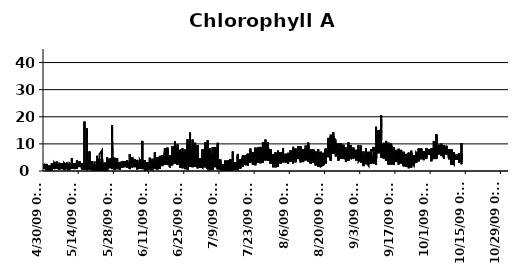
| Category | ug/L |
|---|---|
| 10/13/09 | 5.2 |
| 10/13/09 | 5.2 |
| 10/13/09 | 5.9 |
| 10/13/09 | 5.5 |
| 10/13/09 | 5.2 |
| 10/13/09 | 5.5 |
| 10/13/09 | 3.6 |
| 10/13/09 | 4.7 |
| 10/13/09 | 5.2 |
| 10/13/09 | 4.5 |
| 10/13/09 | 5 |
| 10/13/09 | 6 |
| 10/13/09 | 4.4 |
| 10/13/09 | 4.2 |
| 10/13/09 | 4.8 |
| 10/13/09 | 3.8 |
| 10/13/09 | 3.7 |
| 10/13/09 | 2.5 |
| 10/13/09 | 2.9 |
| 10/13/09 | 3 |
| 10/13/09 | 3.1 |
| 10/13/09 | 3.5 |
| 10/13/09 | 4.1 |
| 10/13/09 | 4 |
| 10/13/09 | 3.4 |
| 10/13/09 | 3.9 |
| 10/13/09 | 3.7 |
| 10/13/09 | 3.9 |
| 10/13/09 | 10.3 |
| 10/13/09 | 3.6 |
| 10/13/09 | 3.6 |
| 10/13/09 | 5.2 |
| 10/12/09 | 5 |
| 10/12/09 | 5.5 |
| 10/12/09 | 3.6 |
| 10/12/09 | 5 |
| 10/12/09 | 4.4 |
| 10/12/09 | 3.9 |
| 10/12/09 | 5.3 |
| 10/12/09 | 4.4 |
| 10/12/09 | 5.6 |
| 10/12/09 | 6.2 |
| 10/12/09 | 5.9 |
| 10/12/09 | 5.2 |
| 10/12/09 | 5.2 |
| 10/12/09 | 4.6 |
| 10/12/09 | 4.1 |
| 10/12/09 | 4.8 |
| 10/12/09 | 4.7 |
| 10/12/09 | 4.6 |
| 10/12/09 | 5.4 |
| 10/12/09 | 5.1 |
| 10/12/09 | 4.1 |
| 10/12/09 | 4.8 |
| 10/12/09 | 5.3 |
| 10/12/09 | 5.9 |
| 10/12/09 | 5.3 |
| 10/12/09 | 6.5 |
| 10/12/09 | 5.3 |
| 10/12/09 | 5.5 |
| 10/12/09 | 4.9 |
| 10/12/09 | 5.9 |
| 10/12/09 | 4.3 |
| 10/12/09 | 5.9 |
| 10/12/09 | 5.2 |
| 10/12/09 | 6.1 |
| 10/12/09 | 5 |
| 10/12/09 | 4.5 |
| 10/12/09 | 5 |
| 10/12/09 | 5.3 |
| 10/12/09 | 3.4 |
| 10/12/09 | 4.4 |
| 10/12/09 | 3.1 |
| 10/12/09 | 3.6 |
| 10/12/09 | 3.1 |
| 10/12/09 | 4.2 |
| 10/12/09 | 5.3 |
| 10/12/09 | 4.3 |
| 10/12/09 | 3.4 |
| 10/12/09 | 4.4 |
| 10/11/09 | 5.1 |
| 10/11/09 | 4.6 |
| 10/11/09 | 5.5 |
| 10/11/09 | 4.8 |
| 10/11/09 | 5.3 |
| 10/11/09 | 4.7 |
| 10/11/09 | 5.6 |
| 10/11/09 | 4.6 |
| 10/11/09 | 5.1 |
| 10/11/09 | 4.1 |
| 10/11/09 | 5.2 |
| 10/11/09 | 5.5 |
| 10/11/09 | 5.5 |
| 10/11/09 | 5.6 |
| 10/11/09 | 4.7 |
| 10/11/09 | 5.4 |
| 10/11/09 | 4.7 |
| 10/11/09 | 5.6 |
| 10/11/09 | 4.8 |
| 10/11/09 | 4.3 |
| 10/11/09 | 5.6 |
| 10/11/09 | 5.8 |
| 10/11/09 | 5.8 |
| 10/11/09 | 6.1 |
| 10/11/09 | 5.7 |
| 10/11/09 | 5.2 |
| 10/11/09 | 4.8 |
| 10/11/09 | 5 |
| 10/11/09 | 5.3 |
| 10/11/09 | 4.4 |
| 10/11/09 | 4.6 |
| 10/11/09 | 4.9 |
| 10/11/09 | 4.4 |
| 10/11/09 | 5.9 |
| 10/11/09 | 5.2 |
| 10/11/09 | 5.6 |
| 10/11/09 | 5.2 |
| 10/11/09 | 4.5 |
| 10/11/09 | 5.3 |
| 10/11/09 | 4.8 |
| 10/11/09 | 5.3 |
| 10/11/09 | 4.6 |
| 10/11/09 | 6.1 |
| 10/11/09 | 4.4 |
| 10/11/09 | 5.7 |
| 10/11/09 | 5 |
| 10/11/09 | 5.1 |
| 10/11/09 | 4.8 |
| 10/10/09 | 4.4 |
| 10/10/09 | 4.7 |
| 10/10/09 | 4.8 |
| 10/10/09 | 4.8 |
| 10/10/09 | 3.3 |
| 10/10/09 | 4.6 |
| 10/10/09 | 4.4 |
| 10/10/09 | 4.6 |
| 10/10/09 | 5.1 |
| 10/10/09 | 4.6 |
| 10/10/09 | 4.8 |
| 10/10/09 | 5.5 |
| 10/10/09 | 5 |
| 10/10/09 | 6.6 |
| 10/10/09 | 6.1 |
| 10/10/09 | 6.2 |
| 10/10/09 | 5.2 |
| 10/10/09 | 6.6 |
| 10/10/09 | 5.7 |
| 10/10/09 | 5.9 |
| 10/10/09 | 6.6 |
| 10/10/09 | 6.2 |
| 10/10/09 | 5.1 |
| 10/10/09 | 7 |
| 10/10/09 | 5.6 |
| 10/10/09 | 6.1 |
| 10/10/09 | 4.4 |
| 10/10/09 | 5.7 |
| 10/10/09 | 4.9 |
| 10/10/09 | 5.8 |
| 10/10/09 | 6.3 |
| 10/10/09 | 5.4 |
| 10/10/09 | 4.2 |
| 10/10/09 | 5.6 |
| 10/10/09 | 5.2 |
| 10/10/09 | 5.5 |
| 10/10/09 | 6.3 |
| 10/10/09 | 5 |
| 10/10/09 | 4.9 |
| 10/10/09 | 6.4 |
| 10/10/09 | 6.4 |
| 10/10/09 | 5.8 |
| 10/10/09 | 6.2 |
| 10/10/09 | 5.6 |
| 10/10/09 | 5.3 |
| 10/10/09 | 3.4 |
| 10/10/09 | 4.9 |
| 10/10/09 | 2.4 |
| 10/9/09 | 3.3 |
| 10/9/09 | 4.7 |
| 10/9/09 | 3.6 |
| 10/9/09 | 3.5 |
| 10/9/09 | 3.2 |
| 10/9/09 | 5.4 |
| 10/9/09 | 5.5 |
| 10/9/09 | 5.3 |
| 10/9/09 | 6.5 |
| 10/9/09 | 7.1 |
| 10/9/09 | 6.5 |
| 10/9/09 | 3.3 |
| 10/9/09 | 6.6 |
| 10/9/09 | 3.5 |
| 10/9/09 | 8 |
| 10/9/09 | 7 |
| 10/9/09 | 7.9 |
| 10/9/09 | 5 |
| 10/9/09 | 5.4 |
| 10/9/09 | 5.5 |
| 10/9/09 | 5.2 |
| 10/9/09 | 4.7 |
| 10/9/09 | 5.4 |
| 10/9/09 | 4.3 |
| 10/9/09 | 2.3 |
| 10/9/09 | 3.6 |
| 10/9/09 | 3.6 |
| 10/9/09 | 3.8 |
| 10/9/09 | 3.8 |
| 10/9/09 | 5.5 |
| 10/9/09 | 5.5 |
| 10/9/09 | 5.2 |
| 10/9/09 | 4.7 |
| 10/9/09 | 4.5 |
| 10/9/09 | 5 |
| 10/9/09 | 4.2 |
| 10/9/09 | 2.6 |
| 10/9/09 | 3.3 |
| 10/9/09 | 3.9 |
| 10/9/09 | 4.3 |
| 10/9/09 | 3.8 |
| 10/9/09 | 3.7 |
| 10/9/09 | 2.4 |
| 10/9/09 | 3.1 |
| 10/9/09 | 4.2 |
| 10/9/09 | 4.9 |
| 10/9/09 | 5 |
| 10/9/09 | 4.8 |
| 10/8/09 | 6.9 |
| 10/8/09 | 5.7 |
| 10/8/09 | 7 |
| 10/8/09 | 6.9 |
| 10/8/09 | 6.2 |
| 10/8/09 | 6.2 |
| 10/8/09 | 6.6 |
| 10/8/09 | 5.9 |
| 10/8/09 | 5.8 |
| 10/8/09 | 4.8 |
| 10/8/09 | 6.7 |
| 10/8/09 | 6.3 |
| 10/8/09 | 6.3 |
| 10/8/09 | 6 |
| 10/8/09 | 6.3 |
| 10/8/09 | 8 |
| 10/8/09 | 7.4 |
| 10/8/09 | 7.8 |
| 10/8/09 | 6.7 |
| 10/8/09 | 6.2 |
| 10/8/09 | 6.4 |
| 10/8/09 | 7.7 |
| 10/8/09 | 7.3 |
| 10/8/09 | 5.6 |
| 10/8/09 | 5.9 |
| 10/8/09 | 5.2 |
| 10/8/09 | 5.2 |
| 10/8/09 | 5.4 |
| 10/8/09 | 5.6 |
| 10/8/09 | 5.9 |
| 10/8/09 | 6.4 |
| 10/8/09 | 7.2 |
| 10/8/09 | 5.6 |
| 10/8/09 | 5.5 |
| 10/8/09 | 7.1 |
| 10/8/09 | 6.5 |
| 10/8/09 | 6.6 |
| 10/8/09 | 7.7 |
| 10/8/09 | 6.3 |
| 10/8/09 | 6.5 |
| 10/8/09 | 6.5 |
| 10/8/09 | 5.6 |
| 10/8/09 | 4.3 |
| 10/8/09 | 7 |
| 10/8/09 | 5.1 |
| 10/8/09 | 5.5 |
| 10/8/09 | 7.2 |
| 10/8/09 | 6.6 |
| 10/7/09 | 7.8 |
| 10/7/09 | 6.1 |
| 10/7/09 | 7.1 |
| 10/7/09 | 6.2 |
| 10/7/09 | 8.1 |
| 10/7/09 | 8 |
| 10/7/09 | 7 |
| 10/7/09 | 8.5 |
| 10/7/09 | 7.3 |
| 10/7/09 | 7.9 |
| 10/7/09 | 7 |
| 10/7/09 | 7 |
| 10/7/09 | 6.8 |
| 10/7/09 | 6.7 |
| 10/7/09 | 7 |
| 10/7/09 | 8.2 |
| 10/7/09 | 6.4 |
| 10/7/09 | 6.2 |
| 10/7/09 | 6.7 |
| 10/7/09 | 6.4 |
| 10/7/09 | 7.5 |
| 10/7/09 | 6.8 |
| 10/7/09 | 6.5 |
| 10/7/09 | 7 |
| 10/7/09 | 7.4 |
| 10/7/09 | 6.8 |
| 10/7/09 | 6.5 |
| 10/7/09 | 6.9 |
| 10/7/09 | 6.8 |
| 10/7/09 | 8.3 |
| 10/7/09 | 7.8 |
| 10/7/09 | 8.1 |
| 10/7/09 | 7.1 |
| 10/7/09 | 8.2 |
| 10/7/09 | 7.9 |
| 10/7/09 | 7.5 |
| 10/7/09 | 9.3 |
| 10/7/09 | 9.3 |
| 10/7/09 | 8.5 |
| 10/7/09 | 7.2 |
| 10/7/09 | 7.3 |
| 10/7/09 | 7.6 |
| 10/7/09 | 7.6 |
| 10/7/09 | 8.2 |
| 10/7/09 | 8.4 |
| 10/7/09 | 7.8 |
| 10/7/09 | 6.9 |
| 10/7/09 | 8.4 |
| 10/6/09 | 8.1 |
| 10/6/09 | 7.3 |
| 10/6/09 | 7.3 |
| 10/6/09 | 7.5 |
| 10/6/09 | 8 |
| 10/6/09 | 8.3 |
| 10/6/09 | 7.3 |
| 10/6/09 | 5.5 |
| 10/6/09 | 5.8 |
| 10/6/09 | 7.4 |
| 10/6/09 | 7.6 |
| 10/6/09 | 6.8 |
| 10/6/09 | 7.3 |
| 10/6/09 | 7.1 |
| 10/6/09 | 5.2 |
| 10/6/09 | 7.3 |
| 10/6/09 | 7.2 |
| 10/6/09 | 8.6 |
| 10/6/09 | 8.2 |
| 10/6/09 | 6.4 |
| 10/6/09 | 7.2 |
| 10/6/09 | 4.9 |
| 10/6/09 | 6.6 |
| 10/6/09 | 6.3 |
| 10/6/09 | 6.5 |
| 10/6/09 | 6.7 |
| 10/6/09 | 6.4 |
| 10/6/09 | 5.2 |
| 10/6/09 | 6 |
| 10/6/09 | 7.6 |
| 10/6/09 | 9.4 |
| 10/6/09 | 8.9 |
| 10/6/09 | 9.2 |
| 10/6/09 | 9 |
| 10/6/09 | 7.8 |
| 10/6/09 | 8.2 |
| 10/6/09 | 7.8 |
| 10/6/09 | 7.6 |
| 10/6/09 | 4.6 |
| 10/6/09 | 8.4 |
| 10/6/09 | 8 |
| 10/6/09 | 8.3 |
| 10/6/09 | 8.2 |
| 10/6/09 | 9.4 |
| 10/6/09 | 5.8 |
| 10/6/09 | 6.2 |
| 10/6/09 | 6.7 |
| 10/6/09 | 6.4 |
| 10/5/09 | 7.4 |
| 10/5/09 | 7.5 |
| 10/5/09 | 7.3 |
| 10/5/09 | 6.5 |
| 10/5/09 | 6.1 |
| 10/5/09 | 7.9 |
| 10/5/09 | 8.5 |
| 10/5/09 | 7 |
| 10/5/09 | 5.5 |
| 10/5/09 | 8.9 |
| 10/5/09 | 7.4 |
| 10/5/09 | 6.9 |
| 10/5/09 | 7.8 |
| 10/5/09 | 7 |
| 10/5/09 | 7.1 |
| 10/5/09 | 8.4 |
| 10/5/09 | 6.9 |
| 10/5/09 | 7.5 |
| 10/5/09 | 8.5 |
| 10/5/09 | 8.3 |
| 10/5/09 | 8 |
| 10/5/09 | 7.9 |
| 10/5/09 | 7.2 |
| 10/5/09 | 9.1 |
| 10/5/09 | 10.1 |
| 10/5/09 | 8.6 |
| 10/5/09 | 8.5 |
| 10/5/09 | 8.1 |
| 10/5/09 | 6.5 |
| 10/5/09 | 8.5 |
| 10/5/09 | 8 |
| 10/5/09 | 7.8 |
| 10/5/09 | 8.8 |
| 10/5/09 | 9.5 |
| 10/5/09 | 9 |
| 10/5/09 | 8.6 |
| 10/5/09 | 7.7 |
| 10/5/09 | 7.3 |
| 10/5/09 | 8.1 |
| 10/5/09 | 7.6 |
| 10/5/09 | 7 |
| 10/5/09 | 8.1 |
| 10/5/09 | 8.5 |
| 10/5/09 | 7.7 |
| 10/5/09 | 7.5 |
| 10/5/09 | 7 |
| 10/5/09 | 7.1 |
| 10/5/09 | 7.5 |
| 10/4/09 | 8 |
| 10/4/09 | 9.7 |
| 10/4/09 | 8 |
| 10/4/09 | 8.1 |
| 10/4/09 | 8.6 |
| 10/4/09 | 8 |
| 10/4/09 | 8.9 |
| 10/4/09 | 7.6 |
| 10/4/09 | 8.9 |
| 10/4/09 | 8.6 |
| 10/4/09 | 8.4 |
| 10/4/09 | 8.7 |
| 10/4/09 | 8.1 |
| 10/4/09 | 8.6 |
| 10/4/09 | 9.2 |
| 10/4/09 | 9.5 |
| 10/4/09 | 9.3 |
| 10/4/09 | 7.5 |
| 10/4/09 | 7.8 |
| 10/4/09 | 8 |
| 10/4/09 | 8.1 |
| 10/4/09 | 9.3 |
| 10/4/09 | 7.7 |
| 10/4/09 | 8.3 |
| 10/4/09 | 7.6 |
| 10/4/09 | 7.8 |
| 10/4/09 | 7.9 |
| 10/4/09 | 7.5 |
| 10/4/09 | 8 |
| 10/4/09 | 7.1 |
| 10/4/09 | 8.7 |
| 10/4/09 | 7.5 |
| 10/4/09 | 6.5 |
| 10/4/09 | 7.7 |
| 10/4/09 | 7.8 |
| 10/4/09 | 8 |
| 10/4/09 | 6.4 |
| 10/4/09 | 6.4 |
| 10/4/09 | 7.8 |
| 10/4/09 | 6.6 |
| 10/4/09 | 8.2 |
| 10/4/09 | 7.9 |
| 10/4/09 | 8.7 |
| 10/4/09 | 8.3 |
| 10/4/09 | 8.8 |
| 10/4/09 | 8.2 |
| 10/4/09 | 8.3 |
| 10/4/09 | 6.1 |
| 10/3/09 | 8.8 |
| 10/3/09 | 7.6 |
| 10/3/09 | 8.5 |
| 10/3/09 | 6.6 |
| 10/3/09 | 5 |
| 10/3/09 | 5.6 |
| 10/3/09 | 6.6 |
| 10/3/09 | 8 |
| 10/3/09 | 6.7 |
| 10/3/09 | 6.6 |
| 10/3/09 | 7.3 |
| 10/3/09 | 8.6 |
| 10/3/09 | 8.4 |
| 10/3/09 | 8.7 |
| 10/3/09 | 9.7 |
| 10/3/09 | 10.7 |
| 10/3/09 | 12.1 |
| 10/3/09 | 13.4 |
| 10/3/09 | 9.8 |
| 10/3/09 | 7.5 |
| 10/3/09 | 9.2 |
| 10/3/09 | 10.5 |
| 10/3/09 | 11 |
| 10/3/09 | 13.5 |
| 10/3/09 | 9.5 |
| 10/3/09 | 9.2 |
| 10/3/09 | 7.1 |
| 10/3/09 | 6.5 |
| 10/3/09 | 4.5 |
| 10/3/09 | 6.2 |
| 10/3/09 | 5.5 |
| 10/3/09 | 6.4 |
| 10/3/09 | 5.3 |
| 10/3/09 | 6.9 |
| 10/3/09 | 6.6 |
| 10/3/09 | 5.8 |
| 10/3/09 | 4.4 |
| 10/3/09 | 7.4 |
| 10/3/09 | 7 |
| 10/3/09 | 6.2 |
| 10/3/09 | 4.7 |
| 10/3/09 | 6 |
| 10/3/09 | 6.1 |
| 10/3/09 | 5.3 |
| 10/3/09 | 5.5 |
| 10/3/09 | 5.4 |
| 10/3/09 | 6.2 |
| 10/3/09 | 5.7 |
| 10/2/09 | 6.4 |
| 10/2/09 | 6.7 |
| 10/2/09 | 7.7 |
| 10/2/09 | 7.6 |
| 10/2/09 | 6.6 |
| 10/2/09 | 6.5 |
| 10/2/09 | 5.3 |
| 10/2/09 | 7.5 |
| 10/2/09 | 7.6 |
| 10/2/09 | 7.2 |
| 10/2/09 | 7.5 |
| 10/2/09 | 7.9 |
| 10/2/09 | 8.4 |
| 10/2/09 | 8.4 |
| 10/2/09 | 7.2 |
| 10/2/09 | 5.9 |
| 10/2/09 | 7.7 |
| 10/2/09 | 7.9 |
| 10/2/09 | 8.6 |
| 10/2/09 | 4.7 |
| 10/2/09 | 11 |
| 10/2/09 | 4.4 |
| 10/2/09 | 4.4 |
| 10/2/09 | 7.3 |
| 10/2/09 | 5.2 |
| 10/2/09 | 7.4 |
| 10/2/09 | 7.3 |
| 10/2/09 | 6.6 |
| 10/2/09 | 5.9 |
| 10/2/09 | 6.1 |
| 10/2/09 | 5.5 |
| 10/2/09 | 6.7 |
| 10/2/09 | 5.8 |
| 10/2/09 | 5.6 |
| 10/2/09 | 5 |
| 10/2/09 | 6 |
| 10/2/09 | 6 |
| 10/2/09 | 5.3 |
| 10/2/09 | 5.9 |
| 10/2/09 | 6.1 |
| 10/2/09 | 5.8 |
| 10/2/09 | 5.2 |
| 10/2/09 | 6.1 |
| 10/2/09 | 5.5 |
| 10/2/09 | 6.2 |
| 10/2/09 | 5.8 |
| 10/2/09 | 5.5 |
| 10/2/09 | 5.6 |
| 10/1/09 | 4.9 |
| 10/1/09 | 6.1 |
| 10/1/09 | 3.6 |
| 10/1/09 | 5.7 |
| 10/1/09 | 5.7 |
| 10/1/09 | 5.1 |
| 10/1/09 | 6.2 |
| 10/1/09 | 5.6 |
| 10/1/09 | 5.8 |
| 10/1/09 | 6.3 |
| 10/1/09 | 5.3 |
| 10/1/09 | 6.8 |
| 10/1/09 | 6 |
| 10/1/09 | 5.8 |
| 10/1/09 | 6.7 |
| 10/1/09 | 5.5 |
| 10/1/09 | 6 |
| 10/1/09 | 7.6 |
| 10/1/09 | 6.3 |
| 10/1/09 | 8.3 |
| 10/1/09 | 6 |
| 10/1/09 | 7.2 |
| 10/1/09 | 5.8 |
| 10/1/09 | 5.2 |
| 10/1/09 | 5.4 |
| 10/1/09 | 5.2 |
| 10/1/09 | 4.7 |
| 10/1/09 | 4.8 |
| 10/1/09 | 4.2 |
| 10/1/09 | 5.4 |
| 10/1/09 | 5.2 |
| 10/1/09 | 5 |
| 10/1/09 | 5.5 |
| 10/1/09 | 5 |
| 10/1/09 | 4.8 |
| 10/1/09 | 5.5 |
| 10/1/09 | 5 |
| 10/1/09 | 5.1 |
| 10/1/09 | 4.8 |
| 10/1/09 | 7.2 |
| 10/1/09 | 5.8 |
| 10/1/09 | 6.6 |
| 10/1/09 | 6.5 |
| 10/1/09 | 6.7 |
| 10/1/09 | 5.5 |
| 10/1/09 | 6.2 |
| 10/1/09 | 5.8 |
| 10/1/09 | 6.3 |
| 9/30/09 | 6.5 |
| 9/30/09 | 6.3 |
| 9/30/09 | 7.2 |
| 9/30/09 | 7.3 |
| 9/30/09 | 6.8 |
| 9/30/09 | 7.5 |
| 9/30/09 | 6.2 |
| 9/30/09 | 6.2 |
| 9/30/09 | 7.2 |
| 9/30/09 | 7.1 |
| 9/30/09 | 6.3 |
| 9/30/09 | 6.6 |
| 9/30/09 | 7.6 |
| 9/30/09 | 7.3 |
| 9/30/09 | 7.4 |
| 9/30/09 | 7.2 |
| 9/30/09 | 7.7 |
| 9/30/09 | 6.1 |
| 9/30/09 | 6.5 |
| 9/30/09 | 6.5 |
| 9/30/09 | 7.1 |
| 9/30/09 | 7.1 |
| 9/30/09 | 7.1 |
| 9/30/09 | 7.9 |
| 9/30/09 | 7.9 |
| 9/30/09 | 8 |
| 9/30/09 | 7.8 |
| 9/30/09 | 6.2 |
| 9/30/09 | 6.3 |
| 9/30/09 | 6.9 |
| 9/30/09 | 6.8 |
| 9/30/09 | 6.2 |
| 9/30/09 | 6.6 |
| 9/30/09 | 6.8 |
| 9/30/09 | 6.2 |
| 9/30/09 | 5.9 |
| 9/30/09 | 6.6 |
| 9/30/09 | 7.9 |
| 9/30/09 | 6.2 |
| 9/30/09 | 6.7 |
| 9/30/09 | 6.1 |
| 9/30/09 | 7 |
| 9/30/09 | 6.4 |
| 9/30/09 | 7.8 |
| 9/30/09 | 7.4 |
| 9/30/09 | 6.5 |
| 9/30/09 | 6 |
| 9/30/09 | 6.9 |
| 9/29/09 | 7.7 |
| 9/29/09 | 7 |
| 9/29/09 | 7.1 |
| 9/29/09 | 6.3 |
| 9/29/09 | 7.3 |
| 9/29/09 | 7.9 |
| 9/29/09 | 7.1 |
| 9/29/09 | 8 |
| 9/29/09 | 7.9 |
| 9/29/09 | 6.8 |
| 9/29/09 | 7.9 |
| 9/29/09 | 6.3 |
| 9/29/09 | 6.6 |
| 9/29/09 | 8.5 |
| 9/29/09 | 7 |
| 9/29/09 | 6.5 |
| 9/29/09 | 7.4 |
| 9/29/09 | 7.8 |
| 9/29/09 | 7.2 |
| 9/29/09 | 7.8 |
| 9/29/09 | 7.3 |
| 9/29/09 | 6 |
| 9/29/09 | 7.4 |
| 9/29/09 | 6.4 |
| 9/29/09 | 5.8 |
| 9/29/09 | 6.9 |
| 9/29/09 | 5.9 |
| 9/29/09 | 6.2 |
| 9/29/09 | 5.5 |
| 9/29/09 | 4.4 |
| 9/29/09 | 6.1 |
| 9/29/09 | 5.3 |
| 9/29/09 | 5.3 |
| 9/29/09 | 5.4 |
| 9/29/09 | 6.1 |
| 9/29/09 | 6.2 |
| 9/29/09 | 6 |
| 9/29/09 | 6.8 |
| 9/29/09 | 5.4 |
| 9/29/09 | 7.2 |
| 9/29/09 | 6 |
| 9/29/09 | 5.8 |
| 9/29/09 | 5 |
| 9/29/09 | 5.9 |
| 9/29/09 | 5.6 |
| 9/29/09 | 6.7 |
| 9/29/09 | 5.4 |
| 9/29/09 | 5.5 |
| 9/28/09 | 5.8 |
| 9/28/09 | 6 |
| 9/28/09 | 5.6 |
| 9/28/09 | 6.1 |
| 9/28/09 | 6.2 |
| 9/28/09 | 6.6 |
| 9/28/09 | 7.3 |
| 9/28/09 | 7.1 |
| 9/28/09 | 7.6 |
| 9/28/09 | 6.8 |
| 9/28/09 | 5.6 |
| 9/28/09 | 6.6 |
| 9/28/09 | 6.5 |
| 9/28/09 | 7.1 |
| 9/28/09 | 6.8 |
| 9/28/09 | 6.8 |
| 9/28/09 | 6 |
| 9/28/09 | 7.3 |
| 9/28/09 | 7.5 |
| 9/28/09 | 6.6 |
| 9/28/09 | 6.7 |
| 9/28/09 | 6.2 |
| 9/28/09 | 5.4 |
| 9/28/09 | 7.1 |
| 9/28/09 | 6.8 |
| 9/28/09 | 5.7 |
| 9/28/09 | 5.7 |
| 9/28/09 | 4.9 |
| 9/28/09 | 5.4 |
| 9/28/09 | 5.4 |
| 9/28/09 | 5.8 |
| 9/28/09 | 5.1 |
| 9/28/09 | 6 |
| 9/28/09 | 5.6 |
| 9/28/09 | 4.9 |
| 9/28/09 | 5.7 |
| 9/28/09 | 5.1 |
| 9/28/09 | 6 |
| 9/28/09 | 5.2 |
| 9/28/09 | 4.8 |
| 9/28/09 | 5.8 |
| 9/28/09 | 4.9 |
| 9/28/09 | 5.9 |
| 9/28/09 | 4.5 |
| 9/28/09 | 4 |
| 9/28/09 | 5.1 |
| 9/28/09 | 5.6 |
| 9/28/09 | 5.8 |
| 9/27/09 | 5.2 |
| 9/27/09 | 5.4 |
| 9/27/09 | 5.8 |
| 9/27/09 | 5.5 |
| 9/27/09 | 6 |
| 9/27/09 | 4.7 |
| 9/27/09 | 5.9 |
| 9/27/09 | 5.2 |
| 9/27/09 | 4.9 |
| 9/27/09 | 6.8 |
| 9/27/09 | 6 |
| 9/27/09 | 7 |
| 9/27/09 | 6.4 |
| 9/27/09 | 6.9 |
| 9/27/09 | 4.9 |
| 9/27/09 | 5.2 |
| 9/27/09 | 5.4 |
| 9/27/09 | 5.7 |
| 9/27/09 | 6.8 |
| 9/27/09 | 7 |
| 9/27/09 | 5.4 |
| 9/27/09 | 7.1 |
| 9/27/09 | 6.2 |
| 9/27/09 | 6.7 |
| 9/27/09 | 8.1 |
| 9/27/09 | 5.8 |
| 9/27/09 | 8.3 |
| 9/27/09 | 6.9 |
| 9/27/09 | 6.2 |
| 9/27/09 | 6 |
| 9/27/09 | 6.2 |
| 9/27/09 | 5.9 |
| 9/27/09 | 6.1 |
| 9/27/09 | 4.8 |
| 9/27/09 | 6.5 |
| 9/27/09 | 5.1 |
| 9/27/09 | 6 |
| 9/27/09 | 5.2 |
| 9/27/09 | 5 |
| 9/27/09 | 4.8 |
| 9/27/09 | 5.4 |
| 9/27/09 | 4.6 |
| 9/27/09 | 5.1 |
| 9/27/09 | 5.5 |
| 9/27/09 | 4.9 |
| 9/27/09 | 5.2 |
| 9/27/09 | 4.3 |
| 9/27/09 | 5.5 |
| 9/26/09 | 4.3 |
| 9/26/09 | 6.6 |
| 9/26/09 | 7.2 |
| 9/26/09 | 5.1 |
| 9/26/09 | 5.9 |
| 9/26/09 | 4.6 |
| 9/26/09 | 8.3 |
| 9/26/09 | 7.7 |
| 9/26/09 | 8.1 |
| 9/26/09 | 5.4 |
| 9/26/09 | 7 |
| 9/26/09 | 7.4 |
| 9/26/09 | 7.4 |
| 9/26/09 | 7.6 |
| 9/26/09 | 7.1 |
| 9/26/09 | 6.5 |
| 9/26/09 | 6 |
| 9/26/09 | 7.1 |
| 9/26/09 | 6.5 |
| 9/26/09 | 6.8 |
| 9/26/09 | 7 |
| 9/26/09 | 5 |
| 9/26/09 | 6.8 |
| 9/26/09 | 6.1 |
| 9/26/09 | 7 |
| 9/26/09 | 5.9 |
| 9/26/09 | 6.7 |
| 9/26/09 | 6.1 |
| 9/26/09 | 5.5 |
| 9/26/09 | 5.8 |
| 9/26/09 | 5.2 |
| 9/26/09 | 4.4 |
| 9/26/09 | 4.9 |
| 9/26/09 | 4.1 |
| 9/26/09 | 3.6 |
| 9/26/09 | 5 |
| 9/26/09 | 5.3 |
| 9/26/09 | 4.5 |
| 9/26/09 | 5.6 |
| 9/26/09 | 5.5 |
| 9/26/09 | 6.7 |
| 9/26/09 | 6 |
| 9/26/09 | 6.1 |
| 9/26/09 | 6.2 |
| 9/26/09 | 5.3 |
| 9/26/09 | 4.5 |
| 9/26/09 | 6.5 |
| 9/26/09 | 5.4 |
| 9/25/09 | 6.7 |
| 9/25/09 | 6.3 |
| 9/25/09 | 6.6 |
| 9/25/09 | 5.4 |
| 9/25/09 | 5.2 |
| 9/25/09 | 4.5 |
| 9/25/09 | 5.4 |
| 9/25/09 | 5.4 |
| 9/25/09 | 5.4 |
| 9/25/09 | 5.5 |
| 9/25/09 | 4 |
| 9/25/09 | 3.1 |
| 9/25/09 | 2.9 |
| 9/25/09 | 4.8 |
| 9/25/09 | 5.5 |
| 9/25/09 | 5.1 |
| 9/25/09 | 5.2 |
| 9/25/09 | 4.7 |
| 9/25/09 | 5.4 |
| 9/25/09 | 6 |
| 9/25/09 | 6.2 |
| 9/25/09 | 5 |
| 9/25/09 | 5.7 |
| 9/25/09 | 4.8 |
| 9/25/09 | 4.6 |
| 9/25/09 | 6.9 |
| 9/25/09 | 4.3 |
| 9/25/09 | 4.9 |
| 9/25/09 | 5.3 |
| 9/25/09 | 5.1 |
| 9/25/09 | 4.9 |
| 9/25/09 | 5.8 |
| 9/25/09 | 5.5 |
| 9/25/09 | 5.6 |
| 9/25/09 | 4.1 |
| 9/25/09 | 4.7 |
| 9/25/09 | 3.1 |
| 9/25/09 | 5.5 |
| 9/25/09 | 3.5 |
| 9/25/09 | 4.8 |
| 9/25/09 | 5.1 |
| 9/25/09 | 4.5 |
| 9/25/09 | 4.7 |
| 9/25/09 | 4.6 |
| 9/25/09 | 4.4 |
| 9/25/09 | 3.4 |
| 9/25/09 | 3.6 |
| 9/25/09 | 3 |
| 9/24/09 | 4.7 |
| 9/24/09 | 3.9 |
| 9/24/09 | 3.3 |
| 9/24/09 | 5.4 |
| 9/24/09 | 4.5 |
| 9/24/09 | 5.4 |
| 9/24/09 | 2.1 |
| 9/24/09 | 2.1 |
| 9/24/09 | 3.7 |
| 9/24/09 | 5.7 |
| 9/24/09 | 4.8 |
| 9/24/09 | 4.1 |
| 9/24/09 | 5.5 |
| 9/24/09 | 3.6 |
| 9/24/09 | 2.8 |
| 9/24/09 | 4.1 |
| 9/24/09 | 3.8 |
| 9/24/09 | 3.5 |
| 9/24/09 | 2.9 |
| 9/24/09 | 3.5 |
| 9/24/09 | 3.1 |
| 9/24/09 | 3.5 |
| 9/24/09 | 4 |
| 9/24/09 | 5.6 |
| 9/24/09 | 4.4 |
| 9/24/09 | 3.6 |
| 9/24/09 | 3.4 |
| 9/24/09 | 2.8 |
| 9/24/09 | 3.8 |
| 9/24/09 | 3.9 |
| 9/24/09 | 3.9 |
| 9/24/09 | 3.3 |
| 9/24/09 | 3.5 |
| 9/24/09 | 3.6 |
| 9/24/09 | 3.6 |
| 9/24/09 | 5.2 |
| 9/24/09 | 3.4 |
| 9/24/09 | 3.3 |
| 9/24/09 | 5.6 |
| 9/24/09 | 3.4 |
| 9/24/09 | 3.6 |
| 9/24/09 | 4.3 |
| 9/24/09 | 2.5 |
| 9/24/09 | 3.3 |
| 9/24/09 | 4.2 |
| 9/24/09 | 5.1 |
| 9/24/09 | 3.1 |
| 9/24/09 | 2.1 |
| 9/23/09 | 3.6 |
| 9/23/09 | 3.8 |
| 9/23/09 | 2.6 |
| 9/23/09 | 2.3 |
| 9/23/09 | 3.2 |
| 9/23/09 | 4.6 |
| 9/23/09 | 3.3 |
| 9/23/09 | 3.9 |
| 9/23/09 | 4.8 |
| 9/23/09 | 1.3 |
| 9/23/09 | 2 |
| 9/23/09 | 3.7 |
| 9/23/09 | 3.6 |
| 9/23/09 | 4.7 |
| 9/23/09 | 4.3 |
| 9/23/09 | 2.7 |
| 9/23/09 | 6.2 |
| 9/23/09 | 6.9 |
| 9/23/09 | 2.9 |
| 9/23/09 | 3.7 |
| 9/23/09 | 7.5 |
| 9/23/09 | 4.6 |
| 9/23/09 | 4.8 |
| 9/23/09 | 5.5 |
| 9/23/09 | 4.4 |
| 9/23/09 | 4.5 |
| 9/23/09 | 6 |
| 9/23/09 | 3.7 |
| 9/23/09 | 3.5 |
| 9/23/09 | 6.5 |
| 9/23/09 | 3.5 |
| 9/23/09 | 4 |
| 9/23/09 | 5.2 |
| 9/23/09 | 4 |
| 9/23/09 | 4.8 |
| 9/23/09 | 4.2 |
| 9/23/09 | 3.2 |
| 9/23/09 | 4 |
| 9/23/09 | 2.8 |
| 9/23/09 | 2.8 |
| 9/23/09 | 3.1 |
| 9/23/09 | 3.6 |
| 9/23/09 | 3.9 |
| 9/23/09 | 3.7 |
| 9/23/09 | 4.9 |
| 9/23/09 | 5.1 |
| 9/23/09 | 4.6 |
| 9/23/09 | 3.6 |
| 9/22/09 | 3.6 |
| 9/22/09 | 4.5 |
| 9/22/09 | 3.7 |
| 9/22/09 | 5.6 |
| 9/22/09 | 6.2 |
| 9/22/09 | 5.9 |
| 9/22/09 | 4.8 |
| 9/22/09 | 1.7 |
| 9/22/09 | 1 |
| 9/22/09 | 3.7 |
| 9/22/09 | 4.8 |
| 9/22/09 | 6 |
| 9/22/09 | 6 |
| 9/22/09 | 6.8 |
| 9/22/09 | 6.7 |
| 9/22/09 | 6.8 |
| 9/22/09 | 6.2 |
| 9/22/09 | 6.1 |
| 9/22/09 | 6.6 |
| 9/22/09 | 4.6 |
| 9/22/09 | 4.1 |
| 9/22/09 | 6.6 |
| 9/22/09 | 6.8 |
| 9/22/09 | 4.3 |
| 9/22/09 | 3.6 |
| 9/22/09 | 2.8 |
| 9/22/09 | 4.2 |
| 9/22/09 | 3 |
| 9/22/09 | 5.3 |
| 9/22/09 | 1.5 |
| 9/22/09 | 3.2 |
| 9/22/09 | 2.5 |
| 9/22/09 | 3.8 |
| 9/22/09 | 3.5 |
| 9/22/09 | 3.8 |
| 9/22/09 | 3.9 |
| 9/22/09 | 2.8 |
| 9/22/09 | 3.9 |
| 9/22/09 | 4.2 |
| 9/22/09 | 2.8 |
| 9/22/09 | 3 |
| 9/22/09 | 2.7 |
| 9/22/09 | 3.4 |
| 9/22/09 | 3.8 |
| 9/22/09 | 1.9 |
| 9/22/09 | 2.5 |
| 9/22/09 | 2.1 |
| 9/22/09 | 4.2 |
| 9/21/09 | 4.7 |
| 9/21/09 | 4.3 |
| 9/21/09 | 5.3 |
| 9/21/09 | 4.3 |
| 9/21/09 | 6.3 |
| 9/21/09 | 6.1 |
| 9/21/09 | 5.8 |
| 9/21/09 | 5 |
| 9/21/09 | 4.2 |
| 9/21/09 | 4.9 |
| 9/21/09 | 4.2 |
| 9/21/09 | 5.5 |
| 9/21/09 | 3.2 |
| 9/21/09 | 4.6 |
| 9/21/09 | 4.5 |
| 9/21/09 | 2.4 |
| 9/21/09 | 2.9 |
| 9/21/09 | 4.4 |
| 9/21/09 | 2.7 |
| 9/21/09 | 2.6 |
| 9/21/09 | 3.4 |
| 9/21/09 | 4.3 |
| 9/21/09 | 1.5 |
| 9/21/09 | 4.2 |
| 9/21/09 | 3.3 |
| 9/21/09 | 4.3 |
| 9/21/09 | 3.6 |
| 9/21/09 | 2.3 |
| 9/21/09 | 4.1 |
| 9/21/09 | 2.6 |
| 9/21/09 | 3.9 |
| 9/21/09 | 2.1 |
| 9/21/09 | 2 |
| 9/21/09 | 2.1 |
| 9/21/09 | 2.4 |
| 9/21/09 | 3.6 |
| 9/21/09 | 2.7 |
| 9/21/09 | 2.3 |
| 9/21/09 | 4.1 |
| 9/21/09 | 3.2 |
| 9/21/09 | 4.3 |
| 9/21/09 | 4.5 |
| 9/21/09 | 4.5 |
| 9/21/09 | 3.5 |
| 9/21/09 | 3.3 |
| 9/21/09 | 3.1 |
| 9/21/09 | 4.6 |
| 9/21/09 | 4.4 |
| 9/20/09 | 3.6 |
| 9/20/09 | 2.8 |
| 9/20/09 | 2.5 |
| 9/20/09 | 2.9 |
| 9/20/09 | 3.1 |
| 9/20/09 | 5.3 |
| 9/20/09 | 5.6 |
| 9/20/09 | 7.1 |
| 9/20/09 | 3.2 |
| 9/20/09 | 1.7 |
| 9/20/09 | 5.7 |
| 9/20/09 | 3.4 |
| 9/20/09 | 2.5 |
| 9/20/09 | 4.2 |
| 9/20/09 | 2 |
| 9/20/09 | 2.3 |
| 9/20/09 | 4.1 |
| 9/20/09 | 3.1 |
| 9/20/09 | 6.2 |
| 9/20/09 | 5.9 |
| 9/20/09 | 6.6 |
| 9/20/09 | 3.6 |
| 9/20/09 | 4.6 |
| 9/20/09 | 3.3 |
| 9/20/09 | 5.2 |
| 9/20/09 | 4.2 |
| 9/20/09 | 5.8 |
| 9/20/09 | 5.6 |
| 9/20/09 | 4.7 |
| 9/20/09 | 3.3 |
| 9/20/09 | 4.7 |
| 9/20/09 | 4.1 |
| 9/20/09 | 5.1 |
| 9/20/09 | 5.5 |
| 9/20/09 | 5.9 |
| 9/20/09 | 5.2 |
| 9/20/09 | 5.5 |
| 9/20/09 | 4.6 |
| 9/20/09 | 6.1 |
| 9/20/09 | 4.4 |
| 9/20/09 | 5.1 |
| 9/20/09 | 4 |
| 9/20/09 | 5 |
| 9/20/09 | 4.7 |
| 9/20/09 | 3.7 |
| 9/20/09 | 5.3 |
| 9/20/09 | 4.8 |
| 9/20/09 | 3.9 |
| 9/19/09 | 4.1 |
| 9/19/09 | 4.6 |
| 9/19/09 | 5.2 |
| 9/19/09 | 3.3 |
| 9/19/09 | 3.4 |
| 9/19/09 | 3.3 |
| 9/19/09 | 5 |
| 9/19/09 | 4.3 |
| 9/19/09 | 5.4 |
| 9/19/09 | 4.2 |
| 9/19/09 | 3.7 |
| 9/19/09 | 3.5 |
| 9/19/09 | 3.8 |
| 9/19/09 | 7.1 |
| 9/19/09 | 7.3 |
| 9/19/09 | 6.1 |
| 9/19/09 | 4 |
| 9/19/09 | 3.8 |
| 9/19/09 | 5 |
| 9/19/09 | 5.1 |
| 9/19/09 | 6.8 |
| 9/19/09 | 6.2 |
| 9/19/09 | 5.4 |
| 9/19/09 | 5.9 |
| 9/19/09 | 7 |
| 9/19/09 | 6.1 |
| 9/19/09 | 6.2 |
| 9/19/09 | 5.9 |
| 9/19/09 | 7.1 |
| 9/19/09 | 5.9 |
| 9/19/09 | 5.2 |
| 9/19/09 | 4.5 |
| 9/19/09 | 4.7 |
| 9/19/09 | 6.1 |
| 9/19/09 | 4.2 |
| 9/19/09 | 3.9 |
| 9/19/09 | 3.2 |
| 9/19/09 | 5.3 |
| 9/19/09 | 7.8 |
| 9/19/09 | 4.2 |
| 9/19/09 | 4.4 |
| 9/19/09 | 6.5 |
| 9/19/09 | 2.8 |
| 9/19/09 | 3.4 |
| 9/19/09 | 3.6 |
| 9/19/09 | 4.4 |
| 9/19/09 | 5 |
| 9/19/09 | 5 |
| 9/18/09 | 3.5 |
| 9/18/09 | 5.4 |
| 9/18/09 | 7.5 |
| 9/18/09 | 6 |
| 9/18/09 | 6.5 |
| 9/18/09 | 6.6 |
| 9/18/09 | 7 |
| 9/18/09 | 7.4 |
| 9/18/09 | 5.8 |
| 9/18/09 | 2.9 |
| 9/18/09 | 2.4 |
| 9/18/09 | 3.6 |
| 9/18/09 | 8 |
| 9/18/09 | 3.4 |
| 9/18/09 | 7.6 |
| 9/18/09 | 7.3 |
| 9/18/09 | 8.2 |
| 9/18/09 | 6.1 |
| 9/18/09 | 5.6 |
| 9/18/09 | 6 |
| 9/18/09 | 6 |
| 9/18/09 | 5.3 |
| 9/18/09 | 4.4 |
| 9/18/09 | 4.6 |
| 9/18/09 | 5.1 |
| 9/18/09 | 4.3 |
| 9/18/09 | 4.1 |
| 9/18/09 | 4.5 |
| 9/18/09 | 5.5 |
| 9/18/09 | 4.3 |
| 9/18/09 | 6.3 |
| 9/18/09 | 5 |
| 9/18/09 | 5.4 |
| 9/18/09 | 5.2 |
| 9/18/09 | 5.2 |
| 9/18/09 | 6.4 |
| 9/18/09 | 5.3 |
| 9/18/09 | 4 |
| 9/18/09 | 3.6 |
| 9/18/09 | 3.7 |
| 9/18/09 | 5.1 |
| 9/18/09 | 4.6 |
| 9/18/09 | 7.3 |
| 9/18/09 | 4.9 |
| 9/18/09 | 5.8 |
| 9/18/09 | 4.3 |
| 9/18/09 | 4.2 |
| 9/18/09 | 5.8 |
| 9/17/09 | 5.7 |
| 9/17/09 | 4.9 |
| 9/17/09 | 5.7 |
| 9/17/09 | 4.8 |
| 9/17/09 | 5.3 |
| 9/17/09 | 6 |
| 9/17/09 | 3.8 |
| 9/17/09 | 5.5 |
| 9/17/09 | 4.9 |
| 9/17/09 | 5.5 |
| 9/17/09 | 3.9 |
| 9/17/09 | 6.4 |
| 9/17/09 | 6 |
| 9/17/09 | 6.4 |
| 9/17/09 | 5.1 |
| 9/17/09 | 5.6 |
| 9/17/09 | 5.4 |
| 9/17/09 | 6.5 |
| 9/17/09 | 6.9 |
| 9/17/09 | 7 |
| 9/17/09 | 5.8 |
| 9/17/09 | 4.8 |
| 9/17/09 | 5.6 |
| 9/17/09 | 7.8 |
| 9/17/09 | 7 |
| 9/17/09 | 6.5 |
| 9/17/09 | 6.2 |
| 9/17/09 | 6.1 |
| 9/17/09 | 6.3 |
| 9/17/09 | 5.8 |
| 9/17/09 | 7 |
| 9/17/09 | 4.2 |
| 9/17/09 | 5.7 |
| 9/17/09 | 6.4 |
| 9/17/09 | 4.3 |
| 9/17/09 | 3.8 |
| 9/17/09 | 3.5 |
| 9/17/09 | 3.6 |
| 9/17/09 | 3.3 |
| 9/17/09 | 5.6 |
| 9/17/09 | 5 |
| 9/17/09 | 4.7 |
| 9/17/09 | 5.3 |
| 9/17/09 | 4.5 |
| 9/17/09 | 4.9 |
| 9/17/09 | 4.6 |
| 9/17/09 | 6.7 |
| 9/17/09 | 5.1 |
| 9/16/09 | 3.4 |
| 9/16/09 | 3.8 |
| 9/16/09 | 5.2 |
| 9/16/09 | 3.5 |
| 9/16/09 | 3.8 |
| 9/16/09 | 5.2 |
| 9/16/09 | 4.4 |
| 9/16/09 | 3.7 |
| 9/16/09 | 6.1 |
| 9/16/09 | 5 |
| 9/16/09 | 5.1 |
| 9/16/09 | 6.7 |
| 9/16/09 | 7 |
| 9/16/09 | 8.3 |
| 9/16/09 | 7.4 |
| 9/16/09 | 7.2 |
| 9/16/09 | 7.4 |
| 9/16/09 | 7.8 |
| 9/16/09 | 8.8 |
| 9/16/09 | 7.7 |
| 9/16/09 | 6.6 |
| 9/16/09 | 8.3 |
| 9/16/09 | 8.4 |
| 9/16/09 | 7.9 |
| 9/16/09 | 7.3 |
| 9/16/09 | 7.5 |
| 9/16/09 | 7.7 |
| 9/16/09 | 7.9 |
| 9/16/09 | 7.1 |
| 9/16/09 | 7.5 |
| 9/16/09 | 7.9 |
| 9/16/09 | 6.5 |
| 9/16/09 | 5.5 |
| 9/16/09 | 3.4 |
| 9/16/09 | 4 |
| 9/16/09 | 2.7 |
| 9/16/09 | 3.3 |
| 9/16/09 | 2.2 |
| 9/16/09 | 3.3 |
| 9/16/09 | 3.6 |
| 9/16/09 | 3.6 |
| 9/16/09 | 2.6 |
| 9/16/09 | 4 |
| 9/16/09 | 3.9 |
| 9/16/09 | 3.6 |
| 9/16/09 | 3.6 |
| 9/16/09 | 4.2 |
| 9/16/09 | 5.7 |
| 9/15/09 | 2.8 |
| 9/15/09 | 3.6 |
| 9/15/09 | 4.6 |
| 9/15/09 | 4.5 |
| 9/15/09 | 6.2 |
| 9/15/09 | 7.2 |
| 9/15/09 | 9.7 |
| 9/15/09 | 10 |
| 9/15/09 | 10.1 |
| 9/15/09 | 4.5 |
| 9/15/09 | 5.9 |
| 9/15/09 | 9.1 |
| 9/15/09 | 2.8 |
| 9/15/09 | 9.3 |
| 9/15/09 | 2.4 |
| 9/15/09 | 9.5 |
| 9/15/09 | 9.2 |
| 9/15/09 | 7.2 |
| 9/15/09 | 7.9 |
| 9/15/09 | 7.4 |
| 9/15/09 | 9.6 |
| 9/15/09 | 8.2 |
| 9/15/09 | 9.2 |
| 9/15/09 | 7.1 |
| 9/15/09 | 6.3 |
| 9/15/09 | 2.7 |
| 9/15/09 | 7.7 |
| 9/15/09 | 4.9 |
| 9/15/09 | 3.9 |
| 9/15/09 | 5 |
| 9/15/09 | 5.1 |
| 9/15/09 | 4.8 |
| 9/15/09 | 4.2 |
| 9/15/09 | 4.2 |
| 9/15/09 | 3.7 |
| 9/15/09 | 6.7 |
| 9/15/09 | 4.7 |
| 9/15/09 | 4.8 |
| 9/15/09 | 4.6 |
| 9/15/09 | 5.7 |
| 9/15/09 | 5.9 |
| 9/15/09 | 3.4 |
| 9/15/09 | 4.7 |
| 9/15/09 | 5.1 |
| 9/15/09 | 6.1 |
| 9/15/09 | 4.6 |
| 9/15/09 | 6 |
| 9/15/09 | 5.3 |
| 9/14/09 | 5.2 |
| 9/14/09 | 5.4 |
| 9/14/09 | 5.5 |
| 9/14/09 | 8.7 |
| 9/14/09 | 7.8 |
| 9/14/09 | 10.4 |
| 9/14/09 | 9.1 |
| 9/14/09 | 9.2 |
| 9/14/09 | 9.5 |
| 9/14/09 | 8.8 |
| 9/14/09 | 7.8 |
| 9/14/09 | 2.9 |
| 9/14/09 | 8.9 |
| 9/14/09 | 8.5 |
| 9/14/09 | 8.4 |
| 9/14/09 | 10.2 |
| 9/14/09 | 10.2 |
| 9/14/09 | 10.4 |
| 9/14/09 | 9.4 |
| 9/14/09 | 9.6 |
| 9/14/09 | 9 |
| 9/14/09 | 8.9 |
| 9/14/09 | 8.2 |
| 9/14/09 | 2.6 |
| 9/14/09 | 3.6 |
| 9/14/09 | 3.3 |
| 9/14/09 | 2.9 |
| 9/14/09 | 2.9 |
| 9/14/09 | 2.3 |
| 9/14/09 | 7 |
| 9/14/09 | 5.7 |
| 9/14/09 | 6 |
| 9/14/09 | 5.6 |
| 9/14/09 | 4.7 |
| 9/14/09 | 3.7 |
| 9/14/09 | 4.7 |
| 9/14/09 | 4.4 |
| 9/14/09 | 4.3 |
| 9/14/09 | 4.7 |
| 9/14/09 | 9.2 |
| 9/14/09 | 5.9 |
| 9/14/09 | 5.6 |
| 9/14/09 | 7.9 |
| 9/14/09 | 7.2 |
| 9/14/09 | 6.2 |
| 9/14/09 | 8.1 |
| 9/14/09 | 7.7 |
| 9/14/09 | 7.2 |
| 9/13/09 | 7.7 |
| 9/13/09 | 7.2 |
| 9/13/09 | 4.6 |
| 9/13/09 | 6.9 |
| 9/13/09 | 6.1 |
| 9/13/09 | 9.2 |
| 9/13/09 | 8.1 |
| 9/13/09 | 8.2 |
| 9/13/09 | 10.4 |
| 9/13/09 | 8.5 |
| 9/13/09 | 8.8 |
| 9/13/09 | 7.5 |
| 9/13/09 | 10.9 |
| 9/13/09 | 9.1 |
| 9/13/09 | 9.9 |
| 9/13/09 | 11.1 |
| 9/13/09 | 10.1 |
| 9/13/09 | 10.6 |
| 9/13/09 | 8.9 |
| 9/13/09 | 10 |
| 9/13/09 | 9.8 |
| 9/13/09 | 8.6 |
| 9/13/09 | 8.2 |
| 9/13/09 | 9.7 |
| 9/13/09 | 10.1 |
| 9/13/09 | 8.8 |
| 9/13/09 | 6.1 |
| 9/13/09 | 4.9 |
| 9/13/09 | 6.3 |
| 9/13/09 | 6.6 |
| 9/13/09 | 5.6 |
| 9/13/09 | 6.8 |
| 9/13/09 | 6.6 |
| 9/13/09 | 7 |
| 9/13/09 | 6.4 |
| 9/13/09 | 6 |
| 9/13/09 | 5.8 |
| 9/13/09 | 5.2 |
| 9/13/09 | 5.1 |
| 9/13/09 | 4.7 |
| 9/13/09 | 6.3 |
| 9/13/09 | 3.7 |
| 9/13/09 | 4.6 |
| 9/13/09 | 4.5 |
| 9/13/09 | 5.3 |
| 9/13/09 | 5.1 |
| 9/13/09 | 5.7 |
| 9/13/09 | 4.2 |
| 9/12/09 | 6.1 |
| 9/12/09 | 5.4 |
| 9/12/09 | 6.2 |
| 9/12/09 | 7.5 |
| 9/12/09 | 7.2 |
| 9/12/09 | 6.4 |
| 9/12/09 | 8.6 |
| 9/12/09 | 8.5 |
| 9/12/09 | 9.7 |
| 9/12/09 | 8.9 |
| 9/12/09 | 8.9 |
| 9/12/09 | 7.8 |
| 9/12/09 | 5.6 |
| 9/12/09 | 6.1 |
| 9/12/09 | 7.5 |
| 9/12/09 | 6.5 |
| 9/12/09 | 7.4 |
| 9/12/09 | 8 |
| 9/12/09 | 10.4 |
| 9/12/09 | 8.5 |
| 9/12/09 | 6.9 |
| 9/12/09 | 9.1 |
| 9/12/09 | 9.2 |
| 9/12/09 | 9.8 |
| 9/12/09 | 6.5 |
| 9/12/09 | 8 |
| 9/12/09 | 7.4 |
| 9/12/09 | 8.5 |
| 9/12/09 | 7 |
| 9/12/09 | 9.4 |
| 9/12/09 | 5.4 |
| 9/12/09 | 6.4 |
| 9/12/09 | 6.8 |
| 9/12/09 | 6.9 |
| 9/12/09 | 5.6 |
| 9/12/09 | 5.5 |
| 9/12/09 | 6.4 |
| 9/12/09 | 6 |
| 9/12/09 | 5.9 |
| 9/12/09 | 4.6 |
| 9/12/09 | 6.5 |
| 9/12/09 | 7 |
| 9/12/09 | 5.1 |
| 9/12/09 | 5.8 |
| 9/12/09 | 5.8 |
| 9/12/09 | 6.7 |
| 9/12/09 | 6.4 |
| 9/12/09 | 7.7 |
| 9/11/09 | 5 |
| 9/11/09 | 4.9 |
| 9/11/09 | 5.9 |
| 9/11/09 | 6.3 |
| 9/11/09 | 9 |
| 9/11/09 | 8.9 |
| 9/11/09 | 8.6 |
| 9/11/09 | 7.5 |
| 9/11/09 | 8 |
| 9/11/09 | 9.8 |
| 9/11/09 | 8.3 |
| 9/11/09 | 8.1 |
| 9/11/09 | 8.7 |
| 9/11/09 | 8.4 |
| 9/11/09 | 8.9 |
| 9/11/09 | 9.4 |
| 9/11/09 | 9.1 |
| 9/11/09 | 7.9 |
| 9/11/09 | 7.2 |
| 9/11/09 | 8.9 |
| 9/11/09 | 7 |
| 9/11/09 | 7.2 |
| 9/11/09 | 8.2 |
| 9/11/09 | 9 |
| 9/11/09 | 7.6 |
| 9/11/09 | 8.6 |
| 9/11/09 | 8.9 |
| 9/11/09 | 16.8 |
| 9/11/09 | 19.3 |
| 9/11/09 | 20.5 |
| 9/11/09 | 15.9 |
| 9/11/09 | 18.7 |
| 9/11/09 | 20.5 |
| 9/11/09 | 18.2 |
| 9/11/09 | 19 |
| 9/11/09 | 13.4 |
| 9/11/09 | 13 |
| 9/11/09 | 11.6 |
| 9/11/09 | 17.9 |
| 9/11/09 | 15.7 |
| 9/11/09 | 14.5 |
| 9/11/09 | 15.1 |
| 9/11/09 | 11.2 |
| 9/11/09 | 11.6 |
| 9/11/09 | 11.2 |
| 9/11/09 | 14 |
| 9/11/09 | 15.7 |
| 9/10/09 | 12.1 |
| 9/10/09 | 12.4 |
| 9/10/09 | 9.7 |
| 9/10/09 | 15.1 |
| 9/10/09 | 13.2 |
| 9/10/09 | 11.8 |
| 9/10/09 | 12.1 |
| 9/10/09 | 11.8 |
| 9/10/09 | 14.1 |
| 9/10/09 | 13.2 |
| 9/10/09 | 14.7 |
| 9/10/09 | 11.7 |
| 9/10/09 | 13.4 |
| 9/10/09 | 13.3 |
| 9/10/09 | 11.6 |
| 9/10/09 | 10.6 |
| 9/10/09 | 10.6 |
| 9/10/09 | 11.7 |
| 9/10/09 | 11.6 |
| 9/10/09 | 13 |
| 9/10/09 | 10.7 |
| 9/10/09 | 8.3 |
| 9/10/09 | 7.4 |
| 9/10/09 | 9.6 |
| 9/10/09 | 11.3 |
| 9/10/09 | 7.9 |
| 9/10/09 | 8.5 |
| 9/10/09 | 10 |
| 9/10/09 | 10.5 |
| 9/10/09 | 11.7 |
| 9/10/09 | 9 |
| 9/10/09 | 8.4 |
| 9/10/09 | 11.2 |
| 9/10/09 | 7.3 |
| 9/10/09 | 6.5 |
| 9/10/09 | 6.2 |
| 9/10/09 | 7.8 |
| 9/10/09 | 7.7 |
| 9/10/09 | 7.7 |
| 9/10/09 | 6.7 |
| 9/10/09 | 8.7 |
| 9/10/09 | 8.6 |
| 9/10/09 | 9.4 |
| 9/10/09 | 9.8 |
| 9/10/09 | 10 |
| 9/10/09 | 7.2 |
| 9/10/09 | 12.6 |
| 9/10/09 | 12.2 |
| 9/9/09 | 12.2 |
| 9/9/09 | 8.4 |
| 9/9/09 | 8.6 |
| 9/9/09 | 15.3 |
| 9/9/09 | 9.6 |
| 9/9/09 | 12.2 |
| 9/9/09 | 10 |
| 9/9/09 | 8.5 |
| 9/9/09 | 9.4 |
| 9/9/09 | 12.6 |
| 9/9/09 | 11.2 |
| 9/9/09 | 12.9 |
| 9/9/09 | 11.1 |
| 9/9/09 | 8 |
| 9/9/09 | 8.7 |
| 9/9/09 | 12.7 |
| 9/9/09 | 10 |
| 9/9/09 | 7.1 |
| 9/9/09 | 9.4 |
| 9/9/09 | 7.6 |
| 9/9/09 | 9.2 |
| 9/9/09 | 7.5 |
| 9/9/09 | 4.8 |
| 9/9/09 | 8.4 |
| 9/9/09 | 7.4 |
| 9/9/09 | 6.2 |
| 9/9/09 | 6.4 |
| 9/9/09 | 2.2 |
| 9/9/09 | 16.3 |
| 9/9/09 | 6.7 |
| 9/9/09 | 8.9 |
| 9/9/09 | 5.9 |
| 9/9/09 | 6.1 |
| 9/9/09 | 9.3 |
| 9/9/09 | 4.6 |
| 9/9/09 | 6.3 |
| 9/9/09 | 5.4 |
| 9/9/09 | 4.4 |
| 9/9/09 | 4.3 |
| 9/9/09 | 4.5 |
| 9/9/09 | 4.8 |
| 9/9/09 | 5.3 |
| 9/9/09 | 5.4 |
| 9/9/09 | 11.1 |
| 9/9/09 | 4.7 |
| 9/9/09 | 5.8 |
| 9/9/09 | 4.2 |
| 9/9/09 | 7.4 |
| 9/8/09 | 4.2 |
| 9/8/09 | 3.1 |
| 9/8/09 | 4.2 |
| 9/8/09 | 4.4 |
| 9/8/09 | 3.9 |
| 9/8/09 | 2.7 |
| 9/8/09 | 4.6 |
| 9/8/09 | 5 |
| 9/8/09 | 6.6 |
| 9/8/09 | 6.5 |
| 9/8/09 | 8.9 |
| 9/8/09 | 7.5 |
| 9/8/09 | 7.9 |
| 9/8/09 | 7.6 |
| 9/8/09 | 8.7 |
| 9/8/09 | 8.6 |
| 9/8/09 | 8.4 |
| 9/8/09 | 7.5 |
| 9/8/09 | 8.2 |
| 9/8/09 | 7.4 |
| 9/8/09 | 5.3 |
| 9/8/09 | 5.6 |
| 9/8/09 | 3.1 |
| 9/8/09 | 3.8 |
| 9/8/09 | 4.5 |
| 9/8/09 | 5.6 |
| 9/8/09 | 3.1 |
| 9/8/09 | 4.3 |
| 9/8/09 | 4.2 |
| 9/8/09 | 4.6 |
| 9/8/09 | 3.4 |
| 9/8/09 | 3.8 |
| 9/8/09 | 4.8 |
| 9/8/09 | 5.1 |
| 9/8/09 | 4.4 |
| 9/8/09 | 3.5 |
| 9/8/09 | 3.3 |
| 9/8/09 | 3.3 |
| 9/8/09 | 4.2 |
| 9/8/09 | 5.4 |
| 9/8/09 | 4.5 |
| 9/8/09 | 4.5 |
| 9/8/09 | 4.5 |
| 9/8/09 | 4.7 |
| 9/8/09 | 3.8 |
| 9/8/09 | 4.5 |
| 9/8/09 | 5.7 |
| 9/8/09 | 4.4 |
| 9/7/09 | 5 |
| 9/7/09 | 3.8 |
| 9/7/09 | 3.9 |
| 9/7/09 | 3.6 |
| 9/7/09 | 4.8 |
| 9/7/09 | 3.1 |
| 9/7/09 | 4.6 |
| 9/7/09 | 5.2 |
| 9/7/09 | 5.2 |
| 9/7/09 | 5.7 |
| 9/7/09 | 8.1 |
| 9/7/09 | 4.1 |
| 9/7/09 | 4.5 |
| 9/7/09 | 3 |
| 9/7/09 | 3 |
| 9/7/09 | 3.5 |
| 9/7/09 | 3.3 |
| 9/7/09 | 4.2 |
| 9/7/09 | 4.7 |
| 9/7/09 | 4.5 |
| 9/7/09 | 5.4 |
| 9/7/09 | 3.7 |
| 9/7/09 | 2.6 |
| 9/7/09 | 5.1 |
| 9/7/09 | 4.1 |
| 9/7/09 | 3.2 |
| 9/7/09 | 3.5 |
| 9/7/09 | 3.7 |
| 9/7/09 | 4 |
| 9/7/09 | 3.9 |
| 9/7/09 | 4.6 |
| 9/7/09 | 3.8 |
| 9/7/09 | 3.1 |
| 9/7/09 | 3.8 |
| 9/7/09 | 3.8 |
| 9/7/09 | 4.2 |
| 9/7/09 | 5.1 |
| 9/7/09 | 5 |
| 9/7/09 | 4.5 |
| 9/7/09 | 5.7 |
| 9/7/09 | 4.8 |
| 9/7/09 | 4.2 |
| 9/7/09 | 4.7 |
| 9/7/09 | 5.5 |
| 9/7/09 | 6.5 |
| 9/7/09 | 4.5 |
| 9/7/09 | 5.7 |
| 9/7/09 | 6 |
| 9/6/09 | 4.7 |
| 9/6/09 | 5.3 |
| 9/6/09 | 3.5 |
| 9/6/09 | 6 |
| 9/6/09 | 4.2 |
| 9/6/09 | 5 |
| 9/6/09 | 2.6 |
| 9/6/09 | 4.9 |
| 9/6/09 | 5.5 |
| 9/6/09 | 4.9 |
| 9/6/09 | 4.5 |
| 9/6/09 | 5.7 |
| 9/6/09 | 3 |
| 9/6/09 | 6.7 |
| 9/6/09 | 6.8 |
| 9/6/09 | 6.4 |
| 9/6/09 | 5.5 |
| 9/6/09 | 5.2 |
| 9/6/09 | 7.1 |
| 9/6/09 | 6.1 |
| 9/6/09 | 5.6 |
| 9/6/09 | 5.5 |
| 9/6/09 | 6.3 |
| 9/6/09 | 5.7 |
| 9/6/09 | 5.3 |
| 9/6/09 | 4.5 |
| 9/6/09 | 6.7 |
| 9/6/09 | 5.5 |
| 9/6/09 | 4.1 |
| 9/6/09 | 3.8 |
| 9/6/09 | 4.3 |
| 9/6/09 | 4 |
| 9/6/09 | 3.7 |
| 9/6/09 | 4.6 |
| 9/6/09 | 3.5 |
| 9/6/09 | 2.9 |
| 9/6/09 | 4.6 |
| 9/6/09 | 4 |
| 9/6/09 | 5 |
| 9/6/09 | 4.4 |
| 9/6/09 | 3.5 |
| 9/6/09 | 3.1 |
| 9/6/09 | 3.7 |
| 9/6/09 | 2.8 |
| 9/6/09 | 2.7 |
| 9/6/09 | 3 |
| 9/6/09 | 4.5 |
| 9/6/09 | 2.1 |
| 9/5/09 | 3.6 |
| 9/5/09 | 2.8 |
| 9/5/09 | 2.5 |
| 9/5/09 | 3.8 |
| 9/5/09 | 4.4 |
| 9/5/09 | 3.5 |
| 9/5/09 | 4.8 |
| 9/5/09 | 8.4 |
| 9/5/09 | 7.9 |
| 9/5/09 | 4.5 |
| 9/5/09 | 3.3 |
| 9/5/09 | 6.4 |
| 9/5/09 | 4.3 |
| 9/5/09 | 5.9 |
| 9/5/09 | 5.3 |
| 9/5/09 | 3.5 |
| 9/5/09 | 2.5 |
| 9/5/09 | 2.4 |
| 9/5/09 | 3.7 |
| 9/5/09 | 4.2 |
| 9/5/09 | 3.1 |
| 9/5/09 | 3.2 |
| 9/5/09 | 2.8 |
| 9/5/09 | 4.5 |
| 9/5/09 | 3.1 |
| 9/5/09 | 2.7 |
| 9/5/09 | 3.2 |
| 9/5/09 | 5.3 |
| 9/5/09 | 3.1 |
| 9/5/09 | 2.9 |
| 9/5/09 | 3.5 |
| 9/5/09 | 4 |
| 9/5/09 | 4.5 |
| 9/5/09 | 3.8 |
| 9/5/09 | 4.5 |
| 9/5/09 | 4.3 |
| 9/5/09 | 3.1 |
| 9/5/09 | 3 |
| 9/5/09 | 4 |
| 9/5/09 | 2.8 |
| 9/5/09 | 4.1 |
| 9/5/09 | 5.8 |
| 9/5/09 | 3.5 |
| 9/5/09 | 3.4 |
| 9/5/09 | 3.9 |
| 9/5/09 | 3.1 |
| 9/5/09 | 3.5 |
| 9/5/09 | 3.8 |
| 9/4/09 | 5 |
| 9/4/09 | 2.4 |
| 9/4/09 | 4.2 |
| 9/4/09 | 3.8 |
| 9/4/09 | 3.2 |
| 9/4/09 | 3.4 |
| 9/4/09 | 4.8 |
| 9/4/09 | 4 |
| 9/4/09 | 5.8 |
| 9/4/09 | 2.8 |
| 9/4/09 | 2.6 |
| 9/4/09 | 3.3 |
| 9/4/09 | 1.8 |
| 9/4/09 | 2.8 |
| 9/4/09 | 4.7 |
| 9/4/09 | 4.2 |
| 9/4/09 | 3.9 |
| 9/4/09 | 3.8 |
| 9/4/09 | 3 |
| 9/4/09 | 4.5 |
| 9/4/09 | 3.8 |
| 9/4/09 | 3.1 |
| 9/4/09 | 2.7 |
| 9/4/09 | 2.9 |
| 9/4/09 | 2 |
| 9/4/09 | 2.5 |
| 9/4/09 | 4.3 |
| 9/4/09 | 2.9 |
| 9/4/09 | 3.6 |
| 9/4/09 | 4.3 |
| 9/4/09 | 3.8 |
| 9/4/09 | 3.8 |
| 9/4/09 | 3.3 |
| 9/4/09 | 4.1 |
| 9/4/09 | 4.3 |
| 9/4/09 | 5.3 |
| 9/4/09 | 4.2 |
| 9/4/09 | 5.3 |
| 9/4/09 | 4.6 |
| 9/4/09 | 4.2 |
| 9/4/09 | 7.2 |
| 9/4/09 | 4.8 |
| 9/4/09 | 2.4 |
| 9/4/09 | 3.9 |
| 9/4/09 | 5.3 |
| 9/4/09 | 3.4 |
| 9/4/09 | 3.7 |
| 9/4/09 | 4.6 |
| 9/3/09 | 4.6 |
| 9/3/09 | 3 |
| 9/3/09 | 5.2 |
| 9/3/09 | 4.6 |
| 9/3/09 | 6.4 |
| 9/3/09 | 7.1 |
| 9/3/09 | 9.4 |
| 9/3/09 | 7.5 |
| 9/3/09 | 3.3 |
| 9/3/09 | 6.9 |
| 9/3/09 | 4.4 |
| 9/3/09 | 5.9 |
| 9/3/09 | 4.9 |
| 9/3/09 | 3.7 |
| 9/3/09 | 4.5 |
| 9/3/09 | 4.8 |
| 9/3/09 | 5.7 |
| 9/3/09 | 5.8 |
| 9/3/09 | 6.1 |
| 9/3/09 | 5.8 |
| 9/3/09 | 5 |
| 9/3/09 | 6.5 |
| 9/3/09 | 6.7 |
| 9/3/09 | 8.7 |
| 9/3/09 | 6.6 |
| 9/3/09 | 4.4 |
| 9/3/09 | 5.5 |
| 9/3/09 | 4.8 |
| 9/3/09 | 3.5 |
| 9/3/09 | 5.2 |
| 9/3/09 | 5 |
| 9/3/09 | 5.8 |
| 9/3/09 | 6.1 |
| 9/3/09 | 6.1 |
| 9/3/09 | 5.3 |
| 9/3/09 | 6.8 |
| 9/3/09 | 5.5 |
| 9/3/09 | 4.4 |
| 9/3/09 | 4.8 |
| 9/3/09 | 5.2 |
| 9/3/09 | 4.9 |
| 9/3/09 | 3.7 |
| 9/3/09 | 4.1 |
| 9/3/09 | 5.3 |
| 9/3/09 | 5.1 |
| 9/3/09 | 4.2 |
| 9/3/09 | 3.5 |
| 9/3/09 | 4.6 |
| 9/2/09 | 3.5 |
| 9/2/09 | 8 |
| 9/2/09 | 4.9 |
| 9/2/09 | 4.8 |
| 9/2/09 | 5.2 |
| 9/2/09 | 5.8 |
| 9/2/09 | 5.9 |
| 9/2/09 | 6.4 |
| 9/2/09 | 6.1 |
| 9/2/09 | 3.8 |
| 9/2/09 | 3.9 |
| 9/2/09 | 4.7 |
| 9/2/09 | 4.9 |
| 9/2/09 | 6.1 |
| 9/2/09 | 5.7 |
| 9/2/09 | 6.8 |
| 9/2/09 | 7.7 |
| 9/2/09 | 7.5 |
| 9/2/09 | 7 |
| 9/2/09 | 6.4 |
| 9/2/09 | 7.1 |
| 9/2/09 | 7.1 |
| 9/2/09 | 9.6 |
| 9/2/09 | 6.6 |
| 9/2/09 | 5.9 |
| 9/2/09 | 5.2 |
| 9/2/09 | 4.7 |
| 9/2/09 | 5.7 |
| 9/2/09 | 4.9 |
| 9/2/09 | 4.8 |
| 9/2/09 | 6.7 |
| 9/2/09 | 6.3 |
| 9/2/09 | 5.6 |
| 9/2/09 | 5.9 |
| 9/2/09 | 5.2 |
| 9/2/09 | 4.6 |
| 9/2/09 | 4.8 |
| 9/2/09 | 4.1 |
| 9/2/09 | 5.4 |
| 9/2/09 | 5.2 |
| 9/2/09 | 5.3 |
| 9/2/09 | 4.4 |
| 9/2/09 | 6.3 |
| 9/2/09 | 5.8 |
| 9/2/09 | 4.8 |
| 9/2/09 | 4.7 |
| 9/2/09 | 4.6 |
| 9/2/09 | 4.6 |
| 9/1/09 | 4.9 |
| 9/1/09 | 4.8 |
| 9/1/09 | 3.9 |
| 9/1/09 | 7.2 |
| 9/1/09 | 5.7 |
| 9/1/09 | 6.8 |
| 9/1/09 | 6 |
| 9/1/09 | 5.9 |
| 9/1/09 | 7.8 |
| 9/1/09 | 5 |
| 9/1/09 | 6.5 |
| 9/1/09 | 5 |
| 9/1/09 | 5.8 |
| 9/1/09 | 6.6 |
| 9/1/09 | 7.1 |
| 9/1/09 | 6.4 |
| 9/1/09 | 5.7 |
| 9/1/09 | 6 |
| 9/1/09 | 6.1 |
| 9/1/09 | 6.9 |
| 9/1/09 | 7 |
| 9/1/09 | 6.8 |
| 9/1/09 | 7.1 |
| 9/1/09 | 7.2 |
| 9/1/09 | 7.7 |
| 9/1/09 | 7.7 |
| 9/1/09 | 7 |
| 9/1/09 | 6 |
| 9/1/09 | 5.2 |
| 9/1/09 | 6.5 |
| 9/1/09 | 7 |
| 9/1/09 | 7 |
| 9/1/09 | 6.6 |
| 9/1/09 | 7.4 |
| 9/1/09 | 6.5 |
| 9/1/09 | 6.5 |
| 9/1/09 | 5.3 |
| 9/1/09 | 6.1 |
| 9/1/09 | 5 |
| 9/1/09 | 6.3 |
| 9/1/09 | 5.5 |
| 9/1/09 | 4.8 |
| 9/1/09 | 5.1 |
| 9/1/09 | 6.3 |
| 9/1/09 | 5 |
| 9/1/09 | 5.1 |
| 9/1/09 | 4.4 |
| 9/1/09 | 7.2 |
| 8/31/09 | 5.1 |
| 8/31/09 | 4.7 |
| 8/31/09 | 4.5 |
| 8/31/09 | 6.4 |
| 8/31/09 | 6.1 |
| 8/31/09 | 6.2 |
| 8/31/09 | 4.7 |
| 8/31/09 | 6.4 |
| 8/31/09 | 6 |
| 8/31/09 | 8.1 |
| 8/31/09 | 5.9 |
| 8/31/09 | 6.8 |
| 8/31/09 | 5.5 |
| 8/31/09 | 6.7 |
| 8/31/09 | 6.9 |
| 8/31/09 | 7.4 |
| 8/31/09 | 7.6 |
| 8/31/09 | 6 |
| 8/31/09 | 7.2 |
| 8/31/09 | 6.6 |
| 8/31/09 | 7.7 |
| 8/31/09 | 8.7 |
| 8/31/09 | 6 |
| 8/31/09 | 7.1 |
| 8/31/09 | 7.4 |
| 8/31/09 | 7.6 |
| 8/31/09 | 6.7 |
| 8/31/09 | 7.3 |
| 8/31/09 | 6.3 |
| 8/31/09 | 6.6 |
| 8/31/09 | 4.9 |
| 8/31/09 | 6.6 |
| 8/31/09 | 7.9 |
| 8/31/09 | 6.6 |
| 8/31/09 | 5.2 |
| 8/31/09 | 5.9 |
| 8/31/09 | 6.3 |
| 8/31/09 | 7.5 |
| 8/31/09 | 6 |
| 8/31/09 | 6.5 |
| 8/31/09 | 6.3 |
| 8/31/09 | 4.7 |
| 8/31/09 | 6.6 |
| 8/31/09 | 5.9 |
| 8/31/09 | 6.6 |
| 8/31/09 | 6.2 |
| 8/31/09 | 6.1 |
| 8/31/09 | 5.4 |
| 8/30/09 | 5.6 |
| 8/30/09 | 5.5 |
| 8/30/09 | 7.2 |
| 8/30/09 | 6 |
| 8/30/09 | 5.8 |
| 8/30/09 | 6.7 |
| 8/30/09 | 6.3 |
| 8/30/09 | 7.6 |
| 8/30/09 | 8.1 |
| 8/30/09 | 7.3 |
| 8/30/09 | 7.7 |
| 8/30/09 | 7.8 |
| 8/30/09 | 8.4 |
| 8/30/09 | 8.2 |
| 8/30/09 | 8.7 |
| 8/30/09 | 8.4 |
| 8/30/09 | 8.5 |
| 8/30/09 | 7.5 |
| 8/30/09 | 9.5 |
| 8/30/09 | 8.5 |
| 8/30/09 | 7.4 |
| 8/30/09 | 8.5 |
| 8/30/09 | 8.2 |
| 8/30/09 | 7.4 |
| 8/30/09 | 7.3 |
| 8/30/09 | 7.2 |
| 8/30/09 | 7 |
| 8/30/09 | 7.2 |
| 8/30/09 | 6.7 |
| 8/30/09 | 6.8 |
| 8/30/09 | 7.5 |
| 8/30/09 | 6.8 |
| 8/30/09 | 6.6 |
| 8/30/09 | 6.5 |
| 8/30/09 | 6.5 |
| 8/30/09 | 4.8 |
| 8/30/09 | 6.1 |
| 8/30/09 | 6.7 |
| 8/30/09 | 5.4 |
| 8/30/09 | 6.4 |
| 8/30/09 | 5.4 |
| 8/30/09 | 4.9 |
| 8/30/09 | 4.6 |
| 8/30/09 | 5.3 |
| 8/30/09 | 5 |
| 8/30/09 | 5.5 |
| 8/30/09 | 5.9 |
| 8/30/09 | 4.7 |
| 8/29/09 | 5.2 |
| 8/29/09 | 5.3 |
| 8/29/09 | 5.3 |
| 8/29/09 | 5.2 |
| 8/29/09 | 5.9 |
| 8/29/09 | 3.7 |
| 8/29/09 | 4.7 |
| 8/29/09 | 4.7 |
| 8/29/09 | 6 |
| 8/29/09 | 6.1 |
| 8/29/09 | 4.5 |
| 8/29/09 | 8.2 |
| 8/29/09 | 8.1 |
| 8/29/09 | 7.4 |
| 8/29/09 | 9.6 |
| 8/29/09 | 7.9 |
| 8/29/09 | 9.3 |
| 8/29/09 | 10.6 |
| 8/29/09 | 7.9 |
| 8/29/09 | 8.7 |
| 8/29/09 | 9.2 |
| 8/29/09 | 8.2 |
| 8/29/09 | 6.6 |
| 8/29/09 | 6.8 |
| 8/29/09 | 6.7 |
| 8/29/09 | 7.4 |
| 8/29/09 | 7 |
| 8/29/09 | 7 |
| 8/29/09 | 5 |
| 8/29/09 | 6 |
| 8/29/09 | 5.6 |
| 8/29/09 | 6.6 |
| 8/29/09 | 5 |
| 8/29/09 | 4.2 |
| 8/29/09 | 6.8 |
| 8/29/09 | 6.7 |
| 8/29/09 | 5 |
| 8/29/09 | 4.4 |
| 8/29/09 | 5.9 |
| 8/29/09 | 4.8 |
| 8/29/09 | 6.3 |
| 8/29/09 | 4.9 |
| 8/29/09 | 6.5 |
| 8/29/09 | 4.8 |
| 8/29/09 | 5.8 |
| 8/29/09 | 5.6 |
| 8/29/09 | 6.3 |
| 8/29/09 | 5.1 |
| 8/28/09 | 4.9 |
| 8/28/09 | 6.9 |
| 8/28/09 | 4.2 |
| 8/28/09 | 5.3 |
| 8/28/09 | 6.2 |
| 8/28/09 | 6.3 |
| 8/28/09 | 4.4 |
| 8/28/09 | 5.2 |
| 8/28/09 | 5.5 |
| 8/28/09 | 7.3 |
| 8/28/09 | 4.1 |
| 8/28/09 | 5.3 |
| 8/28/09 | 6.2 |
| 8/28/09 | 7.7 |
| 8/28/09 | 5.8 |
| 8/28/09 | 6.1 |
| 8/28/09 | 5.9 |
| 8/28/09 | 7.9 |
| 8/28/09 | 5.2 |
| 8/28/09 | 6.1 |
| 8/28/09 | 7.6 |
| 8/28/09 | 7.8 |
| 8/28/09 | 8.7 |
| 8/28/09 | 4.9 |
| 8/28/09 | 6.3 |
| 8/28/09 | 5.4 |
| 8/28/09 | 5.2 |
| 8/28/09 | 5 |
| 8/28/09 | 5.9 |
| 8/28/09 | 6.6 |
| 8/28/09 | 8 |
| 8/28/09 | 6.4 |
| 8/28/09 | 6.8 |
| 8/28/09 | 8.1 |
| 8/28/09 | 7.5 |
| 8/28/09 | 7.1 |
| 8/28/09 | 6.8 |
| 8/28/09 | 5.3 |
| 8/28/09 | 5.9 |
| 8/28/09 | 6.4 |
| 8/28/09 | 6 |
| 8/28/09 | 6.7 |
| 8/28/09 | 6.5 |
| 8/28/09 | 6.4 |
| 8/28/09 | 5.2 |
| 8/28/09 | 3.3 |
| 8/28/09 | 3.7 |
| 8/28/09 | 5.6 |
| 8/27/09 | 6.1 |
| 8/27/09 | 4.4 |
| 8/27/09 | 5.6 |
| 8/27/09 | 7.4 |
| 8/27/09 | 6.5 |
| 8/27/09 | 9.5 |
| 8/27/09 | 7.9 |
| 8/27/09 | 6.8 |
| 8/27/09 | 6.8 |
| 8/27/09 | 6.4 |
| 8/27/09 | 7.1 |
| 8/27/09 | 5.8 |
| 8/27/09 | 8.7 |
| 8/27/09 | 7.4 |
| 8/27/09 | 6.4 |
| 8/27/09 | 7.6 |
| 8/27/09 | 9.5 |
| 8/27/09 | 9.4 |
| 8/27/09 | 8.9 |
| 8/27/09 | 8.4 |
| 8/27/09 | 9.7 |
| 8/27/09 | 7.8 |
| 8/27/09 | 6.3 |
| 8/27/09 | 6.5 |
| 8/27/09 | 6.9 |
| 8/27/09 | 5.8 |
| 8/27/09 | 5.8 |
| 8/27/09 | 6.2 |
| 8/27/09 | 5.2 |
| 8/27/09 | 4.7 |
| 8/27/09 | 5.9 |
| 8/27/09 | 4.9 |
| 8/27/09 | 5.8 |
| 8/27/09 | 5 |
| 8/27/09 | 6.9 |
| 8/27/09 | 6 |
| 8/27/09 | 5.8 |
| 8/27/09 | 7.6 |
| 8/27/09 | 7.4 |
| 8/27/09 | 8.3 |
| 8/27/09 | 5.4 |
| 8/27/09 | 5.3 |
| 8/27/09 | 6.2 |
| 8/27/09 | 6.2 |
| 8/27/09 | 4.6 |
| 8/27/09 | 5.9 |
| 8/27/09 | 7.2 |
| 8/27/09 | 8.4 |
| 8/26/09 | 5.1 |
| 8/26/09 | 6 |
| 8/26/09 | 7.1 |
| 8/26/09 | 6.8 |
| 8/26/09 | 5.5 |
| 8/26/09 | 9.2 |
| 8/26/09 | 6.7 |
| 8/26/09 | 7.3 |
| 8/26/09 | 7 |
| 8/26/09 | 8.9 |
| 8/26/09 | 9.3 |
| 8/26/09 | 8.7 |
| 8/26/09 | 8.2 |
| 8/26/09 | 7.7 |
| 8/26/09 | 8.8 |
| 8/26/09 | 9.1 |
| 8/26/09 | 7.7 |
| 8/26/09 | 9.6 |
| 8/26/09 | 8.8 |
| 8/26/09 | 9.9 |
| 8/26/09 | 10.3 |
| 8/26/09 | 10.3 |
| 8/26/09 | 10.2 |
| 8/26/09 | 9.2 |
| 8/26/09 | 9.3 |
| 8/26/09 | 6 |
| 8/26/09 | 6 |
| 8/26/09 | 4.5 |
| 8/26/09 | 5.6 |
| 8/26/09 | 5.2 |
| 8/26/09 | 5.7 |
| 8/26/09 | 6.8 |
| 8/26/09 | 6.7 |
| 8/26/09 | 7.4 |
| 8/26/09 | 6.5 |
| 8/26/09 | 6.6 |
| 8/26/09 | 6.3 |
| 8/26/09 | 6.9 |
| 8/26/09 | 7.4 |
| 8/26/09 | 7.1 |
| 8/26/09 | 7.9 |
| 8/26/09 | 9 |
| 8/26/09 | 6.9 |
| 8/26/09 | 7.2 |
| 8/26/09 | 4.8 |
| 8/26/09 | 5.7 |
| 8/26/09 | 5 |
| 8/26/09 | 5.2 |
| 8/25/09 | 4.9 |
| 8/25/09 | 6.7 |
| 8/25/09 | 6.8 |
| 8/25/09 | 7.4 |
| 8/25/09 | 5.8 |
| 8/25/09 | 6.9 |
| 8/25/09 | 7.5 |
| 8/25/09 | 6.9 |
| 8/25/09 | 5.8 |
| 8/25/09 | 7.9 |
| 8/25/09 | 7.6 |
| 8/25/09 | 6.9 |
| 8/25/09 | 10.2 |
| 8/25/09 | 8.9 |
| 8/25/09 | 6.5 |
| 8/25/09 | 7.1 |
| 8/25/09 | 7.2 |
| 8/25/09 | 7.9 |
| 8/25/09 | 6.9 |
| 8/25/09 | 7.8 |
| 8/25/09 | 7.7 |
| 8/25/09 | 6.8 |
| 8/25/09 | 4.6 |
| 8/25/09 | 6.3 |
| 8/25/09 | 5.4 |
| 8/25/09 | 4.2 |
| 8/25/09 | 5.6 |
| 8/25/09 | 3.8 |
| 8/25/09 | 5.7 |
| 8/25/09 | 7.1 |
| 8/25/09 | 6.9 |
| 8/25/09 | 8.4 |
| 8/25/09 | 7.6 |
| 8/25/09 | 6.8 |
| 8/25/09 | 7.2 |
| 8/25/09 | 6.2 |
| 8/25/09 | 7 |
| 8/25/09 | 7.2 |
| 8/25/09 | 6.9 |
| 8/25/09 | 6.2 |
| 8/25/09 | 8.1 |
| 8/25/09 | 7.1 |
| 8/25/09 | 6.6 |
| 8/25/09 | 8.3 |
| 8/25/09 | 8.9 |
| 8/25/09 | 4.3 |
| 8/25/09 | 6.1 |
| 8/25/09 | 6.1 |
| 8/24/09 | 7.6 |
| 8/24/09 | 7.3 |
| 8/24/09 | 8 |
| 8/24/09 | 6.9 |
| 8/24/09 | 6.2 |
| 8/24/09 | 8.2 |
| 8/24/09 | 6.9 |
| 8/24/09 | 10 |
| 8/24/09 | 6.5 |
| 8/24/09 | 6.2 |
| 8/24/09 | 8.1 |
| 8/24/09 | 8.7 |
| 8/24/09 | 6.9 |
| 8/24/09 | 6.4 |
| 8/24/09 | 9.2 |
| 8/24/09 | 7.3 |
| 8/24/09 | 6.4 |
| 8/24/09 | 7.8 |
| 8/24/09 | 5.4 |
| 8/24/09 | 7.9 |
| 8/24/09 | 6.7 |
| 8/24/09 | 6.2 |
| 8/24/09 | 9.4 |
| 8/24/09 | 8.7 |
| 8/24/09 | 7.1 |
| 8/24/09 | 8.5 |
| 8/24/09 | 6.8 |
| 8/24/09 | 7.2 |
| 8/24/09 | 8.1 |
| 8/24/09 | 8.1 |
| 8/24/09 | 9.5 |
| 8/24/09 | 8.6 |
| 8/24/09 | 7.9 |
| 8/24/09 | 9.3 |
| 8/24/09 | 9.3 |
| 8/24/09 | 8.7 |
| 8/24/09 | 9.7 |
| 8/24/09 | 10.3 |
| 8/24/09 | 9.1 |
| 8/24/09 | 9.4 |
| 8/24/09 | 9.5 |
| 8/24/09 | 10.9 |
| 8/24/09 | 10.8 |
| 8/24/09 | 10.6 |
| 8/24/09 | 11.3 |
| 8/24/09 | 11.3 |
| 8/24/09 | 11.2 |
| 8/24/09 | 11.1 |
| 8/23/09 | 12.4 |
| 8/23/09 | 14.3 |
| 8/23/09 | 12.5 |
| 8/23/09 | 12.2 |
| 8/23/09 | 10.4 |
| 8/23/09 | 10.1 |
| 8/23/09 | 11.8 |
| 8/23/09 | 11.5 |
| 8/23/09 | 12.8 |
| 8/23/09 | 12 |
| 8/23/09 | 11.9 |
| 8/23/09 | 11 |
| 8/23/09 | 11.8 |
| 8/23/09 | 9.9 |
| 8/23/09 | 10.5 |
| 8/23/09 | 11.4 |
| 8/23/09 | 10.5 |
| 8/23/09 | 11.7 |
| 8/23/09 | 11.7 |
| 8/23/09 | 10.7 |
| 8/23/09 | 12.2 |
| 8/23/09 | 11.1 |
| 8/23/09 | 10.4 |
| 8/23/09 | 10.3 |
| 8/23/09 | 9.9 |
| 8/23/09 | 9.8 |
| 8/23/09 | 10.7 |
| 8/23/09 | 9.8 |
| 8/23/09 | 11.1 |
| 8/23/09 | 9.9 |
| 8/23/09 | 12.2 |
| 8/23/09 | 12.1 |
| 8/23/09 | 12.2 |
| 8/23/09 | 12.1 |
| 8/23/09 | 12.2 |
| 8/23/09 | 12.5 |
| 8/23/09 | 11.2 |
| 8/23/09 | 12.8 |
| 8/23/09 | 13 |
| 8/23/09 | 12.6 |
| 8/23/09 | 13.1 |
| 8/23/09 | 11.6 |
| 8/23/09 | 11.7 |
| 8/23/09 | 11.7 |
| 8/23/09 | 11.5 |
| 8/23/09 | 11.5 |
| 8/23/09 | 12.1 |
| 8/23/09 | 6.3 |
| 8/22/09 | 12.6 |
| 8/22/09 | 10.9 |
| 8/22/09 | 9.7 |
| 8/22/09 | 9.2 |
| 8/22/09 | 9.7 |
| 8/22/09 | 10.4 |
| 8/22/09 | 11.9 |
| 8/22/09 | 10.6 |
| 8/22/09 | 11.5 |
| 8/22/09 | 11.6 |
| 8/22/09 | 13.4 |
| 8/22/09 | 11.1 |
| 8/22/09 | 7.8 |
| 8/22/09 | 9.4 |
| 8/22/09 | 12 |
| 8/22/09 | 7.7 |
| 8/22/09 | 9.2 |
| 8/22/09 | 10.2 |
| 8/22/09 | 8 |
| 8/22/09 | 9 |
| 8/22/09 | 9.1 |
| 8/22/09 | 7.9 |
| 8/22/09 | 8.9 |
| 8/22/09 | 9.3 |
| 8/22/09 | 7.9 |
| 8/22/09 | 6.1 |
| 8/22/09 | 6.6 |
| 8/22/09 | 8.6 |
| 8/22/09 | 6.8 |
| 8/22/09 | 7.7 |
| 8/22/09 | 8.7 |
| 8/22/09 | 10.3 |
| 8/22/09 | 9.1 |
| 8/22/09 | 9.3 |
| 8/22/09 | 9.2 |
| 8/22/09 | 12.8 |
| 8/22/09 | 3.7 |
| 8/22/09 | 10.4 |
| 8/22/09 | 6.7 |
| 8/22/09 | 4.9 |
| 8/22/09 | 6.1 |
| 8/22/09 | 6.4 |
| 8/22/09 | 4.1 |
| 8/22/09 | 5.5 |
| 8/22/09 | 4.6 |
| 8/22/09 | 7 |
| 8/22/09 | 9.3 |
| 8/22/09 | 10.2 |
| 8/21/09 | 8.4 |
| 8/21/09 | 8.8 |
| 8/21/09 | 11.2 |
| 8/21/09 | 8.8 |
| 8/21/09 | 9.8 |
| 8/21/09 | 8.8 |
| 8/21/09 | 9.2 |
| 8/21/09 | 10.7 |
| 8/21/09 | 8.2 |
| 8/21/09 | 8.7 |
| 8/21/09 | 7.4 |
| 8/21/09 | 9.4 |
| 8/21/09 | 11.8 |
| 8/21/09 | 9.6 |
| 8/21/09 | 11 |
| 8/21/09 | 12.2 |
| 8/21/09 | 10.2 |
| 8/21/09 | 10.8 |
| 8/21/09 | 10.7 |
| 8/21/09 | 11.3 |
| 8/21/09 | 8.5 |
| 8/21/09 | 10.8 |
| 8/21/09 | 7.7 |
| 8/21/09 | 7.6 |
| 8/21/09 | 6.6 |
| 8/21/09 | 9 |
| 8/21/09 | 6.6 |
| 8/21/09 | 5.2 |
| 8/21/09 | 7.3 |
| 8/21/09 | 8.5 |
| 8/21/09 | 6.9 |
| 8/21/09 | 6.3 |
| 8/21/09 | 6.3 |
| 8/21/09 | 6.2 |
| 8/21/09 | 5.5 |
| 8/21/09 | 6.6 |
| 8/21/09 | 5.1 |
| 8/21/09 | 6.8 |
| 8/21/09 | 6.5 |
| 8/21/09 | 6.4 |
| 8/21/09 | 6.6 |
| 8/21/09 | 7.2 |
| 8/21/09 | 6.6 |
| 8/21/09 | 7.1 |
| 8/21/09 | 6.1 |
| 8/21/09 | 6.8 |
| 8/21/09 | 6.3 |
| 8/21/09 | 6.2 |
| 8/20/09 | 6.8 |
| 8/20/09 | 5.4 |
| 8/20/09 | 8.2 |
| 8/20/09 | 6.9 |
| 8/20/09 | 7.1 |
| 8/20/09 | 5.3 |
| 8/20/09 | 6.1 |
| 8/20/09 | 7.4 |
| 8/20/09 | 6.3 |
| 8/20/09 | 4.9 |
| 8/20/09 | 4.7 |
| 8/20/09 | 4.3 |
| 8/20/09 | 8 |
| 8/20/09 | 6.3 |
| 8/20/09 | 7.1 |
| 8/20/09 | 5.5 |
| 8/20/09 | 8.2 |
| 8/20/09 | 8.2 |
| 8/20/09 | 7.6 |
| 8/20/09 | 7.6 |
| 8/20/09 | 5.1 |
| 8/20/09 | 5.4 |
| 8/20/09 | 7.9 |
| 8/20/09 | 2.8 |
| 8/20/09 | 4.8 |
| 8/20/09 | 3.4 |
| 8/20/09 | 3.1 |
| 8/20/09 | 4.7 |
| 8/20/09 | 5.7 |
| 8/20/09 | 4 |
| 8/20/09 | 3.6 |
| 8/20/09 | 3.8 |
| 8/20/09 | 5 |
| 8/20/09 | 4.9 |
| 8/20/09 | 3.9 |
| 8/20/09 | 4.7 |
| 8/20/09 | 4.8 |
| 8/20/09 | 4.9 |
| 8/20/09 | 5 |
| 8/20/09 | 4.3 |
| 8/20/09 | 4.6 |
| 8/20/09 | 7.5 |
| 8/20/09 | 5.3 |
| 8/20/09 | 5.5 |
| 8/20/09 | 4.6 |
| 8/20/09 | 6.3 |
| 8/20/09 | 3.9 |
| 8/20/09 | 3.5 |
| 8/19/09 | 4.2 |
| 8/19/09 | 4 |
| 8/19/09 | 3.5 |
| 8/19/09 | 4.4 |
| 8/19/09 | 3.6 |
| 8/19/09 | 3.1 |
| 8/19/09 | 3 |
| 8/19/09 | 6.7 |
| 8/19/09 | 4.6 |
| 8/19/09 | 3.3 |
| 8/19/09 | 6 |
| 8/19/09 | 3.3 |
| 8/19/09 | 4.4 |
| 8/19/09 | 4.1 |
| 8/19/09 | 4.7 |
| 8/19/09 | 4.7 |
| 8/19/09 | 3.9 |
| 8/19/09 | 3.9 |
| 8/19/09 | 4.9 |
| 8/19/09 | 5.9 |
| 8/19/09 | 3.4 |
| 8/19/09 | 2.9 |
| 8/19/09 | 3.7 |
| 8/19/09 | 2.3 |
| 8/19/09 | 2.9 |
| 8/19/09 | 3.2 |
| 8/19/09 | 4.3 |
| 8/19/09 | 3.7 |
| 8/19/09 | 3.2 |
| 8/19/09 | 3 |
| 8/19/09 | 3 |
| 8/19/09 | 2.6 |
| 8/19/09 | 4.2 |
| 8/19/09 | 3.5 |
| 8/19/09 | 2.6 |
| 8/19/09 | 3.6 |
| 8/19/09 | 3 |
| 8/19/09 | 3.9 |
| 8/19/09 | 3.8 |
| 8/19/09 | 2.1 |
| 8/19/09 | 3.1 |
| 8/19/09 | 2.8 |
| 8/19/09 | 4 |
| 8/19/09 | 2.6 |
| 8/19/09 | 3.2 |
| 8/19/09 | 2.7 |
| 8/19/09 | 3.3 |
| 8/19/09 | 2.3 |
| 8/18/09 | 1.7 |
| 8/18/09 | 3.8 |
| 8/18/09 | 2.5 |
| 8/18/09 | 3 |
| 8/18/09 | 4.3 |
| 8/18/09 | 4.5 |
| 8/18/09 | 5.9 |
| 8/18/09 | 5.2 |
| 8/18/09 | 4.8 |
| 8/18/09 | 5.6 |
| 8/18/09 | 5.3 |
| 8/18/09 | 6 |
| 8/18/09 | 6.4 |
| 8/18/09 | 6.5 |
| 8/18/09 | 6.8 |
| 8/18/09 | 3.8 |
| 8/18/09 | 6.6 |
| 8/18/09 | 5.1 |
| 8/18/09 | 7.1 |
| 8/18/09 | 5.9 |
| 8/18/09 | 7 |
| 8/18/09 | 5.6 |
| 8/18/09 | 4.9 |
| 8/18/09 | 3.8 |
| 8/18/09 | 3.9 |
| 8/18/09 | 5.6 |
| 8/18/09 | 2.8 |
| 8/18/09 | 2.2 |
| 8/18/09 | 1.8 |
| 8/18/09 | 3.1 |
| 8/18/09 | 3.9 |
| 8/18/09 | 2.7 |
| 8/18/09 | 3.7 |
| 8/18/09 | 4 |
| 8/18/09 | 2.9 |
| 8/18/09 | 2.6 |
| 8/18/09 | 1.5 |
| 8/18/09 | 3 |
| 8/18/09 | 2.6 |
| 8/18/09 | 3.9 |
| 8/18/09 | 2.4 |
| 8/18/09 | 3.8 |
| 8/18/09 | 3.6 |
| 8/18/09 | 4 |
| 8/18/09 | 3 |
| 8/18/09 | 4 |
| 8/18/09 | 2.8 |
| 8/18/09 | 3 |
| 8/17/09 | 3.9 |
| 8/17/09 | 3.9 |
| 8/17/09 | 3.8 |
| 8/17/09 | 2.7 |
| 8/17/09 | 5.6 |
| 8/17/09 | 5 |
| 8/17/09 | 4.2 |
| 8/17/09 | 4.9 |
| 8/17/09 | 4.6 |
| 8/17/09 | 6.1 |
| 8/17/09 | 8 |
| 8/17/09 | 3.5 |
| 8/17/09 | 3 |
| 8/17/09 | 3.4 |
| 8/17/09 | 4 |
| 8/17/09 | 3.9 |
| 8/17/09 | 2 |
| 8/17/09 | 2.9 |
| 8/17/09 | 2.4 |
| 8/17/09 | 3 |
| 8/17/09 | 2.8 |
| 8/17/09 | 2.3 |
| 8/17/09 | 1.8 |
| 8/17/09 | 1.7 |
| 8/17/09 | 1.8 |
| 8/17/09 | 3.2 |
| 8/17/09 | 1.6 |
| 8/17/09 | 2.4 |
| 8/17/09 | 2.2 |
| 8/17/09 | 2.6 |
| 8/17/09 | 3.4 |
| 8/17/09 | 3.1 |
| 8/17/09 | 2.5 |
| 8/17/09 | 2.7 |
| 8/17/09 | 3.8 |
| 8/17/09 | 3.3 |
| 8/17/09 | 3.5 |
| 8/17/09 | 1.6 |
| 8/17/09 | 2.7 |
| 8/17/09 | 2.9 |
| 8/17/09 | 3.3 |
| 8/17/09 | 2.7 |
| 8/17/09 | 2.7 |
| 8/17/09 | 4.2 |
| 8/17/09 | 4.5 |
| 8/17/09 | 4.3 |
| 8/17/09 | 5.9 |
| 8/17/09 | 4 |
| 8/16/09 | 3.9 |
| 8/16/09 | 4.4 |
| 8/16/09 | 3.5 |
| 8/16/09 | 4.8 |
| 8/16/09 | 3.9 |
| 8/16/09 | 6.4 |
| 8/16/09 | 4.4 |
| 8/16/09 | 3.8 |
| 8/16/09 | 4.8 |
| 8/16/09 | 3.2 |
| 8/16/09 | 3.4 |
| 8/16/09 | 3.4 |
| 8/16/09 | 5.4 |
| 8/16/09 | 3.7 |
| 8/16/09 | 6.4 |
| 8/16/09 | 2.5 |
| 8/16/09 | 2.4 |
| 8/16/09 | 3.1 |
| 8/16/09 | 4.3 |
| 8/16/09 | 2.7 |
| 8/16/09 | 3.9 |
| 8/16/09 | 3.9 |
| 8/16/09 | 2.5 |
| 8/16/09 | 2 |
| 8/16/09 | 2.1 |
| 8/16/09 | 5.1 |
| 8/16/09 | 2.5 |
| 8/16/09 | 2.2 |
| 8/16/09 | 3.3 |
| 8/16/09 | 2.7 |
| 8/16/09 | 4 |
| 8/16/09 | 3.4 |
| 8/16/09 | 3.6 |
| 8/16/09 | 4.9 |
| 8/16/09 | 4 |
| 8/16/09 | 3.5 |
| 8/16/09 | 3.4 |
| 8/16/09 | 5.8 |
| 8/16/09 | 6.1 |
| 8/16/09 | 6.6 |
| 8/16/09 | 5.1 |
| 8/16/09 | 6.4 |
| 8/16/09 | 5.3 |
| 8/16/09 | 7.2 |
| 8/16/09 | 7.3 |
| 8/16/09 | 6.7 |
| 8/16/09 | 6.7 |
| 8/16/09 | 6.5 |
| 8/15/09 | 5.1 |
| 8/15/09 | 6.5 |
| 8/15/09 | 6.9 |
| 8/15/09 | 7.2 |
| 8/15/09 | 7.3 |
| 8/15/09 | 7 |
| 8/15/09 | 7.8 |
| 8/15/09 | 7.1 |
| 8/15/09 | 6.5 |
| 8/15/09 | 8 |
| 8/15/09 | 4.7 |
| 8/15/09 | 3.1 |
| 8/15/09 | 5.2 |
| 8/15/09 | 5 |
| 8/15/09 | 4 |
| 8/15/09 | 5.8 |
| 8/15/09 | 5.5 |
| 8/15/09 | 5.1 |
| 8/15/09 | 6.4 |
| 8/15/09 | 5.6 |
| 8/15/09 | 5.1 |
| 8/15/09 | 6.1 |
| 8/15/09 | 5.1 |
| 8/15/09 | 6.3 |
| 8/15/09 | 5.2 |
| 8/15/09 | 5.9 |
| 8/15/09 | 5 |
| 8/15/09 | 3 |
| 8/15/09 | 4 |
| 8/15/09 | 3 |
| 8/15/09 | 3.6 |
| 8/15/09 | 5.3 |
| 8/15/09 | 5.4 |
| 8/15/09 | 5.1 |
| 8/15/09 | 5.2 |
| 8/15/09 | 5.5 |
| 8/15/09 | 4.9 |
| 8/15/09 | 5.6 |
| 8/15/09 | 5 |
| 8/15/09 | 6.2 |
| 8/15/09 | 5 |
| 8/15/09 | 6.2 |
| 8/15/09 | 6.2 |
| 8/15/09 | 6.1 |
| 8/15/09 | 6.8 |
| 8/15/09 | 7.8 |
| 8/15/09 | 7.7 |
| 8/15/09 | 6.5 |
| 8/14/09 | 6.5 |
| 8/14/09 | 4.3 |
| 8/14/09 | 5.9 |
| 8/14/09 | 7.6 |
| 8/14/09 | 7.8 |
| 8/14/09 | 8 |
| 8/14/09 | 6.6 |
| 8/14/09 | 4.3 |
| 8/14/09 | 3.5 |
| 8/14/09 | 4.4 |
| 8/14/09 | 2.9 |
| 8/14/09 | 4.8 |
| 8/14/09 | 5 |
| 8/14/09 | 5.4 |
| 8/14/09 | 4.8 |
| 8/14/09 | 3.5 |
| 8/14/09 | 4.2 |
| 8/14/09 | 6 |
| 8/14/09 | 5.4 |
| 8/14/09 | 4.3 |
| 8/14/09 | 4.4 |
| 8/14/09 | 6 |
| 8/14/09 | 2.9 |
| 8/14/09 | 5.2 |
| 8/14/09 | 6.7 |
| 8/14/09 | 2.7 |
| 8/14/09 | 4.4 |
| 8/14/09 | 3.9 |
| 8/14/09 | 3 |
| 8/14/09 | 4 |
| 8/14/09 | 4.5 |
| 8/14/09 | 6 |
| 8/14/09 | 5.2 |
| 8/14/09 | 5.8 |
| 8/14/09 | 6.5 |
| 8/14/09 | 5.6 |
| 8/14/09 | 5.5 |
| 8/14/09 | 5.8 |
| 8/14/09 | 5.4 |
| 8/14/09 | 5.6 |
| 8/14/09 | 5.2 |
| 8/14/09 | 5.9 |
| 8/14/09 | 7.2 |
| 8/14/09 | 7.1 |
| 8/14/09 | 7 |
| 8/14/09 | 6.8 |
| 8/14/09 | 5.7 |
| 8/14/09 | 6.1 |
| 8/13/09 | 7.6 |
| 8/13/09 | 8.7 |
| 8/13/09 | 6.4 |
| 8/13/09 | 7.9 |
| 8/13/09 | 6.2 |
| 8/13/09 | 6.1 |
| 8/13/09 | 6.6 |
| 8/13/09 | 9.3 |
| 8/13/09 | 4.4 |
| 8/13/09 | 7.2 |
| 8/13/09 | 8.9 |
| 8/13/09 | 10.1 |
| 8/13/09 | 10.5 |
| 8/13/09 | 8.1 |
| 8/13/09 | 9.5 |
| 8/13/09 | 7.8 |
| 8/13/09 | 6 |
| 8/13/09 | 6.6 |
| 8/13/09 | 7.2 |
| 8/13/09 | 6.6 |
| 8/13/09 | 6.7 |
| 8/13/09 | 6 |
| 8/13/09 | 6.7 |
| 8/13/09 | 7.7 |
| 8/13/09 | 7.2 |
| 8/13/09 | 9.2 |
| 8/13/09 | 10.3 |
| 8/13/09 | 3.5 |
| 8/13/09 | 5.2 |
| 8/13/09 | 6.7 |
| 8/13/09 | 5.7 |
| 8/13/09 | 6.8 |
| 8/13/09 | 6.1 |
| 8/13/09 | 5.8 |
| 8/13/09 | 4.6 |
| 8/13/09 | 5.4 |
| 8/13/09 | 4.9 |
| 8/13/09 | 6 |
| 8/13/09 | 5 |
| 8/13/09 | 6 |
| 8/13/09 | 4.4 |
| 8/13/09 | 4.5 |
| 8/13/09 | 5.9 |
| 8/13/09 | 4.8 |
| 8/13/09 | 5.4 |
| 8/13/09 | 4.2 |
| 8/13/09 | 6 |
| 8/13/09 | 5.3 |
| 8/12/09 | 5.1 |
| 8/12/09 | 6 |
| 8/12/09 | 4.4 |
| 8/12/09 | 4.6 |
| 8/12/09 | 6.5 |
| 8/12/09 | 6.1 |
| 8/12/09 | 7.5 |
| 8/12/09 | 6.7 |
| 8/12/09 | 6.4 |
| 8/12/09 | 8 |
| 8/12/09 | 8.4 |
| 8/12/09 | 6.5 |
| 8/12/09 | 5.3 |
| 8/12/09 | 4.2 |
| 8/12/09 | 7.4 |
| 8/12/09 | 7.6 |
| 8/12/09 | 8.2 |
| 8/12/09 | 9.4 |
| 8/12/09 | 7.2 |
| 8/12/09 | 6.2 |
| 8/12/09 | 6.9 |
| 8/12/09 | 4.2 |
| 8/12/09 | 4.1 |
| 8/12/09 | 5.3 |
| 8/12/09 | 5 |
| 8/12/09 | 5.1 |
| 8/12/09 | 6.1 |
| 8/12/09 | 4.6 |
| 8/12/09 | 5.8 |
| 8/12/09 | 5.6 |
| 8/12/09 | 4.9 |
| 8/12/09 | 6.7 |
| 8/12/09 | 4.4 |
| 8/12/09 | 4.8 |
| 8/12/09 | 4.8 |
| 8/12/09 | 5 |
| 8/12/09 | 5 |
| 8/12/09 | 6.3 |
| 8/12/09 | 3.9 |
| 8/12/09 | 4.5 |
| 8/12/09 | 7 |
| 8/12/09 | 6.5 |
| 8/12/09 | 7.4 |
| 8/12/09 | 5.6 |
| 8/12/09 | 5.6 |
| 8/12/09 | 4.4 |
| 8/12/09 | 5.8 |
| 8/12/09 | 4.5 |
| 8/11/09 | 4.8 |
| 8/11/09 | 4.8 |
| 8/11/09 | 6.3 |
| 8/11/09 | 5.7 |
| 8/11/09 | 7.2 |
| 8/11/09 | 5.6 |
| 8/11/09 | 7.6 |
| 8/11/09 | 6.9 |
| 8/11/09 | 7.5 |
| 8/11/09 | 7.5 |
| 8/11/09 | 7.8 |
| 8/11/09 | 6.6 |
| 8/11/09 | 6.2 |
| 8/11/09 | 5.1 |
| 8/11/09 | 4.6 |
| 8/11/09 | 6.2 |
| 8/11/09 | 8.1 |
| 8/11/09 | 7.1 |
| 8/11/09 | 7.4 |
| 8/11/09 | 6.3 |
| 8/11/09 | 7.4 |
| 8/11/09 | 6.3 |
| 8/11/09 | 7.1 |
| 8/11/09 | 7.1 |
| 8/11/09 | 7 |
| 8/11/09 | 5.7 |
| 8/11/09 | 5.1 |
| 8/11/09 | 4.6 |
| 8/11/09 | 4.3 |
| 8/11/09 | 3.7 |
| 8/11/09 | 4.5 |
| 8/11/09 | 4.8 |
| 8/11/09 | 6.1 |
| 8/11/09 | 3.3 |
| 8/11/09 | 4.9 |
| 8/11/09 | 4.7 |
| 8/11/09 | 4.2 |
| 8/11/09 | 5.3 |
| 8/11/09 | 4.1 |
| 8/11/09 | 3.8 |
| 8/11/09 | 3.8 |
| 8/11/09 | 4.9 |
| 8/11/09 | 5 |
| 8/11/09 | 4.2 |
| 8/11/09 | 5.8 |
| 8/11/09 | 6 |
| 8/11/09 | 4.9 |
| 8/11/09 | 5.5 |
| 8/10/09 | 5.9 |
| 8/10/09 | 5.4 |
| 8/10/09 | 6.3 |
| 8/10/09 | 5.3 |
| 8/10/09 | 5.5 |
| 8/10/09 | 7 |
| 8/10/09 | 6.2 |
| 8/10/09 | 5.7 |
| 8/10/09 | 9.1 |
| 8/10/09 | 7.5 |
| 8/10/09 | 7.7 |
| 8/10/09 | 8.1 |
| 8/10/09 | 7.9 |
| 8/10/09 | 6.9 |
| 8/10/09 | 6.9 |
| 8/10/09 | 6.7 |
| 8/10/09 | 7.4 |
| 8/10/09 | 7.9 |
| 8/10/09 | 7.6 |
| 8/10/09 | 7.7 |
| 8/10/09 | 7.2 |
| 8/10/09 | 8 |
| 8/10/09 | 6.2 |
| 8/10/09 | 6.5 |
| 8/10/09 | 6.9 |
| 8/10/09 | 6.6 |
| 8/10/09 | 7 |
| 8/10/09 | 6.8 |
| 8/10/09 | 6.9 |
| 8/10/09 | 6.4 |
| 8/10/09 | 5.5 |
| 8/10/09 | 3.8 |
| 8/10/09 | 4.2 |
| 8/10/09 | 4 |
| 8/10/09 | 4.2 |
| 8/10/09 | 5.2 |
| 8/10/09 | 5.5 |
| 8/10/09 | 3.2 |
| 8/10/09 | 4.5 |
| 8/10/09 | 4.6 |
| 8/10/09 | 4.4 |
| 8/10/09 | 5.3 |
| 8/10/09 | 4.4 |
| 8/10/09 | 4.8 |
| 8/10/09 | 5.3 |
| 8/10/09 | 5.6 |
| 8/10/09 | 6.6 |
| 8/10/09 | 4.8 |
| 8/9/09 | 6.3 |
| 8/9/09 | 6.4 |
| 8/9/09 | 5.9 |
| 8/9/09 | 5.8 |
| 8/9/09 | 6.3 |
| 8/9/09 | 6.1 |
| 8/9/09 | 6.8 |
| 8/9/09 | 5 |
| 8/9/09 | 6.8 |
| 8/9/09 | 7.4 |
| 8/9/09 | 7.1 |
| 8/9/09 | 6.4 |
| 8/9/09 | 8 |
| 8/9/09 | 6.7 |
| 8/9/09 | 7.8 |
| 8/9/09 | 7.6 |
| 8/9/09 | 8.9 |
| 8/9/09 | 8.1 |
| 8/9/09 | 7.6 |
| 8/9/09 | 7.9 |
| 8/9/09 | 7.4 |
| 8/9/09 | 6.6 |
| 8/9/09 | 7.2 |
| 8/9/09 | 7.7 |
| 8/9/09 | 6.4 |
| 8/9/09 | 9.2 |
| 8/9/09 | 6.7 |
| 8/9/09 | 7.4 |
| 8/9/09 | 6.2 |
| 8/9/09 | 4.9 |
| 8/9/09 | 5.6 |
| 8/9/09 | 5.4 |
| 8/9/09 | 4.9 |
| 8/9/09 | 6.6 |
| 8/9/09 | 6.2 |
| 8/9/09 | 6.4 |
| 8/9/09 | 5.1 |
| 8/9/09 | 5.6 |
| 8/9/09 | 5.6 |
| 8/9/09 | 5.6 |
| 8/9/09 | 5.4 |
| 8/9/09 | 5.6 |
| 8/9/09 | 4.8 |
| 8/9/09 | 5.9 |
| 8/9/09 | 4.4 |
| 8/9/09 | 5.3 |
| 8/9/09 | 6.5 |
| 8/9/09 | 5.9 |
| 8/8/09 | 5.9 |
| 8/8/09 | 5.8 |
| 8/8/09 | 6.1 |
| 8/8/09 | 8.1 |
| 8/8/09 | 5.9 |
| 8/8/09 | 7.8 |
| 8/8/09 | 7 |
| 8/8/09 | 7 |
| 8/8/09 | 6.9 |
| 8/8/09 | 6.5 |
| 8/8/09 | 7.5 |
| 8/8/09 | 7.7 |
| 8/8/09 | 8.3 |
| 8/8/09 | 7.6 |
| 8/8/09 | 6.2 |
| 8/8/09 | 5.7 |
| 8/8/09 | 6.3 |
| 8/8/09 | 6.8 |
| 8/8/09 | 5.1 |
| 8/8/09 | 5.9 |
| 8/8/09 | 7 |
| 8/8/09 | 6 |
| 8/8/09 | 4.7 |
| 8/8/09 | 5.2 |
| 8/8/09 | 4.5 |
| 8/8/09 | 3.2 |
| 8/8/09 | 4.8 |
| 8/8/09 | 4.5 |
| 8/8/09 | 5 |
| 8/8/09 | 5.6 |
| 8/8/09 | 4.6 |
| 8/8/09 | 4.8 |
| 8/8/09 | 5.1 |
| 8/8/09 | 5.4 |
| 8/8/09 | 5.8 |
| 8/8/09 | 4.8 |
| 8/8/09 | 5.6 |
| 8/8/09 | 4.4 |
| 8/8/09 | 4.8 |
| 8/8/09 | 5.1 |
| 8/8/09 | 4.3 |
| 8/8/09 | 5.1 |
| 8/8/09 | 5.6 |
| 8/8/09 | 5.5 |
| 8/8/09 | 5 |
| 8/8/09 | 6 |
| 8/8/09 | 5.2 |
| 8/8/09 | 5.5 |
| 8/7/09 | 6.5 |
| 8/7/09 | 6.3 |
| 8/7/09 | 6.8 |
| 8/7/09 | 6.4 |
| 8/7/09 | 5.7 |
| 8/7/09 | 7.7 |
| 8/7/09 | 6.3 |
| 8/7/09 | 6.8 |
| 8/7/09 | 4.8 |
| 8/7/09 | 4.9 |
| 8/7/09 | 8.1 |
| 8/7/09 | 6.9 |
| 8/7/09 | 6.6 |
| 8/7/09 | 7.6 |
| 8/7/09 | 6.6 |
| 8/7/09 | 8.2 |
| 8/7/09 | 7.6 |
| 8/7/09 | 8.4 |
| 8/7/09 | 6.3 |
| 8/7/09 | 8.5 |
| 8/7/09 | 6.5 |
| 8/7/09 | 8.9 |
| 8/7/09 | 7.6 |
| 8/7/09 | 8.2 |
| 8/7/09 | 4 |
| 8/7/09 | 5.2 |
| 8/7/09 | 5.8 |
| 8/7/09 | 5.2 |
| 8/7/09 | 5.1 |
| 8/7/09 | 5.5 |
| 8/7/09 | 4.2 |
| 8/7/09 | 5.3 |
| 8/7/09 | 5.3 |
| 8/7/09 | 2.8 |
| 8/7/09 | 5.2 |
| 8/7/09 | 5.3 |
| 8/7/09 | 4.7 |
| 8/7/09 | 4.1 |
| 8/7/09 | 5.6 |
| 8/7/09 | 4.9 |
| 8/7/09 | 4.4 |
| 8/7/09 | 4.4 |
| 8/7/09 | 4.1 |
| 8/7/09 | 5.3 |
| 8/7/09 | 4.5 |
| 8/7/09 | 4.9 |
| 8/6/09 | 4.8 |
| 8/6/09 | 4.5 |
| 8/6/09 | 5.5 |
| 8/6/09 | 5.8 |
| 8/6/09 | 5.6 |
| 8/6/09 | 5.7 |
| 8/6/09 | 6.6 |
| 8/6/09 | 6.3 |
| 8/6/09 | 5.7 |
| 8/6/09 | 5.3 |
| 8/6/09 | 5.8 |
| 8/6/09 | 5.4 |
| 8/6/09 | 5.8 |
| 8/6/09 | 6.1 |
| 8/6/09 | 4.3 |
| 8/6/09 | 7.6 |
| 8/6/09 | 3.7 |
| 8/6/09 | 4.3 |
| 8/6/09 | 4.9 |
| 8/6/09 | 4.5 |
| 8/6/09 | 5.3 |
| 8/6/09 | 3.6 |
| 8/6/09 | 5.7 |
| 8/6/09 | 4.8 |
| 8/6/09 | 5.6 |
| 8/6/09 | 6 |
| 8/6/09 | 4.6 |
| 8/6/09 | 6.8 |
| 8/6/09 | 4.7 |
| 8/6/09 | 6 |
| 8/6/09 | 5.7 |
| 8/6/09 | 6.5 |
| 8/6/09 | 5.9 |
| 8/6/09 | 6 |
| 8/6/09 | 5 |
| 8/6/09 | 3.9 |
| 8/6/09 | 4.9 |
| 8/6/09 | 5.3 |
| 8/6/09 | 3.4 |
| 8/6/09 | 5.5 |
| 8/6/09 | 4.9 |
| 8/6/09 | 3.9 |
| 8/6/09 | 3.6 |
| 8/6/09 | 5 |
| 8/6/09 | 4.8 |
| 8/6/09 | 4.5 |
| 8/6/09 | 6 |
| 8/6/09 | 4.8 |
| 8/5/09 | 5.3 |
| 8/5/09 | 5.3 |
| 8/5/09 | 3.5 |
| 8/5/09 | 4.5 |
| 8/5/09 | 4.4 |
| 8/5/09 | 4.1 |
| 8/5/09 | 5.7 |
| 8/5/09 | 5.6 |
| 8/5/09 | 5.1 |
| 8/5/09 | 4.8 |
| 8/5/09 | 5 |
| 8/5/09 | 6 |
| 8/5/09 | 5.9 |
| 8/5/09 | 6.7 |
| 8/5/09 | 5.9 |
| 8/5/09 | 6 |
| 8/5/09 | 4.4 |
| 8/5/09 | 5.5 |
| 8/5/09 | 5.1 |
| 8/5/09 | 5.8 |
| 8/5/09 | 4.5 |
| 8/5/09 | 6.2 |
| 8/5/09 | 4.5 |
| 8/5/09 | 4.3 |
| 8/5/09 | 5.1 |
| 8/5/09 | 4.7 |
| 8/5/09 | 3.9 |
| 8/5/09 | 4.2 |
| 8/5/09 | 5 |
| 8/5/09 | 3.5 |
| 8/5/09 | 4 |
| 8/5/09 | 4.5 |
| 8/5/09 | 4.5 |
| 8/5/09 | 5.4 |
| 8/5/09 | 4.7 |
| 8/5/09 | 5.2 |
| 8/5/09 | 2.6 |
| 8/5/09 | 2.9 |
| 8/5/09 | 3.4 |
| 8/5/09 | 3.9 |
| 8/5/09 | 4 |
| 8/5/09 | 3.7 |
| 8/5/09 | 4.5 |
| 8/5/09 | 4.7 |
| 8/5/09 | 4.9 |
| 8/5/09 | 4.9 |
| 8/5/09 | 5.6 |
| 8/5/09 | 4 |
| 8/4/09 | 4.2 |
| 8/4/09 | 4.9 |
| 8/4/09 | 4.4 |
| 8/4/09 | 4.6 |
| 8/4/09 | 4.4 |
| 8/4/09 | 3.9 |
| 8/4/09 | 4.2 |
| 8/4/09 | 4.4 |
| 8/4/09 | 4.2 |
| 8/4/09 | 5.5 |
| 8/4/09 | 4.2 |
| 8/4/09 | 4.8 |
| 8/4/09 | 4.4 |
| 8/4/09 | 3.7 |
| 8/4/09 | 5.1 |
| 8/4/09 | 5.1 |
| 8/4/09 | 6.2 |
| 8/4/09 | 5.3 |
| 8/4/09 | 4.9 |
| 8/4/09 | 4.6 |
| 8/4/09 | 4.1 |
| 8/4/09 | 4.9 |
| 8/4/09 | 5.9 |
| 8/4/09 | 6.4 |
| 8/4/09 | 4.3 |
| 8/4/09 | 3.6 |
| 8/4/09 | 4 |
| 8/4/09 | 4.3 |
| 8/4/09 | 3.3 |
| 8/4/09 | 3.3 |
| 8/4/09 | 3 |
| 8/4/09 | 3 |
| 8/4/09 | 3.5 |
| 8/4/09 | 3.7 |
| 8/4/09 | 4.5 |
| 8/4/09 | 4.8 |
| 8/4/09 | 4.3 |
| 8/4/09 | 3.1 |
| 8/4/09 | 3.4 |
| 8/4/09 | 4.1 |
| 8/4/09 | 4.1 |
| 8/4/09 | 3.9 |
| 8/4/09 | 4.5 |
| 8/4/09 | 4.2 |
| 8/4/09 | 5.1 |
| 8/4/09 | 5.9 |
| 8/4/09 | 5.1 |
| 8/4/09 | 5.4 |
| 8/3/09 | 4.4 |
| 8/3/09 | 3.9 |
| 8/3/09 | 4.4 |
| 8/3/09 | 5.5 |
| 8/3/09 | 5.5 |
| 8/3/09 | 5.9 |
| 8/3/09 | 4.1 |
| 8/3/09 | 4.6 |
| 8/3/09 | 3.2 |
| 8/3/09 | 4.1 |
| 8/3/09 | 3.8 |
| 8/3/09 | 4.2 |
| 8/3/09 | 5.1 |
| 8/3/09 | 3.3 |
| 8/3/09 | 6.5 |
| 8/3/09 | 7.5 |
| 8/3/09 | 6.4 |
| 8/3/09 | 6.7 |
| 8/3/09 | 4 |
| 8/3/09 | 5.9 |
| 8/3/09 | 7.6 |
| 8/3/09 | 8.5 |
| 8/3/09 | 7.6 |
| 8/3/09 | 7.7 |
| 8/3/09 | 6 |
| 8/3/09 | 5.4 |
| 8/3/09 | 5.3 |
| 8/3/09 | 4.2 |
| 8/3/09 | 4.1 |
| 8/3/09 | 5.2 |
| 8/3/09 | 4.7 |
| 8/3/09 | 5.6 |
| 8/3/09 | 4.7 |
| 8/3/09 | 5.1 |
| 8/3/09 | 5.3 |
| 8/3/09 | 4.5 |
| 8/3/09 | 3.8 |
| 8/3/09 | 4.4 |
| 8/3/09 | 4.8 |
| 8/3/09 | 4.3 |
| 8/3/09 | 5.6 |
| 8/3/09 | 3.5 |
| 8/3/09 | 4.4 |
| 8/3/09 | 4.5 |
| 8/3/09 | 4.6 |
| 8/3/09 | 4 |
| 8/3/09 | 4.9 |
| 8/3/09 | 5.4 |
| 8/2/09 | 5.1 |
| 8/2/09 | 4.8 |
| 8/2/09 | 5 |
| 8/2/09 | 4 |
| 8/2/09 | 4.7 |
| 8/2/09 | 6.9 |
| 8/2/09 | 6.2 |
| 8/2/09 | 3.8 |
| 8/2/09 | 6.6 |
| 8/2/09 | 6.1 |
| 8/2/09 | 6.1 |
| 8/2/09 | 6.9 |
| 8/2/09 | 6.7 |
| 8/2/09 | 6.9 |
| 8/2/09 | 6.9 |
| 8/2/09 | 6.2 |
| 8/2/09 | 5.1 |
| 8/2/09 | 5.8 |
| 8/2/09 | 5.9 |
| 8/2/09 | 5.6 |
| 8/2/09 | 3.5 |
| 8/2/09 | 3.8 |
| 8/2/09 | 2.6 |
| 8/2/09 | 3.1 |
| 8/2/09 | 4.2 |
| 8/2/09 | 3.1 |
| 8/2/09 | 4.8 |
| 8/2/09 | 5.4 |
| 8/2/09 | 4.4 |
| 8/2/09 | 4.3 |
| 8/2/09 | 5.1 |
| 8/2/09 | 5 |
| 8/2/09 | 4.1 |
| 8/2/09 | 5 |
| 8/2/09 | 4.5 |
| 8/2/09 | 4 |
| 8/2/09 | 5.1 |
| 8/2/09 | 3.8 |
| 8/2/09 | 4.5 |
| 8/2/09 | 6.5 |
| 8/2/09 | 5.1 |
| 8/2/09 | 6.2 |
| 8/2/09 | 4.9 |
| 8/2/09 | 3.7 |
| 8/2/09 | 5.1 |
| 8/2/09 | 6.4 |
| 8/2/09 | 4.2 |
| 8/2/09 | 5.6 |
| 8/1/09 | 4.4 |
| 8/1/09 | 5.3 |
| 8/1/09 | 4.8 |
| 8/1/09 | 6.6 |
| 8/1/09 | 7.4 |
| 8/1/09 | 5.9 |
| 8/1/09 | 6.2 |
| 8/1/09 | 6.1 |
| 8/1/09 | 4.2 |
| 8/1/09 | 5 |
| 8/1/09 | 4.4 |
| 8/1/09 | 3.8 |
| 8/1/09 | 2.7 |
| 8/1/09 | 5.5 |
| 8/1/09 | 6.4 |
| 8/1/09 | 5.2 |
| 8/1/09 | 5.5 |
| 8/1/09 | 1.9 |
| 8/1/09 | 7.5 |
| 8/1/09 | 3.2 |
| 8/1/09 | 1.5 |
| 8/1/09 | 5 |
| 8/1/09 | 5.8 |
| 8/1/09 | 5.2 |
| 8/1/09 | 3.6 |
| 8/1/09 | 3.1 |
| 8/1/09 | 2.9 |
| 8/1/09 | 3.4 |
| 8/1/09 | 3.1 |
| 8/1/09 | 4 |
| 8/1/09 | 4.8 |
| 8/1/09 | 2.9 |
| 8/1/09 | 3.8 |
| 8/1/09 | 4.3 |
| 8/1/09 | 3.7 |
| 8/1/09 | 4.4 |
| 8/1/09 | 3.4 |
| 8/1/09 | 3.7 |
| 8/1/09 | 5.3 |
| 8/1/09 | 3.6 |
| 8/1/09 | 4.3 |
| 8/1/09 | 3.4 |
| 8/1/09 | 3.8 |
| 8/1/09 | 3.9 |
| 8/1/09 | 5.1 |
| 8/1/09 | 3.9 |
| 8/1/09 | 3.7 |
| 8/1/09 | 3.6 |
| 7/31/09 | 3.6 |
| 7/31/09 | 4.6 |
| 7/31/09 | 4.7 |
| 7/31/09 | 3.9 |
| 7/31/09 | 4.2 |
| 7/31/09 | 5.7 |
| 7/31/09 | 3 |
| 7/31/09 | 6.5 |
| 7/31/09 | 2.6 |
| 7/31/09 | 6.4 |
| 7/31/09 | 5.5 |
| 7/31/09 | 5.8 |
| 7/31/09 | 4.7 |
| 7/31/09 | 6.1 |
| 7/31/09 | 6.9 |
| 7/31/09 | 5.3 |
| 7/31/09 | 3.6 |
| 7/31/09 | 3 |
| 7/31/09 | 4 |
| 7/31/09 | 5.8 |
| 7/31/09 | 3.7 |
| 7/31/09 | 1.4 |
| 7/31/09 | 3.3 |
| 7/31/09 | 3.2 |
| 7/31/09 | 3 |
| 7/31/09 | 4.4 |
| 7/31/09 | 3.2 |
| 7/31/09 | 3.8 |
| 7/31/09 | 2.9 |
| 7/31/09 | 2.7 |
| 7/31/09 | 2.5 |
| 7/31/09 | 3.7 |
| 7/31/09 | 4 |
| 7/31/09 | 4.1 |
| 7/31/09 | 4 |
| 7/31/09 | 3 |
| 7/31/09 | 3.5 |
| 7/31/09 | 1.4 |
| 7/31/09 | 2.2 |
| 7/31/09 | 2.8 |
| 7/31/09 | 3.8 |
| 7/31/09 | 3.3 |
| 7/31/09 | 4.7 |
| 7/31/09 | 4 |
| 7/31/09 | 2 |
| 7/31/09 | 3.7 |
| 7/31/09 | 4.4 |
| 7/31/09 | 2.1 |
| 7/30/09 | 2.8 |
| 7/30/09 | 4 |
| 7/30/09 | 2.2 |
| 7/30/09 | 2.7 |
| 7/30/09 | 5.5 |
| 7/30/09 | 4.5 |
| 7/30/09 | 5.6 |
| 7/30/09 | 5.7 |
| 7/30/09 | 6.1 |
| 7/30/09 | 6 |
| 7/30/09 | 6.1 |
| 7/30/09 | 4.9 |
| 7/30/09 | 1.8 |
| 7/30/09 | 3.7 |
| 7/30/09 | 1.4 |
| 7/30/09 | 2.7 |
| 7/30/09 | 5.9 |
| 7/30/09 | 3.4 |
| 7/30/09 | 4.5 |
| 7/30/09 | 4.6 |
| 7/30/09 | 4.3 |
| 7/30/09 | 4 |
| 7/30/09 | 4.6 |
| 7/30/09 | 4 |
| 7/30/09 | 2.5 |
| 7/30/09 | 1.9 |
| 7/30/09 | 1.7 |
| 7/30/09 | 2.9 |
| 7/30/09 | 3.1 |
| 7/30/09 | 3.7 |
| 7/30/09 | 3 |
| 7/30/09 | 4.4 |
| 7/30/09 | 4.3 |
| 7/30/09 | 3.9 |
| 7/30/09 | 3.1 |
| 7/30/09 | 4.4 |
| 7/30/09 | 3.6 |
| 7/30/09 | 3.5 |
| 7/30/09 | 3.6 |
| 7/30/09 | 3.6 |
| 7/30/09 | 3.2 |
| 7/30/09 | 3.7 |
| 7/30/09 | 5.4 |
| 7/30/09 | 4.9 |
| 7/30/09 | 5 |
| 7/30/09 | 6.1 |
| 7/30/09 | 5.2 |
| 7/30/09 | 4.3 |
| 7/29/09 | 5.9 |
| 7/29/09 | 5.7 |
| 7/29/09 | 4.4 |
| 7/29/09 | 4.2 |
| 7/29/09 | 6.3 |
| 7/29/09 | 6.2 |
| 7/29/09 | 6.3 |
| 7/29/09 | 7.5 |
| 7/29/09 | 5.5 |
| 7/29/09 | 7.7 |
| 7/29/09 | 7 |
| 7/29/09 | 6.2 |
| 7/29/09 | 8.1 |
| 7/29/09 | 7.1 |
| 7/29/09 | 7.9 |
| 7/29/09 | 7.2 |
| 7/29/09 | 4.9 |
| 7/29/09 | 4.5 |
| 7/29/09 | 5.2 |
| 7/29/09 | 4.8 |
| 7/29/09 | 6.3 |
| 7/29/09 | 6.6 |
| 7/29/09 | 4.6 |
| 7/29/09 | 4.9 |
| 7/29/09 | 4.1 |
| 7/29/09 | 5.2 |
| 7/29/09 | 4.1 |
| 7/29/09 | 3.1 |
| 7/29/09 | 5.2 |
| 7/29/09 | 4.9 |
| 7/29/09 | 5.6 |
| 7/29/09 | 4.5 |
| 7/29/09 | 5.5 |
| 7/29/09 | 4.9 |
| 7/29/09 | 4.8 |
| 7/29/09 | 4.8 |
| 7/29/09 | 4.7 |
| 7/29/09 | 4.4 |
| 7/29/09 | 4.2 |
| 7/29/09 | 5.6 |
| 7/29/09 | 2.6 |
| 7/29/09 | 4.2 |
| 7/29/09 | 3.5 |
| 7/29/09 | 5.7 |
| 7/29/09 | 7.3 |
| 7/29/09 | 5 |
| 7/29/09 | 6.5 |
| 7/29/09 | 6 |
| 7/28/09 | 8.6 |
| 7/28/09 | 5.7 |
| 7/28/09 | 7.2 |
| 7/28/09 | 7.2 |
| 7/28/09 | 6.5 |
| 7/28/09 | 7.7 |
| 7/28/09 | 6.4 |
| 7/28/09 | 6.5 |
| 7/28/09 | 5.1 |
| 7/28/09 | 6.3 |
| 7/28/09 | 6.5 |
| 7/28/09 | 6.7 |
| 7/28/09 | 6.2 |
| 7/28/09 | 5.7 |
| 7/28/09 | 5.2 |
| 7/28/09 | 5 |
| 7/28/09 | 5.7 |
| 7/28/09 | 5.6 |
| 7/28/09 | 7 |
| 7/28/09 | 5.6 |
| 7/28/09 | 8.5 |
| 7/28/09 | 10.6 |
| 7/28/09 | 7.4 |
| 7/28/09 | 7 |
| 7/28/09 | 8.6 |
| 7/28/09 | 7.9 |
| 7/28/09 | 3.8 |
| 7/28/09 | 6.5 |
| 7/28/09 | 4.4 |
| 7/28/09 | 5.6 |
| 7/28/09 | 5.8 |
| 7/28/09 | 6.8 |
| 7/28/09 | 6.1 |
| 7/28/09 | 6.7 |
| 7/28/09 | 5.9 |
| 7/28/09 | 5.1 |
| 7/28/09 | 7.5 |
| 7/28/09 | 5.7 |
| 7/28/09 | 5.6 |
| 7/28/09 | 7.3 |
| 7/28/09 | 4.5 |
| 7/28/09 | 5.1 |
| 7/28/09 | 5 |
| 7/28/09 | 4.2 |
| 7/28/09 | 5.7 |
| 7/28/09 | 5.6 |
| 7/28/09 | 6 |
| 7/28/09 | 5.6 |
| 7/27/09 | 6.4 |
| 7/27/09 | 6.4 |
| 7/27/09 | 7 |
| 7/27/09 | 7.9 |
| 7/27/09 | 7.9 |
| 7/27/09 | 6.3 |
| 7/27/09 | 4.2 |
| 7/27/09 | 5 |
| 7/27/09 | 4.5 |
| 7/27/09 | 6.8 |
| 7/27/09 | 7.5 |
| 7/27/09 | 11.6 |
| 7/27/09 | 6.2 |
| 7/27/09 | 7.8 |
| 7/27/09 | 10.5 |
| 7/27/09 | 7.6 |
| 7/27/09 | 6.3 |
| 7/27/09 | 7.9 |
| 7/27/09 | 6.5 |
| 7/27/09 | 5.6 |
| 7/27/09 | 7.6 |
| 7/27/09 | 7 |
| 7/27/09 | 8.9 |
| 7/27/09 | 7.1 |
| 7/27/09 | 8.3 |
| 7/27/09 | 6.9 |
| 7/27/09 | 7.3 |
| 7/27/09 | 8.1 |
| 7/27/09 | 7.6 |
| 7/27/09 | 6.7 |
| 7/27/09 | 5.5 |
| 7/27/09 | 4 |
| 7/27/09 | 3.8 |
| 7/27/09 | 4.1 |
| 7/27/09 | 4.8 |
| 7/27/09 | 4.3 |
| 7/27/09 | 5 |
| 7/27/09 | 3.9 |
| 7/27/09 | 3.9 |
| 7/27/09 | 3.8 |
| 7/27/09 | 5.2 |
| 7/27/09 | 5.3 |
| 7/27/09 | 4.3 |
| 7/27/09 | 4.2 |
| 7/27/09 | 5.3 |
| 7/27/09 | 5.3 |
| 7/27/09 | 5.4 |
| 7/27/09 | 5.1 |
| 7/26/09 | 5.6 |
| 7/26/09 | 7.3 |
| 7/26/09 | 6.9 |
| 7/26/09 | 6.2 |
| 7/26/09 | 5.3 |
| 7/26/09 | 5.2 |
| 7/26/09 | 5.4 |
| 7/26/09 | 5.5 |
| 7/26/09 | 5 |
| 7/26/09 | 3.6 |
| 7/26/09 | 6.2 |
| 7/26/09 | 6.2 |
| 7/26/09 | 6.6 |
| 7/26/09 | 6.6 |
| 7/26/09 | 7.7 |
| 7/26/09 | 7.4 |
| 7/26/09 | 10 |
| 7/26/09 | 10.7 |
| 7/26/09 | 8.3 |
| 7/26/09 | 8.2 |
| 7/26/09 | 8.2 |
| 7/26/09 | 7.5 |
| 7/26/09 | 8 |
| 7/26/09 | 6 |
| 7/26/09 | 4.4 |
| 7/26/09 | 5.1 |
| 7/26/09 | 5.9 |
| 7/26/09 | 7.4 |
| 7/26/09 | 3.4 |
| 7/26/09 | 6.6 |
| 7/26/09 | 6.7 |
| 7/26/09 | 3.7 |
| 7/26/09 | 4.2 |
| 7/26/09 | 4.8 |
| 7/26/09 | 3.8 |
| 7/26/09 | 5.4 |
| 7/26/09 | 3.1 |
| 7/26/09 | 3.4 |
| 7/26/09 | 3.9 |
| 7/26/09 | 4.6 |
| 7/26/09 | 4.3 |
| 7/26/09 | 5.6 |
| 7/26/09 | 5 |
| 7/26/09 | 4.2 |
| 7/26/09 | 3.7 |
| 7/26/09 | 5.7 |
| 7/26/09 | 4.7 |
| 7/26/09 | 4.3 |
| 7/25/09 | 5.2 |
| 7/25/09 | 3.9 |
| 7/25/09 | 5.2 |
| 7/25/09 | 5.7 |
| 7/25/09 | 5.9 |
| 7/25/09 | 5.6 |
| 7/25/09 | 6.7 |
| 7/25/09 | 6.2 |
| 7/25/09 | 6.2 |
| 7/25/09 | 6.5 |
| 7/25/09 | 6.4 |
| 7/25/09 | 6.5 |
| 7/25/09 | 5 |
| 7/25/09 | 7.6 |
| 7/25/09 | 6.7 |
| 7/25/09 | 7.1 |
| 7/25/09 | 8.9 |
| 7/25/09 | 5.5 |
| 7/25/09 | 7.4 |
| 7/25/09 | 8.8 |
| 7/25/09 | 7 |
| 7/25/09 | 6.9 |
| 7/25/09 | 5.8 |
| 7/25/09 | 6.5 |
| 7/25/09 | 7.1 |
| 7/25/09 | 6 |
| 7/25/09 | 4.6 |
| 7/25/09 | 3.5 |
| 7/25/09 | 2.9 |
| 7/25/09 | 6.5 |
| 7/25/09 | 3.8 |
| 7/25/09 | 4.2 |
| 7/25/09 | 4.5 |
| 7/25/09 | 3.8 |
| 7/25/09 | 4.4 |
| 7/25/09 | 3.4 |
| 7/25/09 | 4.5 |
| 7/25/09 | 4.6 |
| 7/25/09 | 4.2 |
| 7/25/09 | 2.9 |
| 7/25/09 | 4.9 |
| 7/25/09 | 4.1 |
| 7/25/09 | 4.5 |
| 7/25/09 | 4.7 |
| 7/25/09 | 4.9 |
| 7/25/09 | 4.5 |
| 7/25/09 | 4.4 |
| 7/25/09 | 3.8 |
| 7/24/09 | 4.7 |
| 7/24/09 | 4.3 |
| 7/24/09 | 4.1 |
| 7/24/09 | 5.7 |
| 7/24/09 | 6.5 |
| 7/24/09 | 5.2 |
| 7/24/09 | 5.4 |
| 7/24/09 | 3.7 |
| 7/24/09 | 5.6 |
| 7/24/09 | 7.2 |
| 7/24/09 | 4.4 |
| 7/24/09 | 6.7 |
| 7/24/09 | 6.7 |
| 7/24/09 | 6.7 |
| 7/24/09 | 7 |
| 7/24/09 | 7.4 |
| 7/24/09 | 8.7 |
| 7/24/09 | 5.9 |
| 7/24/09 | 7.8 |
| 7/24/09 | 6.2 |
| 7/24/09 | 5.3 |
| 7/24/09 | 5.5 |
| 7/24/09 | 4.5 |
| 7/24/09 | 5.8 |
| 7/24/09 | 4.9 |
| 7/24/09 | 5.3 |
| 7/24/09 | 3.2 |
| 7/24/09 | 4.3 |
| 7/24/09 | 3.1 |
| 7/24/09 | 3.2 |
| 7/24/09 | 3.5 |
| 7/24/09 | 3.9 |
| 7/24/09 | 3.9 |
| 7/24/09 | 3.4 |
| 7/24/09 | 4.2 |
| 7/24/09 | 3.7 |
| 7/24/09 | 5.2 |
| 7/24/09 | 4.1 |
| 7/24/09 | 3.2 |
| 7/24/09 | 3.7 |
| 7/24/09 | 4 |
| 7/24/09 | 4.3 |
| 7/24/09 | 5.2 |
| 7/24/09 | 3.4 |
| 7/24/09 | 3.7 |
| 7/24/09 | 3.7 |
| 7/24/09 | 5.3 |
| 7/24/09 | 4.7 |
| 7/23/09 | 5 |
| 7/23/09 | 3.7 |
| 7/23/09 | 3 |
| 7/23/09 | 4.4 |
| 7/23/09 | 4.7 |
| 7/23/09 | 5.1 |
| 7/23/09 | 5.3 |
| 7/23/09 | 6.1 |
| 7/23/09 | 5.3 |
| 7/23/09 | 6.7 |
| 7/23/09 | 7.2 |
| 7/23/09 | 5.7 |
| 7/23/09 | 6.4 |
| 7/23/09 | 7.8 |
| 7/23/09 | 6.1 |
| 7/23/09 | 7.3 |
| 7/23/09 | 6.6 |
| 7/23/09 | 8.6 |
| 7/23/09 | 7 |
| 7/23/09 | 8.1 |
| 7/23/09 | 7.2 |
| 7/23/09 | 6.4 |
| 7/23/09 | 4.9 |
| 7/23/09 | 4.7 |
| 7/23/09 | 5.5 |
| 7/23/09 | 4.3 |
| 7/23/09 | 4.1 |
| 7/23/09 | 3.2 |
| 7/23/09 | 3.7 |
| 7/23/09 | 2.6 |
| 7/23/09 | 2.1 |
| 7/23/09 | 3 |
| 7/23/09 | 4.6 |
| 7/23/09 | 4.4 |
| 7/23/09 | 5.6 |
| 7/23/09 | 4.7 |
| 7/23/09 | 4.6 |
| 7/23/09 | 4.3 |
| 7/23/09 | 5 |
| 7/23/09 | 4.4 |
| 7/23/09 | 3.3 |
| 7/23/09 | 3.2 |
| 7/23/09 | 5.7 |
| 7/23/09 | 3.5 |
| 7/23/09 | 4.8 |
| 7/23/09 | 4.7 |
| 7/23/09 | 7.3 |
| 7/23/09 | 4.2 |
| 7/22/09 | 5.8 |
| 7/22/09 | 5 |
| 7/22/09 | 5 |
| 7/22/09 | 5.1 |
| 7/22/09 | 7 |
| 7/22/09 | 6.3 |
| 7/22/09 | 4.5 |
| 7/22/09 | 6.2 |
| 7/22/09 | 6.6 |
| 7/22/09 | 6 |
| 7/22/09 | 3.6 |
| 7/22/09 | 3.5 |
| 7/22/09 | 5.1 |
| 7/22/09 | 5.7 |
| 7/22/09 | 3.8 |
| 7/22/09 | 3 |
| 7/22/09 | 2.2 |
| 7/22/09 | 5.1 |
| 7/22/09 | 4.7 |
| 7/22/09 | 5.1 |
| 7/22/09 | 6 |
| 7/22/09 | 4.8 |
| 7/22/09 | 4.6 |
| 7/22/09 | 3.7 |
| 7/22/09 | 4.2 |
| 7/22/09 | 4.2 |
| 7/22/09 | 4 |
| 7/22/09 | 4 |
| 7/22/09 | 3.8 |
| 7/22/09 | 4.4 |
| 7/22/09 | 5.6 |
| 7/22/09 | 4.7 |
| 7/22/09 | 3.2 |
| 7/22/09 | 5.4 |
| 7/22/09 | 3.8 |
| 7/22/09 | 4 |
| 7/22/09 | 5.2 |
| 7/22/09 | 5.7 |
| 7/22/09 | 5 |
| 7/22/09 | 4.7 |
| 7/22/09 | 4.2 |
| 7/22/09 | 5 |
| 7/22/09 | 5.3 |
| 7/22/09 | 4.3 |
| 7/22/09 | 4.3 |
| 7/22/09 | 4.9 |
| 7/22/09 | 4.5 |
| 7/22/09 | 5.9 |
| 7/21/09 | 5.3 |
| 7/21/09 | 5.2 |
| 7/21/09 | 4.6 |
| 7/21/09 | 5 |
| 7/21/09 | 6.1 |
| 7/21/09 | 5.8 |
| 7/21/09 | 5.9 |
| 7/21/09 | 4.1 |
| 7/21/09 | 4.8 |
| 7/21/09 | 6 |
| 7/21/09 | 5.8 |
| 7/21/09 | 4.8 |
| 7/21/09 | 5.8 |
| 7/21/09 | 5.1 |
| 7/21/09 | 4 |
| 7/21/09 | 7.2 |
| 7/21/09 | 6.9 |
| 7/21/09 | 6.7 |
| 7/21/09 | 4.6 |
| 7/21/09 | 6.7 |
| 7/21/09 | 8.3 |
| 7/21/09 | 6.4 |
| 7/21/09 | 5.1 |
| 7/21/09 | 5.7 |
| 7/21/09 | 5 |
| 7/21/09 | 5.4 |
| 7/21/09 | 6.4 |
| 7/21/09 | 6.2 |
| 7/21/09 | 5.3 |
| 7/21/09 | 3.7 |
| 7/21/09 | 4.5 |
| 7/21/09 | 4.6 |
| 7/21/09 | 3.1 |
| 7/21/09 | 3.3 |
| 7/21/09 | 3.8 |
| 7/21/09 | 4.2 |
| 7/21/09 | 4.3 |
| 7/21/09 | 4.1 |
| 7/21/09 | 3 |
| 7/21/09 | 3.5 |
| 7/21/09 | 4.5 |
| 7/21/09 | 3.6 |
| 7/21/09 | 3.9 |
| 7/21/09 | 4.3 |
| 7/21/09 | 3.3 |
| 7/21/09 | 3.6 |
| 7/21/09 | 4.2 |
| 7/21/09 | 4.8 |
| 7/20/09 | 4.8 |
| 7/20/09 | 5.7 |
| 7/20/09 | 4.9 |
| 7/20/09 | 4.1 |
| 7/20/09 | 4.9 |
| 7/20/09 | 5.1 |
| 7/20/09 | 4.8 |
| 7/20/09 | 6.2 |
| 7/20/09 | 5.6 |
| 7/20/09 | 6.1 |
| 7/20/09 | 2 |
| 7/20/09 | 2.4 |
| 7/20/09 | 2.1 |
| 7/20/09 | 4.5 |
| 7/20/09 | 3.3 |
| 7/20/09 | 5 |
| 7/20/09 | 5.2 |
| 7/20/09 | 5.6 |
| 7/20/09 | 4.4 |
| 7/20/09 | 6.4 |
| 7/20/09 | 6 |
| 7/20/09 | 6 |
| 7/20/09 | 5.1 |
| 7/20/09 | 4.5 |
| 7/20/09 | 4.8 |
| 7/20/09 | 5.7 |
| 7/20/09 | 5.3 |
| 7/20/09 | 5.7 |
| 7/20/09 | 3.7 |
| 7/20/09 | 2.6 |
| 7/20/09 | 3.8 |
| 7/20/09 | 4.3 |
| 7/20/09 | 4.5 |
| 7/20/09 | 3.1 |
| 7/20/09 | 3.2 |
| 7/20/09 | 4.2 |
| 7/20/09 | 3.5 |
| 7/20/09 | 4.2 |
| 7/20/09 | 3.5 |
| 7/20/09 | 3.6 |
| 7/20/09 | 3.4 |
| 7/20/09 | 4 |
| 7/20/09 | 4 |
| 7/20/09 | 5 |
| 7/20/09 | 3.9 |
| 7/20/09 | 5.3 |
| 7/20/09 | 3.7 |
| 7/20/09 | 2.7 |
| 7/19/09 | 3 |
| 7/19/09 | 2.2 |
| 7/19/09 | 2.7 |
| 7/19/09 | 4.2 |
| 7/19/09 | 3.6 |
| 7/19/09 | 3.8 |
| 7/19/09 | 3.7 |
| 7/19/09 | 3 |
| 7/19/09 | 3.1 |
| 7/19/09 | 3.5 |
| 7/19/09 | 3.9 |
| 7/19/09 | 2.4 |
| 7/19/09 | 3.6 |
| 7/19/09 | 4.4 |
| 7/19/09 | 2.2 |
| 7/19/09 | 4.1 |
| 7/19/09 | 3.1 |
| 7/19/09 | 4 |
| 7/19/09 | 4.8 |
| 7/19/09 | 5.5 |
| 7/19/09 | 5.9 |
| 7/19/09 | 4.7 |
| 7/19/09 | 4.1 |
| 7/19/09 | 5.4 |
| 7/19/09 | 3.4 |
| 7/19/09 | 3.6 |
| 7/19/09 | 4.1 |
| 7/19/09 | 2.2 |
| 7/19/09 | 2.9 |
| 7/19/09 | 2.3 |
| 7/19/09 | 2.3 |
| 7/19/09 | 2.4 |
| 7/19/09 | 2.3 |
| 7/19/09 | 2.2 |
| 7/19/09 | 2.6 |
| 7/19/09 | 2.1 |
| 7/19/09 | 4 |
| 7/19/09 | 4.3 |
| 7/19/09 | 2.5 |
| 7/19/09 | 3.3 |
| 7/19/09 | 2.3 |
| 7/19/09 | 3.2 |
| 7/19/09 | 2.4 |
| 7/19/09 | 2.6 |
| 7/19/09 | 3 |
| 7/19/09 | 2.6 |
| 7/19/09 | 2.7 |
| 7/19/09 | 2.7 |
| 7/18/09 | 3.5 |
| 7/18/09 | 1.8 |
| 7/18/09 | 1.5 |
| 7/18/09 | 1.5 |
| 7/18/09 | 1.6 |
| 7/18/09 | 3.5 |
| 7/18/09 | 2.3 |
| 7/18/09 | 2.1 |
| 7/18/09 | 1.9 |
| 7/18/09 | 2 |
| 7/18/09 | 2.8 |
| 7/18/09 | 3.1 |
| 7/18/09 | 4.3 |
| 7/18/09 | 2.8 |
| 7/18/09 | 3.2 |
| 7/18/09 | 2 |
| 7/18/09 | 3.2 |
| 7/18/09 | 3.4 |
| 7/18/09 | 2.8 |
| 7/18/09 | 4.1 |
| 7/18/09 | 5.8 |
| 7/18/09 | 2.4 |
| 7/18/09 | 4.6 |
| 7/18/09 | 4.3 |
| 7/18/09 | 2.8 |
| 7/18/09 | 4.9 |
| 7/18/09 | 3.7 |
| 7/18/09 | 2.9 |
| 7/18/09 | 4.9 |
| 7/18/09 | 3.9 |
| 7/18/09 | 4.1 |
| 7/18/09 | 3 |
| 7/18/09 | 2.4 |
| 7/18/09 | 2.5 |
| 7/18/09 | 3 |
| 7/18/09 | 4.1 |
| 7/18/09 | 2.9 |
| 7/18/09 | 2.1 |
| 7/18/09 | 2.1 |
| 7/18/09 | 2.9 |
| 7/18/09 | 1.8 |
| 7/18/09 | 3.8 |
| 7/18/09 | 1.5 |
| 7/18/09 | 1.8 |
| 7/18/09 | 2.6 |
| 7/18/09 | 3.7 |
| 7/18/09 | 2.9 |
| 7/18/09 | 2.7 |
| 7/17/09 | 2.6 |
| 7/17/09 | 2.5 |
| 7/17/09 | 1.9 |
| 7/17/09 | 2.5 |
| 7/17/09 | 1.7 |
| 7/17/09 | 2.3 |
| 7/17/09 | 2.5 |
| 7/17/09 | 2.2 |
| 7/17/09 | 2.1 |
| 7/17/09 | 3.1 |
| 7/17/09 | 2.9 |
| 7/17/09 | 2 |
| 7/17/09 | 2.7 |
| 7/17/09 | 2.1 |
| 7/17/09 | 2.2 |
| 7/17/09 | 3.3 |
| 7/17/09 | 2.3 |
| 7/17/09 | 2.6 |
| 7/17/09 | 2.8 |
| 7/17/09 | 3 |
| 7/17/09 | 1.9 |
| 7/17/09 | 4.3 |
| 7/17/09 | 1.9 |
| 7/17/09 | 1.3 |
| 7/17/09 | 1.1 |
| 7/17/09 | 1.5 |
| 7/17/09 | 1.6 |
| 7/17/09 | 1.7 |
| 7/17/09 | 1.4 |
| 7/17/09 | 1.8 |
| 7/17/09 | 3.1 |
| 7/17/09 | 1.3 |
| 7/17/09 | 1.4 |
| 7/17/09 | 2 |
| 7/17/09 | 2.4 |
| 7/17/09 | 1.9 |
| 7/17/09 | 2 |
| 7/17/09 | 1.8 |
| 7/17/09 | 1.7 |
| 7/17/09 | 1.4 |
| 7/17/09 | 2.1 |
| 7/17/09 | 1.3 |
| 7/17/09 | 0.8 |
| 7/17/09 | 1.6 |
| 7/17/09 | 1.5 |
| 7/17/09 | 1.4 |
| 7/17/09 | 2.3 |
| 7/17/09 | 2 |
| 7/16/09 | 1.5 |
| 7/16/09 | 1.5 |
| 7/16/09 | 2 |
| 7/16/09 | 1.6 |
| 7/16/09 | 2.2 |
| 7/16/09 | 0.9 |
| 7/16/09 | 1.1 |
| 7/16/09 | 1.2 |
| 7/16/09 | 1.2 |
| 7/16/09 | 1.6 |
| 7/16/09 | 1.4 |
| 7/16/09 | 2.8 |
| 7/16/09 | 2 |
| 7/16/09 | 2.6 |
| 7/16/09 | 3.3 |
| 7/16/09 | 2.2 |
| 7/16/09 | 5.2 |
| 7/16/09 | 4.6 |
| 7/16/09 | 4.4 |
| 7/16/09 | 5.7 |
| 7/16/09 | 5.2 |
| 7/16/09 | 4.8 |
| 7/16/09 | 3.6 |
| 7/16/09 | 3.2 |
| 7/16/09 | 4.6 |
| 7/16/09 | 6.3 |
| 7/16/09 | 4 |
| 7/16/09 | 3.3 |
| 7/16/09 | 3.6 |
| 7/16/09 | 3.1 |
| 7/16/09 | 2.7 |
| 7/16/09 | 2.5 |
| 7/16/09 | 1.9 |
| 7/16/09 | 2.1 |
| 7/16/09 | 1.7 |
| 7/16/09 | 0.6 |
| 7/16/09 | 1.2 |
| 7/16/09 | 1.6 |
| 7/16/09 | 0.8 |
| 7/16/09 | 1.5 |
| 7/16/09 | 1.1 |
| 7/16/09 | 0.8 |
| 7/16/09 | 1.5 |
| 7/16/09 | 1.1 |
| 7/16/09 | 0.3 |
| 7/16/09 | 0.4 |
| 7/16/09 | 1.4 |
| 7/16/09 | 0.8 |
| 7/15/09 | 1.3 |
| 7/15/09 | 1 |
| 7/15/09 | 0.6 |
| 7/15/09 | 1 |
| 7/15/09 | 0.4 |
| 7/15/09 | 1.9 |
| 7/15/09 | 3.3 |
| 7/15/09 | 1.6 |
| 7/15/09 | 1.2 |
| 7/15/09 | 2.5 |
| 7/15/09 | 1.4 |
| 7/15/09 | 1.7 |
| 7/15/09 | 2 |
| 7/15/09 | 1.6 |
| 7/15/09 | 1.2 |
| 7/15/09 | 2 |
| 7/15/09 | 0.7 |
| 7/15/09 | 3.2 |
| 7/15/09 | 2 |
| 7/15/09 | 2.1 |
| 7/15/09 | 1.6 |
| 7/15/09 | 1.7 |
| 7/15/09 | 2.2 |
| 7/15/09 | 2.1 |
| 7/15/09 | 1.3 |
| 7/15/09 | 0.7 |
| 7/15/09 | 1.4 |
| 7/15/09 | 1.6 |
| 7/15/09 | 1.2 |
| 7/15/09 | 1.2 |
| 7/15/09 | 0.5 |
| 7/15/09 | 1 |
| 7/15/09 | 2.3 |
| 7/15/09 | 0.8 |
| 7/15/09 | 1.1 |
| 7/15/09 | 1.3 |
| 7/15/09 | 2.4 |
| 7/15/09 | 0.8 |
| 7/15/09 | 1.7 |
| 7/15/09 | 1.7 |
| 7/15/09 | 1.5 |
| 7/15/09 | 1.7 |
| 7/15/09 | 2.2 |
| 7/15/09 | 1.1 |
| 7/15/09 | 2.4 |
| 7/15/09 | 2 |
| 7/15/09 | 1.3 |
| 7/15/09 | 0.7 |
| 7/14/09 | 1.4 |
| 7/14/09 | 1.4 |
| 7/14/09 | 0.2 |
| 7/14/09 | 1.1 |
| 7/14/09 | 1.8 |
| 7/14/09 | 0.5 |
| 7/14/09 | 1.5 |
| 7/14/09 | 0.6 |
| 7/14/09 | 1.6 |
| 7/14/09 | 2 |
| 7/14/09 | 2.1 |
| 7/14/09 | 3.2 |
| 7/14/09 | 4.1 |
| 7/14/09 | 2.5 |
| 7/14/09 | 1.8 |
| 7/14/09 | 3.9 |
| 7/14/09 | 2 |
| 7/14/09 | 2.2 |
| 7/14/09 | 2.7 |
| 7/14/09 | 2.9 |
| 7/14/09 | 2.4 |
| 7/14/09 | 7.2 |
| 7/14/09 | 3.7 |
| 7/14/09 | 4.4 |
| 7/14/09 | 4.3 |
| 7/14/09 | 3.7 |
| 7/14/09 | 2.2 |
| 7/14/09 | 3.5 |
| 7/14/09 | 1.7 |
| 7/14/09 | 0.9 |
| 7/14/09 | 1.5 |
| 7/14/09 | 2.2 |
| 7/14/09 | 1.2 |
| 7/14/09 | 1.5 |
| 7/14/09 | 1.4 |
| 7/14/09 | 1.4 |
| 7/14/09 | 1 |
| 7/14/09 | 1 |
| 7/14/09 | 1.7 |
| 7/14/09 | 1.3 |
| 7/14/09 | 1.8 |
| 7/14/09 | 0.4 |
| 7/14/09 | 1.2 |
| 7/14/09 | 0.5 |
| 7/14/09 | 1.6 |
| 7/14/09 | 1.1 |
| 7/14/09 | 1.1 |
| 7/14/09 | -0.2 |
| 7/13/09 | 0.4 |
| 7/13/09 | 0.6 |
| 7/13/09 | 1 |
| 7/13/09 | 0.8 |
| 7/13/09 | 0.4 |
| 7/13/09 | 1 |
| 7/13/09 | 1.2 |
| 7/13/09 | 0.6 |
| 7/13/09 | 1.4 |
| 7/13/09 | 1.7 |
| 7/13/09 | 2.1 |
| 7/13/09 | 0.8 |
| 7/13/09 | 1.9 |
| 7/13/09 | 2.2 |
| 7/13/09 | 3.1 |
| 7/13/09 | 4.4 |
| 7/13/09 | 3.6 |
| 7/13/09 | 2 |
| 7/13/09 | 4.2 |
| 7/13/09 | 2.8 |
| 7/13/09 | 2.5 |
| 7/13/09 | 3.8 |
| 7/13/09 | 1.4 |
| 7/13/09 | 1 |
| 7/13/09 | 1.8 |
| 7/13/09 | 1.8 |
| 7/13/09 | 1.4 |
| 7/13/09 | 1.5 |
| 7/13/09 | 1.2 |
| 7/13/09 | 1 |
| 7/13/09 | 0.4 |
| 7/13/09 | 0.9 |
| 7/13/09 | 0.9 |
| 7/13/09 | 0.1 |
| 7/13/09 | 1 |
| 7/13/09 | 1.2 |
| 7/13/09 | 1.6 |
| 7/13/09 | 0.1 |
| 7/13/09 | 0.3 |
| 7/13/09 | 0.5 |
| 7/13/09 | 1.1 |
| 7/13/09 | 1.6 |
| 7/13/09 | 0.8 |
| 7/13/09 | 0.6 |
| 7/13/09 | 0.7 |
| 7/13/09 | 0.4 |
| 7/13/09 | 1 |
| 7/13/09 | 1.9 |
| 7/12/09 | 0.9 |
| 7/12/09 | 0.4 |
| 7/12/09 | 0.7 |
| 7/12/09 | 0.4 |
| 7/12/09 | 0.7 |
| 7/12/09 | 0.4 |
| 7/12/09 | 0.7 |
| 7/12/09 | 0.2 |
| 7/12/09 | 1.1 |
| 7/12/09 | 1.7 |
| 7/12/09 | 1.1 |
| 7/12/09 | 1.4 |
| 7/12/09 | 0.7 |
| 7/12/09 | 1.5 |
| 7/12/09 | 2 |
| 7/12/09 | 2.2 |
| 7/12/09 | 2.8 |
| 7/12/09 | 2.6 |
| 7/12/09 | 2 |
| 7/12/09 | 4 |
| 7/12/09 | 1.6 |
| 7/12/09 | -0.2 |
| 7/12/09 | 3.7 |
| 7/12/09 | 2.5 |
| 7/12/09 | 0.6 |
| 7/12/09 | 1.3 |
| 7/12/09 | 0.7 |
| 7/12/09 | 1.7 |
| 7/12/09 | 2.2 |
| 7/12/09 | 0.7 |
| 7/12/09 | 0.8 |
| 7/12/09 | 0.8 |
| 7/12/09 | 0.4 |
| 7/12/09 | 1.1 |
| 7/12/09 | 1.2 |
| 7/12/09 | 1 |
| 7/12/09 | 0 |
| 7/12/09 | 1.2 |
| 7/12/09 | 0.7 |
| 7/12/09 | 0.7 |
| 7/12/09 | 1.2 |
| 7/12/09 | 0.4 |
| 7/12/09 | 0.7 |
| 7/12/09 | 0.5 |
| 7/12/09 | 1.2 |
| 7/12/09 | 0.5 |
| 7/12/09 | 1 |
| 7/12/09 | 0.1 |
| 7/11/09 | 0.3 |
| 7/11/09 | 3.5 |
| 7/11/09 | 1.9 |
| 7/11/09 | 1.4 |
| 7/11/09 | 3.2 |
| 7/11/09 | 1.8 |
| 7/11/09 | 2 |
| 7/11/09 | 2.2 |
| 7/11/09 | 3.9 |
| 7/11/09 | 3.2 |
| 7/11/09 | 2.8 |
| 7/11/09 | 3 |
| 7/11/09 | 2 |
| 7/11/09 | 3.2 |
| 7/11/09 | 3.2 |
| 7/11/09 | 2 |
| 7/11/09 | 2.3 |
| 7/11/09 | 2.6 |
| 7/11/09 | 1.2 |
| 7/11/09 | 2.1 |
| 7/11/09 | 0.9 |
| 7/11/09 | 1.3 |
| 7/11/09 | 1.7 |
| 7/11/09 | 1.1 |
| 7/11/09 | 1.3 |
| 7/11/09 | 0.7 |
| 7/11/09 | 1.6 |
| 7/11/09 | 0.8 |
| 7/11/09 | -0.2 |
| 7/11/09 | -0.2 |
| 7/11/09 | 0.8 |
| 7/11/09 | 0.6 |
| 7/11/09 | 0.1 |
| 7/11/09 | 0 |
| 7/11/09 | 0.7 |
| 7/11/09 | 1.4 |
| 7/11/09 | 1.3 |
| 7/11/09 | 1 |
| 7/11/09 | 1.9 |
| 7/11/09 | 0.4 |
| 7/11/09 | 0.6 |
| 7/11/09 | 0 |
| 7/11/09 | 0.8 |
| 7/11/09 | -0.2 |
| 7/11/09 | 0 |
| 7/11/09 | 0.7 |
| 7/11/09 | 0.2 |
| 7/11/09 | -0.4 |
| 7/10/09 | 0.6 |
| 7/10/09 | -0.4 |
| 7/10/09 | 0.8 |
| 7/10/09 | 0.9 |
| 7/10/09 | 0.7 |
| 7/10/09 | 0.8 |
| 7/10/09 | 0.7 |
| 7/10/09 | 0.2 |
| 7/10/09 | 1.1 |
| 7/10/09 | 1.6 |
| 7/10/09 | 1 |
| 7/10/09 | 1 |
| 7/10/09 | 0.7 |
| 7/10/09 | 1.2 |
| 7/10/09 | 1.2 |
| 7/10/09 | 2.1 |
| 7/10/09 | 1.3 |
| 7/10/09 | 1.5 |
| 7/10/09 | 0.7 |
| 7/10/09 | 1.6 |
| 7/10/09 | 1.2 |
| 7/10/09 | 1.4 |
| 7/10/09 | 1 |
| 7/10/09 | 2.4 |
| 7/10/09 | 2.2 |
| 7/10/09 | 1.8 |
| 7/10/09 | 0.9 |
| 7/10/09 | 2 |
| 7/10/09 | 1.1 |
| 7/10/09 | 1.4 |
| 7/10/09 | 0.7 |
| 7/10/09 | 0.9 |
| 7/10/09 | 0.7 |
| 7/10/09 | 1.6 |
| 7/10/09 | 0.5 |
| 7/10/09 | 1.7 |
| 7/10/09 | 1 |
| 7/10/09 | 0.8 |
| 7/10/09 | 0.6 |
| 7/10/09 | 0.5 |
| 7/10/09 | 1.2 |
| 7/10/09 | 1.7 |
| 7/10/09 | 1.1 |
| 7/10/09 | 1.3 |
| 7/10/09 | 0.7 |
| 7/10/09 | 0.8 |
| 7/10/09 | 0.3 |
| 7/10/09 | 0.3 |
| 7/9/09 | 1.5 |
| 7/9/09 | 1.3 |
| 7/9/09 | 1 |
| 7/9/09 | 0.9 |
| 7/9/09 | 0.7 |
| 7/9/09 | 1 |
| 7/9/09 | 1.5 |
| 7/9/09 | 0.5 |
| 7/9/09 | 0.7 |
| 7/9/09 | 1.5 |
| 7/9/09 | 0.9 |
| 7/9/09 | 1.4 |
| 7/9/09 | 1.2 |
| 7/9/09 | 1.1 |
| 7/9/09 | 1.4 |
| 7/9/09 | 1.4 |
| 7/9/09 | 0.7 |
| 7/9/09 | 1.2 |
| 7/9/09 | 2.6 |
| 7/9/09 | 3 |
| 7/9/09 | 2.5 |
| 7/9/09 | 3.6 |
| 7/9/09 | 3.3 |
| 7/9/09 | 3.7 |
| 7/9/09 | 3.4 |
| 7/9/09 | 4.1 |
| 7/9/09 | 1.5 |
| 7/9/09 | 4.3 |
| 7/9/09 | 1.7 |
| 7/9/09 | 2.2 |
| 7/9/09 | 2.1 |
| 7/9/09 | 1.7 |
| 7/9/09 | 2.8 |
| 7/9/09 | 3.1 |
| 7/9/09 | 2.3 |
| 7/9/09 | 2.6 |
| 7/9/09 | 3.1 |
| 7/9/09 | 2.2 |
| 7/9/09 | 2.3 |
| 7/9/09 | 1.5 |
| 7/9/09 | 1.1 |
| 7/9/09 | 2.4 |
| 7/9/09 | 1.4 |
| 7/9/09 | 3.1 |
| 7/9/09 | 1.9 |
| 7/9/09 | 1.7 |
| 7/9/09 | 2.1 |
| 7/9/09 | 0.9 |
| 7/8/09 | 2.5 |
| 7/8/09 | 0.9 |
| 7/8/09 | 2.1 |
| 7/8/09 | 1.3 |
| 7/8/09 | 1.6 |
| 7/8/09 | 2.1 |
| 7/8/09 | 1.6 |
| 7/8/09 | 1.5 |
| 7/8/09 | 2 |
| 7/8/09 | 0.6 |
| 7/8/09 | 2.1 |
| 7/8/09 | 2.9 |
| 7/8/09 | 1.7 |
| 7/8/09 | 6 |
| 7/8/09 | 3.6 |
| 7/8/09 | 8.5 |
| 7/8/09 | 6.8 |
| 7/8/09 | 4.4 |
| 7/8/09 | 6.8 |
| 7/8/09 | 5.1 |
| 7/8/09 | 9.6 |
| 7/8/09 | 10.4 |
| 7/8/09 | 5.5 |
| 7/8/09 | 5.6 |
| 7/8/09 | 1.7 |
| 7/8/09 | 1.9 |
| 7/8/09 | 5.5 |
| 7/8/09 | 4.1 |
| 7/8/09 | 5.3 |
| 7/8/09 | 1.4 |
| 7/8/09 | 2 |
| 7/8/09 | 1.8 |
| 7/8/09 | 3.4 |
| 7/8/09 | 2.7 |
| 7/8/09 | 2.2 |
| 7/8/09 | 2.4 |
| 7/8/09 | 2.4 |
| 7/8/09 | 1.6 |
| 7/8/09 | 1.5 |
| 7/8/09 | 1.4 |
| 7/8/09 | 1.1 |
| 7/8/09 | 3.3 |
| 7/8/09 | 1.6 |
| 7/8/09 | 1.7 |
| 7/8/09 | 1.6 |
| 7/8/09 | 1.8 |
| 7/8/09 | 2.4 |
| 7/8/09 | 1.4 |
| 7/7/09 | 2.4 |
| 7/7/09 | 1.8 |
| 7/7/09 | 2.8 |
| 7/7/09 | 4.9 |
| 7/7/09 | 6.1 |
| 7/7/09 | 6.5 |
| 7/7/09 | 2.2 |
| 7/7/09 | 3.2 |
| 7/7/09 | 5.5 |
| 7/7/09 | 5.5 |
| 7/7/09 | 4.4 |
| 7/7/09 | 6.6 |
| 7/7/09 | 7.5 |
| 7/7/09 | 7.2 |
| 7/7/09 | 4.4 |
| 7/7/09 | 7.1 |
| 7/7/09 | 5.2 |
| 7/7/09 | 7.5 |
| 7/7/09 | 5.7 |
| 7/7/09 | 6.6 |
| 7/7/09 | 7.8 |
| 7/7/09 | 7.6 |
| 7/7/09 | 6.9 |
| 7/7/09 | 7 |
| 7/7/09 | 6.4 |
| 7/7/09 | 6.1 |
| 7/7/09 | 8.8 |
| 7/7/09 | 6.7 |
| 7/7/09 | 6.9 |
| 7/7/09 | 4 |
| 7/7/09 | 1.4 |
| 7/7/09 | 3 |
| 7/7/09 | 2.6 |
| 7/7/09 | 2.7 |
| 7/7/09 | 3.4 |
| 7/7/09 | 2.2 |
| 7/7/09 | 4.5 |
| 7/7/09 | 2.8 |
| 7/7/09 | 4.7 |
| 7/7/09 | 1.5 |
| 7/7/09 | 2.3 |
| 7/7/09 | 4 |
| 7/7/09 | 2.2 |
| 7/7/09 | 5.1 |
| 7/7/09 | 3.2 |
| 7/7/09 | 5.5 |
| 7/7/09 | 2.4 |
| 7/7/09 | 3.9 |
| 7/6/09 | 2 |
| 7/6/09 | 2.7 |
| 7/6/09 | 3.1 |
| 7/6/09 | 2.7 |
| 7/6/09 | 6.6 |
| 7/6/09 | 4.1 |
| 7/6/09 | 2 |
| 7/6/09 | 2.4 |
| 7/6/09 | 1.5 |
| 7/6/09 | 1 |
| 7/6/09 | 1.6 |
| 7/6/09 | 6.6 |
| 7/6/09 | 4.6 |
| 7/6/09 | 5.9 |
| 7/6/09 | 5.4 |
| 7/6/09 | 3.8 |
| 7/6/09 | 6 |
| 7/6/09 | 6.9 |
| 7/6/09 | 8.8 |
| 7/6/09 | 5.4 |
| 7/6/09 | 6.6 |
| 7/6/09 | 2.9 |
| 7/6/09 | 5.1 |
| 7/6/09 | 2.7 |
| 7/6/09 | 1.6 |
| 7/6/09 | 4.8 |
| 7/6/09 | 2.1 |
| 7/6/09 | 2.3 |
| 7/6/09 | 1.9 |
| 7/6/09 | 2.9 |
| 7/6/09 | 1.4 |
| 7/6/09 | 2.2 |
| 7/6/09 | 2.3 |
| 7/6/09 | 1.9 |
| 7/6/09 | 1.6 |
| 7/6/09 | 4 |
| 7/6/09 | 2.6 |
| 7/6/09 | 1.6 |
| 7/6/09 | 2.7 |
| 7/6/09 | 1.6 |
| 7/6/09 | 1.7 |
| 7/6/09 | 0.4 |
| 7/6/09 | 1.9 |
| 7/6/09 | 2.1 |
| 7/6/09 | 1.1 |
| 7/6/09 | 3.5 |
| 7/6/09 | 2.2 |
| 7/6/09 | 2.1 |
| 7/5/09 | 1.4 |
| 7/5/09 | 1.8 |
| 7/5/09 | 0.4 |
| 7/5/09 | 1.2 |
| 7/5/09 | 2.8 |
| 7/5/09 | 0.9 |
| 7/5/09 | 1.9 |
| 7/5/09 | 1.9 |
| 7/5/09 | 1.6 |
| 7/5/09 | 1.6 |
| 7/5/09 | 2.4 |
| 7/5/09 | 8.3 |
| 7/5/09 | 4.1 |
| 7/5/09 | 1.7 |
| 7/5/09 | 5.9 |
| 7/5/09 | 4.6 |
| 7/5/09 | 7.4 |
| 7/5/09 | 3 |
| 7/5/09 | 3.7 |
| 7/5/09 | 3.5 |
| 7/5/09 | 2.4 |
| 7/5/09 | 4.4 |
| 7/5/09 | 5 |
| 7/5/09 | 5 |
| 7/5/09 | 3.2 |
| 7/5/09 | 2.7 |
| 7/5/09 | 2.4 |
| 7/5/09 | 2.6 |
| 7/5/09 | 2.7 |
| 7/5/09 | 1.9 |
| 7/5/09 | 1.6 |
| 7/5/09 | 3.8 |
| 7/5/09 | 2.7 |
| 7/5/09 | 2.6 |
| 7/5/09 | 2.1 |
| 7/5/09 | 3.6 |
| 7/5/09 | 3.2 |
| 7/5/09 | 2.4 |
| 7/5/09 | 2.5 |
| 7/5/09 | 2.5 |
| 7/5/09 | 1.5 |
| 7/5/09 | 1.2 |
| 7/5/09 | 1.5 |
| 7/5/09 | 2.9 |
| 7/5/09 | 1.1 |
| 7/5/09 | 0.3 |
| 7/5/09 | 2.3 |
| 7/5/09 | 3.7 |
| 7/4/09 | 6.3 |
| 7/4/09 | 2.9 |
| 7/4/09 | 2.9 |
| 7/4/09 | 5.8 |
| 7/4/09 | 11.4 |
| 7/4/09 | 10.5 |
| 7/4/09 | 9 |
| 7/4/09 | 2.3 |
| 7/4/09 | 4.6 |
| 7/4/09 | 5.8 |
| 7/4/09 | 4.8 |
| 7/4/09 | 7.5 |
| 7/4/09 | 4.6 |
| 7/4/09 | 5.1 |
| 7/4/09 | 7.2 |
| 7/4/09 | 10.5 |
| 7/4/09 | 9 |
| 7/4/09 | 7.4 |
| 7/4/09 | 8.9 |
| 7/4/09 | 6.6 |
| 7/4/09 | 8.8 |
| 7/4/09 | 10.2 |
| 7/4/09 | 8.8 |
| 7/4/09 | 7.3 |
| 7/4/09 | 4.2 |
| 7/4/09 | 5.2 |
| 7/4/09 | 5.8 |
| 7/4/09 | 6.5 |
| 7/4/09 | 2.1 |
| 7/4/09 | 1.6 |
| 7/4/09 | 1.6 |
| 7/4/09 | 0.8 |
| 7/4/09 | 1.4 |
| 7/4/09 | 1.9 |
| 7/4/09 | 2 |
| 7/4/09 | 2.7 |
| 7/4/09 | 2.4 |
| 7/4/09 | 1.3 |
| 7/4/09 | 2.2 |
| 7/4/09 | 2.2 |
| 7/4/09 | 1.2 |
| 7/4/09 | 1.5 |
| 7/4/09 | 1.2 |
| 7/4/09 | 1.2 |
| 7/4/09 | 2 |
| 7/4/09 | 2.7 |
| 7/4/09 | 2.1 |
| 7/4/09 | 0.9 |
| 7/3/09 | 2 |
| 7/3/09 | 4.7 |
| 7/3/09 | 6.5 |
| 7/3/09 | 2.2 |
| 7/3/09 | 3.5 |
| 7/3/09 | 2.8 |
| 7/3/09 | 10.5 |
| 7/3/09 | 6.7 |
| 7/3/09 | 5.8 |
| 7/3/09 | 5.9 |
| 7/3/09 | 5.2 |
| 7/3/09 | 6.2 |
| 7/3/09 | 5.7 |
| 7/3/09 | 4.9 |
| 7/3/09 | 5.3 |
| 7/3/09 | 4.8 |
| 7/3/09 | 9.4 |
| 7/3/09 | 6.3 |
| 7/3/09 | 5.8 |
| 7/3/09 | 8.5 |
| 7/3/09 | 8.3 |
| 7/3/09 | 7.4 |
| 7/3/09 | 6.2 |
| 7/3/09 | 6.3 |
| 7/3/09 | 6.3 |
| 7/3/09 | 4.2 |
| 7/3/09 | 4 |
| 7/3/09 | 5.2 |
| 7/3/09 | 4.5 |
| 7/3/09 | 5.1 |
| 7/3/09 | 4.4 |
| 7/3/09 | 5.7 |
| 7/3/09 | 3.1 |
| 7/3/09 | 3.2 |
| 7/3/09 | 3.2 |
| 7/3/09 | 2.6 |
| 7/3/09 | 3.8 |
| 7/3/09 | 2.6 |
| 7/3/09 | 1.7 |
| 7/3/09 | 2.8 |
| 7/3/09 | 2.9 |
| 7/3/09 | 3 |
| 7/3/09 | 3.6 |
| 7/3/09 | 2 |
| 7/3/09 | 1.4 |
| 7/3/09 | 2.3 |
| 7/3/09 | 2.7 |
| 7/3/09 | 2.4 |
| 7/2/09 | 2.2 |
| 7/2/09 | 2.5 |
| 7/2/09 | 1.6 |
| 7/2/09 | 1.3 |
| 7/2/09 | 1.2 |
| 7/2/09 | 1.9 |
| 7/2/09 | 2.3 |
| 7/2/09 | 3.3 |
| 7/2/09 | 4.3 |
| 7/2/09 | 2.1 |
| 7/2/09 | 3.4 |
| 7/2/09 | 5.1 |
| 7/2/09 | 3.1 |
| 7/2/09 | 8 |
| 7/2/09 | 2 |
| 7/2/09 | 3 |
| 7/2/09 | 7.2 |
| 7/2/09 | 5.1 |
| 7/2/09 | 6 |
| 7/2/09 | 6.4 |
| 7/2/09 | 6.4 |
| 7/2/09 | 7.1 |
| 7/2/09 | 2.6 |
| 7/2/09 | 2.4 |
| 7/2/09 | 3.2 |
| 7/2/09 | 2.7 |
| 7/2/09 | 2.8 |
| 7/2/09 | 4.8 |
| 7/2/09 | 3.2 |
| 7/2/09 | 2.4 |
| 7/2/09 | 2.6 |
| 7/2/09 | 2.6 |
| 7/2/09 | 2.9 |
| 7/2/09 | 3.4 |
| 7/2/09 | 2.4 |
| 7/2/09 | 2.3 |
| 7/2/09 | 1.5 |
| 7/2/09 | 1.8 |
| 7/2/09 | 1.8 |
| 7/2/09 | 2.5 |
| 7/2/09 | 1.9 |
| 7/2/09 | 2.5 |
| 7/2/09 | 1.7 |
| 7/2/09 | 1.5 |
| 7/2/09 | 1.8 |
| 7/2/09 | 1.5 |
| 7/2/09 | 3 |
| 7/2/09 | 1.2 |
| 7/1/09 | 2 |
| 7/1/09 | 2.4 |
| 7/1/09 | 2.8 |
| 7/1/09 | 1.1 |
| 7/1/09 | 1.8 |
| 7/1/09 | 4.3 |
| 7/1/09 | 1.7 |
| 7/1/09 | 4.6 |
| 7/1/09 | 1.4 |
| 7/1/09 | 1.8 |
| 7/1/09 | 1.5 |
| 7/1/09 | 4.5 |
| 7/1/09 | 1.3 |
| 7/1/09 | 2.5 |
| 7/1/09 | 1.3 |
| 7/1/09 | 1.3 |
| 7/1/09 | 4.2 |
| 7/1/09 | 3.6 |
| 7/1/09 | 2.3 |
| 7/1/09 | 4.2 |
| 7/1/09 | 2.3 |
| 7/1/09 | 3.1 |
| 7/1/09 | 2.4 |
| 7/1/09 | 1.4 |
| 7/1/09 | 4.4 |
| 7/1/09 | 2.7 |
| 7/1/09 | 1.8 |
| 7/1/09 | 4.3 |
| 7/1/09 | 2.6 |
| 7/1/09 | 1.1 |
| 7/1/09 | 2.3 |
| 7/1/09 | 4.6 |
| 7/1/09 | 3.7 |
| 7/1/09 | 2.9 |
| 7/1/09 | 1.9 |
| 7/1/09 | 3.6 |
| 7/1/09 | 1.7 |
| 7/1/09 | 1.1 |
| 7/1/09 | 1.5 |
| 7/1/09 | 3.8 |
| 7/1/09 | 3.4 |
| 7/1/09 | 3.1 |
| 7/1/09 | 1.2 |
| 7/1/09 | 1.8 |
| 7/1/09 | 3.2 |
| 7/1/09 | 3.4 |
| 7/1/09 | 2.9 |
| 7/1/09 | 3.8 |
| 6/30/09 | 2.6 |
| 6/30/09 | 3.8 |
| 6/30/09 | 3.4 |
| 6/30/09 | 2.5 |
| 6/30/09 | 2.6 |
| 6/30/09 | 6.2 |
| 6/30/09 | 2.4 |
| 6/30/09 | 2.4 |
| 6/30/09 | 2.9 |
| 6/30/09 | 4.7 |
| 6/30/09 | 2.2 |
| 6/30/09 | 2.2 |
| 6/30/09 | 4.6 |
| 6/30/09 | 2.8 |
| 6/30/09 | 3.6 |
| 6/30/09 | 3.5 |
| 6/30/09 | 2.3 |
| 6/30/09 | 1.9 |
| 6/30/09 | 2.2 |
| 6/30/09 | 3.2 |
| 6/30/09 | 2.5 |
| 6/30/09 | 3.4 |
| 6/30/09 | 5.4 |
| 6/30/09 | 4.6 |
| 6/30/09 | 5.1 |
| 6/30/09 | 4.3 |
| 6/30/09 | 4.1 |
| 6/30/09 | 2.2 |
| 6/30/09 | 3.3 |
| 6/30/09 | 2.6 |
| 6/30/09 | 4.5 |
| 6/30/09 | 1 |
| 6/30/09 | 4 |
| 6/30/09 | 2.8 |
| 6/30/09 | 3.3 |
| 6/30/09 | 3.6 |
| 6/30/09 | 2.3 |
| 6/30/09 | 3.1 |
| 6/30/09 | 2.5 |
| 6/30/09 | 4.6 |
| 6/30/09 | 4.3 |
| 6/30/09 | 3.1 |
| 6/30/09 | 4 |
| 6/30/09 | 4.2 |
| 6/30/09 | 3.4 |
| 6/30/09 | 9.5 |
| 6/30/09 | 3.5 |
| 6/30/09 | 5.9 |
| 6/29/09 | 3.1 |
| 6/29/09 | 3.2 |
| 6/29/09 | 6.1 |
| 6/29/09 | 4.1 |
| 6/29/09 | 5 |
| 6/29/09 | 8.5 |
| 6/29/09 | 3.2 |
| 6/29/09 | 4.5 |
| 6/29/09 | 5.3 |
| 6/29/09 | 8.2 |
| 6/29/09 | 9 |
| 6/29/09 | 6.6 |
| 6/29/09 | 6 |
| 6/29/09 | 6.2 |
| 6/29/09 | 4.3 |
| 6/29/09 | 5.9 |
| 6/29/09 | 7.7 |
| 6/29/09 | 6.3 |
| 6/29/09 | 10.4 |
| 6/29/09 | 9.5 |
| 6/29/09 | 7.1 |
| 6/29/09 | 10.1 |
| 6/29/09 | 6.3 |
| 6/29/09 | 7.6 |
| 6/29/09 | 6.4 |
| 6/29/09 | 4.8 |
| 6/29/09 | 7.3 |
| 6/29/09 | 2.4 |
| 6/29/09 | 4 |
| 6/29/09 | 5.7 |
| 6/29/09 | 1.5 |
| 6/29/09 | 2.4 |
| 6/29/09 | 2.5 |
| 6/29/09 | 8.4 |
| 6/29/09 | 3.4 |
| 6/29/09 | 6.6 |
| 6/29/09 | 3.5 |
| 6/29/09 | 2.4 |
| 6/29/09 | 2.2 |
| 6/29/09 | 2.7 |
| 6/29/09 | 2.3 |
| 6/29/09 | 2.5 |
| 6/29/09 | 3.2 |
| 6/29/09 | 2.7 |
| 6/29/09 | 3.4 |
| 6/29/09 | 2.5 |
| 6/29/09 | 2.9 |
| 6/29/09 | 2.2 |
| 6/28/09 | 2.7 |
| 6/28/09 | 3.4 |
| 6/28/09 | 3.9 |
| 6/28/09 | 3 |
| 6/28/09 | 3.8 |
| 6/28/09 | 2.7 |
| 6/28/09 | 2.1 |
| 6/28/09 | 5.3 |
| 6/28/09 | 6 |
| 6/28/09 | 6.2 |
| 6/28/09 | 3.3 |
| 6/28/09 | 5.4 |
| 6/28/09 | 10.5 |
| 6/28/09 | 11.6 |
| 6/28/09 | 8.1 |
| 6/28/09 | 5.4 |
| 6/28/09 | 4 |
| 6/28/09 | 7.6 |
| 6/28/09 | 7.3 |
| 6/28/09 | 3.9 |
| 6/28/09 | 2.8 |
| 6/28/09 | 7.7 |
| 6/28/09 | 9.1 |
| 6/28/09 | 2.3 |
| 6/28/09 | 3 |
| 6/28/09 | 3.1 |
| 6/28/09 | 5.5 |
| 6/28/09 | 2.2 |
| 6/28/09 | 2 |
| 6/28/09 | 3.8 |
| 6/28/09 | 3.3 |
| 6/28/09 | 2.4 |
| 6/28/09 | 2.6 |
| 6/28/09 | 3.1 |
| 6/28/09 | 2.1 |
| 6/28/09 | 2.1 |
| 6/28/09 | 1.8 |
| 6/28/09 | 3.4 |
| 6/28/09 | 1.4 |
| 6/28/09 | 3.6 |
| 6/28/09 | 5.1 |
| 6/28/09 | 4 |
| 6/28/09 | 1.8 |
| 6/28/09 | 2.4 |
| 6/28/09 | 3.8 |
| 6/28/09 | 2.2 |
| 6/28/09 | 1.6 |
| 6/28/09 | 2 |
| 6/27/09 | 2.8 |
| 6/27/09 | 10.9 |
| 6/27/09 | 14.2 |
| 6/27/09 | 7.7 |
| 6/27/09 | 7.2 |
| 6/27/09 | 8.2 |
| 6/27/09 | 5.7 |
| 6/27/09 | 2.4 |
| 6/27/09 | 2.7 |
| 6/27/09 | 3.5 |
| 6/27/09 | 1.5 |
| 6/27/09 | 3 |
| 6/27/09 | 3.3 |
| 6/27/09 | 6.5 |
| 6/27/09 | 7.9 |
| 6/27/09 | 3.4 |
| 6/27/09 | 9.7 |
| 6/27/09 | 7.9 |
| 6/27/09 | 7.7 |
| 6/27/09 | 7.1 |
| 6/27/09 | 5.7 |
| 6/27/09 | 8 |
| 6/27/09 | 7.2 |
| 6/27/09 | 6 |
| 6/27/09 | 6.8 |
| 6/27/09 | 3.7 |
| 6/27/09 | 5.5 |
| 6/27/09 | 5.5 |
| 6/27/09 | 4.1 |
| 6/27/09 | 3.6 |
| 6/27/09 | 3.1 |
| 6/27/09 | 3.3 |
| 6/27/09 | 6.3 |
| 6/27/09 | 3.1 |
| 6/27/09 | 5.6 |
| 6/27/09 | 3.3 |
| 6/27/09 | 2.8 |
| 6/27/09 | 2.8 |
| 6/27/09 | 3.1 |
| 6/27/09 | 2.9 |
| 6/27/09 | 2.1 |
| 6/27/09 | 2.8 |
| 6/27/09 | 4.1 |
| 6/27/09 | 2.6 |
| 6/27/09 | 3 |
| 6/27/09 | 3 |
| 6/27/09 | 3.2 |
| 6/27/09 | 5.7 |
| 6/26/09 | 2.2 |
| 6/26/09 | 4.5 |
| 6/26/09 | 5.2 |
| 6/26/09 | 4.4 |
| 6/26/09 | 4.5 |
| 6/26/09 | 6 |
| 6/26/09 | 8.1 |
| 6/26/09 | 5.2 |
| 6/26/09 | 9.3 |
| 6/26/09 | 7.1 |
| 6/26/09 | 8.2 |
| 6/26/09 | 5.9 |
| 6/26/09 | 6.4 |
| 6/26/09 | 6.4 |
| 6/26/09 | 7.6 |
| 6/26/09 | 7.5 |
| 6/26/09 | 4.6 |
| 6/26/09 | 6.9 |
| 6/26/09 | 5.6 |
| 6/26/09 | 10 |
| 6/26/09 | 11.8 |
| 6/26/09 | 6.9 |
| 6/26/09 | 4.3 |
| 6/26/09 | 3.4 |
| 6/26/09 | 6.8 |
| 6/26/09 | 2.2 |
| 6/26/09 | 1.4 |
| 6/26/09 | 2.1 |
| 6/26/09 | 1.9 |
| 6/26/09 | 1.2 |
| 6/26/09 | 2 |
| 6/26/09 | 1 |
| 6/26/09 | 1.3 |
| 6/26/09 | 0.5 |
| 6/26/09 | 1.5 |
| 6/26/09 | 2.3 |
| 6/26/09 | 1.2 |
| 6/26/09 | 6.3 |
| 6/26/09 | 2.3 |
| 6/26/09 | 2.8 |
| 6/26/09 | 2.4 |
| 6/26/09 | 3.4 |
| 6/26/09 | 3.3 |
| 6/26/09 | 3 |
| 6/26/09 | 4.2 |
| 6/26/09 | 1.7 |
| 6/26/09 | 1 |
| 6/25/09 | 2.5 |
| 6/25/09 | 7.9 |
| 6/25/09 | 6.4 |
| 6/25/09 | 4.2 |
| 6/25/09 | 6.2 |
| 6/25/09 | 3 |
| 6/25/09 | 2.6 |
| 6/25/09 | 2.9 |
| 6/25/09 | 1.7 |
| 6/25/09 | 1.7 |
| 6/25/09 | 1.8 |
| 6/25/09 | 1.9 |
| 6/25/09 | 0.9 |
| 6/25/09 | 1.8 |
| 6/25/09 | 1.5 |
| 6/25/09 | 1.5 |
| 6/25/09 | 1.3 |
| 6/25/09 | 2.1 |
| 6/25/09 | 1.6 |
| 6/25/09 | 1.7 |
| 6/25/09 | 3.8 |
| 6/25/09 | 2.8 |
| 6/25/09 | 2 |
| 6/25/09 | 1.3 |
| 6/25/09 | 2.7 |
| 6/25/09 | 2.1 |
| 6/25/09 | 2.8 |
| 6/25/09 | 1.6 |
| 6/25/09 | 1.1 |
| 6/25/09 | 0.8 |
| 6/25/09 | 1 |
| 6/25/09 | 2.5 |
| 6/25/09 | 2.5 |
| 6/25/09 | 4.1 |
| 6/25/09 | 2.9 |
| 6/25/09 | 3.6 |
| 6/25/09 | 2.7 |
| 6/25/09 | 1.7 |
| 6/25/09 | 1.3 |
| 6/25/09 | 2 |
| 6/25/09 | 0.7 |
| 6/25/09 | 2.4 |
| 6/25/09 | 1.4 |
| 6/25/09 | 0.8 |
| 6/25/09 | 2.2 |
| 6/25/09 | 1.3 |
| 6/25/09 | 1.5 |
| 6/25/09 | 7 |
| 6/24/09 | 5.7 |
| 6/24/09 | 3.8 |
| 6/24/09 | 1 |
| 6/24/09 | 1.4 |
| 6/24/09 | 1.9 |
| 6/24/09 | 2.7 |
| 6/24/09 | 3.9 |
| 6/24/09 | 4.9 |
| 6/24/09 | 3.9 |
| 6/24/09 | 3.1 |
| 6/24/09 | 1.9 |
| 6/24/09 | 3.8 |
| 6/24/09 | 3.3 |
| 6/24/09 | 2.8 |
| 6/24/09 | 1.4 |
| 6/24/09 | 3 |
| 6/24/09 | 3.6 |
| 6/24/09 | 2.1 |
| 6/24/09 | 4 |
| 6/24/09 | 2.6 |
| 6/24/09 | 4.5 |
| 6/24/09 | 1.8 |
| 6/24/09 | 2.3 |
| 6/24/09 | 1.4 |
| 6/24/09 | 1.9 |
| 6/24/09 | 1.6 |
| 6/24/09 | 2.3 |
| 6/24/09 | 1.9 |
| 6/24/09 | 3 |
| 6/24/09 | 2.4 |
| 6/24/09 | 1.9 |
| 6/24/09 | 2.2 |
| 6/24/09 | 4 |
| 6/24/09 | 5.2 |
| 6/24/09 | 8.4 |
| 6/24/09 | 5.6 |
| 6/24/09 | 3.2 |
| 6/24/09 | 3 |
| 6/24/09 | 3.5 |
| 6/24/09 | 4 |
| 6/24/09 | 2.8 |
| 6/24/09 | 2.5 |
| 6/24/09 | 6.9 |
| 6/24/09 | 2.2 |
| 6/24/09 | 2.3 |
| 6/24/09 | 3.7 |
| 6/24/09 | 4.9 |
| 6/24/09 | 1.4 |
| 6/23/09 | 1.5 |
| 6/23/09 | 1.7 |
| 6/23/09 | 2.1 |
| 6/23/09 | 6.8 |
| 6/23/09 | 3.2 |
| 6/23/09 | 3.8 |
| 6/23/09 | 2.5 |
| 6/23/09 | 4.8 |
| 6/23/09 | 3.5 |
| 6/23/09 | 5.7 |
| 6/23/09 | 3.3 |
| 6/23/09 | 2 |
| 6/23/09 | 2.6 |
| 6/23/09 | 4.4 |
| 6/23/09 | 4.4 |
| 6/23/09 | 3.6 |
| 6/23/09 | 3.7 |
| 6/23/09 | 5.3 |
| 6/23/09 | 5.8 |
| 6/23/09 | 5.1 |
| 6/23/09 | 2.1 |
| 6/23/09 | 4.9 |
| 6/23/09 | 4.4 |
| 6/23/09 | 4 |
| 6/23/09 | 3.3 |
| 6/23/09 | 4.9 |
| 6/23/09 | 4.9 |
| 6/23/09 | 4.9 |
| 6/23/09 | 2.9 |
| 6/23/09 | 2.1 |
| 6/23/09 | 3.5 |
| 6/23/09 | 3.6 |
| 6/23/09 | 4.2 |
| 6/23/09 | 3.7 |
| 6/23/09 | 6.2 |
| 6/23/09 | 7.3 |
| 6/23/09 | 2.9 |
| 6/23/09 | 3.6 |
| 6/23/09 | 3.2 |
| 6/23/09 | 5.8 |
| 6/23/09 | 5.6 |
| 6/23/09 | 4.4 |
| 6/23/09 | 7.6 |
| 6/23/09 | 7.2 |
| 6/23/09 | 5.7 |
| 6/23/09 | 6.2 |
| 6/23/09 | 6.6 |
| 6/23/09 | 7.5 |
| 6/22/09 | 6.8 |
| 6/22/09 | 7.6 |
| 6/22/09 | 4.1 |
| 6/22/09 | 6 |
| 6/22/09 | 7.3 |
| 6/22/09 | 3.8 |
| 6/22/09 | 6.2 |
| 6/22/09 | 6.2 |
| 6/22/09 | 5.8 |
| 6/22/09 | 3.1 |
| 6/22/09 | 8.1 |
| 6/22/09 | 4.3 |
| 6/22/09 | 5.1 |
| 6/22/09 | 6.8 |
| 6/22/09 | 5.1 |
| 6/22/09 | 4.3 |
| 6/22/09 | 4.9 |
| 6/22/09 | 6.1 |
| 6/22/09 | 4.2 |
| 6/22/09 | 8 |
| 6/22/09 | 5.9 |
| 6/22/09 | 8.3 |
| 6/22/09 | 4.6 |
| 6/22/09 | 6.8 |
| 6/22/09 | 9.8 |
| 6/22/09 | 4.9 |
| 6/22/09 | 4.5 |
| 6/22/09 | 4.2 |
| 6/22/09 | 2.2 |
| 6/22/09 | 4.8 |
| 6/22/09 | 3 |
| 6/22/09 | 5.2 |
| 6/22/09 | 3.7 |
| 6/22/09 | 3.8 |
| 6/22/09 | 3.6 |
| 6/22/09 | 4.9 |
| 6/22/09 | 5.9 |
| 6/22/09 | 4.7 |
| 6/22/09 | 2.7 |
| 6/22/09 | 3.8 |
| 6/22/09 | 4.3 |
| 6/22/09 | 3 |
| 6/22/09 | 3.6 |
| 6/22/09 | 9.5 |
| 6/22/09 | 3.9 |
| 6/22/09 | 6.1 |
| 6/22/09 | 4.1 |
| 6/22/09 | 4 |
| 6/21/09 | 4 |
| 6/21/09 | 6.9 |
| 6/21/09 | 4.7 |
| 6/21/09 | 9.8 |
| 6/21/09 | 2.8 |
| 6/21/09 | 3.8 |
| 6/21/09 | 3.9 |
| 6/21/09 | 4 |
| 6/21/09 | 4.8 |
| 6/21/09 | 4.9 |
| 6/21/09 | 5.6 |
| 6/21/09 | 5.3 |
| 6/21/09 | 3.9 |
| 6/21/09 | 7.6 |
| 6/21/09 | 5.5 |
| 6/21/09 | 4.1 |
| 6/21/09 | 4.4 |
| 6/21/09 | 5.2 |
| 6/21/09 | 10.9 |
| 6/21/09 | 5.9 |
| 6/21/09 | 6.2 |
| 6/21/09 | 6.5 |
| 6/21/09 | 6.2 |
| 6/21/09 | 5.3 |
| 6/21/09 | 3.9 |
| 6/21/09 | 5.7 |
| 6/21/09 | 4.7 |
| 6/21/09 | 6.3 |
| 6/21/09 | 5.9 |
| 6/21/09 | 6.6 |
| 6/21/09 | 4.4 |
| 6/21/09 | 3.2 |
| 6/21/09 | 4.6 |
| 6/21/09 | 3.6 |
| 6/21/09 | 4.5 |
| 6/21/09 | 3.6 |
| 6/21/09 | 7.4 |
| 6/21/09 | 4.1 |
| 6/21/09 | 6.2 |
| 6/21/09 | 6.9 |
| 6/21/09 | 5.5 |
| 6/21/09 | 4.6 |
| 6/21/09 | 4.2 |
| 6/21/09 | 3.8 |
| 6/21/09 | 5.7 |
| 6/21/09 | 6.4 |
| 6/21/09 | 6.8 |
| 6/21/09 | 6.1 |
| 6/20/09 | 4.1 |
| 6/20/09 | 4 |
| 6/20/09 | 3.9 |
| 6/20/09 | 3.7 |
| 6/20/09 | 4.5 |
| 6/20/09 | 6.3 |
| 6/20/09 | 5.9 |
| 6/20/09 | 4 |
| 6/20/09 | 6.2 |
| 6/20/09 | 4.3 |
| 6/20/09 | 5 |
| 6/20/09 | 5.6 |
| 6/20/09 | 6.1 |
| 6/20/09 | 5.6 |
| 6/20/09 | 5.9 |
| 6/20/09 | 5.7 |
| 6/20/09 | 6.3 |
| 6/20/09 | 7.4 |
| 6/20/09 | 6 |
| 6/20/09 | 9.1 |
| 6/20/09 | 5.7 |
| 6/20/09 | 6.5 |
| 6/20/09 | 5.1 |
| 6/20/09 | 6.3 |
| 6/20/09 | 6.1 |
| 6/20/09 | 6.1 |
| 6/20/09 | 4 |
| 6/20/09 | 3.4 |
| 6/20/09 | 6 |
| 6/20/09 | 3.8 |
| 6/20/09 | 3.8 |
| 6/20/09 | 5 |
| 6/20/09 | 5.7 |
| 6/20/09 | 3.3 |
| 6/20/09 | 4.7 |
| 6/20/09 | 6.6 |
| 6/20/09 | 4.8 |
| 6/20/09 | 3.3 |
| 6/20/09 | 3 |
| 6/20/09 | 2.6 |
| 6/20/09 | 3.4 |
| 6/20/09 | 3.7 |
| 6/20/09 | 3.5 |
| 6/20/09 | 5.9 |
| 6/20/09 | 6.1 |
| 6/20/09 | 3.8 |
| 6/20/09 | 5.1 |
| 6/20/09 | 2.4 |
| 6/19/09 | 1.9 |
| 6/19/09 | 2.8 |
| 6/19/09 | 1.9 |
| 6/19/09 | 1.5 |
| 6/19/09 | 2.8 |
| 6/19/09 | 4.2 |
| 6/19/09 | 3.3 |
| 6/19/09 | 5.8 |
| 6/19/09 | 3.3 |
| 6/19/09 | 1.4 |
| 6/19/09 | 2.8 |
| 6/19/09 | 1.4 |
| 6/19/09 | 2.1 |
| 6/19/09 | 2.4 |
| 6/19/09 | 3.2 |
| 6/19/09 | 5.6 |
| 6/19/09 | 2.5 |
| 6/19/09 | 2.4 |
| 6/19/09 | 3.3 |
| 6/19/09 | 1.6 |
| 6/19/09 | 4.6 |
| 6/19/09 | 4.1 |
| 6/19/09 | 5 |
| 6/19/09 | 5.7 |
| 6/19/09 | 4.3 |
| 6/19/09 | 5 |
| 6/19/09 | 4.7 |
| 6/19/09 | 1.7 |
| 6/19/09 | 2.2 |
| 6/19/09 | 2.3 |
| 6/19/09 | 3.3 |
| 6/19/09 | 2.5 |
| 6/19/09 | 3 |
| 6/19/09 | 2.7 |
| 6/19/09 | 3.2 |
| 6/19/09 | 4.5 |
| 6/19/09 | 5.2 |
| 6/19/09 | 3.7 |
| 6/19/09 | 3.4 |
| 6/19/09 | 4.8 |
| 6/19/09 | 5.2 |
| 6/19/09 | 4.1 |
| 6/19/09 | 2.4 |
| 6/19/09 | 4.8 |
| 6/19/09 | 2.2 |
| 6/19/09 | 3.7 |
| 6/19/09 | 4.3 |
| 6/19/09 | 2.3 |
| 6/18/09 | 3.4 |
| 6/18/09 | 4.7 |
| 6/18/09 | 2.9 |
| 6/18/09 | 5.5 |
| 6/18/09 | 3.4 |
| 6/18/09 | 2.7 |
| 6/18/09 | 4 |
| 6/18/09 | 4 |
| 6/18/09 | 2.9 |
| 6/18/09 | 3.4 |
| 6/18/09 | 4.4 |
| 6/18/09 | 3.8 |
| 6/18/09 | 3.6 |
| 6/18/09 | 7 |
| 6/18/09 | 3.5 |
| 6/18/09 | 3.1 |
| 6/18/09 | 2.8 |
| 6/18/09 | 4.4 |
| 6/18/09 | 5 |
| 6/18/09 | 4.8 |
| 6/18/09 | 5.9 |
| 6/18/09 | 7.5 |
| 6/18/09 | 5.8 |
| 6/18/09 | 8.6 |
| 6/18/09 | 5.2 |
| 6/18/09 | 5.9 |
| 6/18/09 | 4.8 |
| 6/18/09 | 2.5 |
| 6/18/09 | 3.5 |
| 6/18/09 | 4.2 |
| 6/18/09 | 5.9 |
| 6/18/09 | 3.5 |
| 6/18/09 | 4.5 |
| 6/18/09 | 2.9 |
| 6/18/09 | 5.1 |
| 6/18/09 | 5.3 |
| 6/18/09 | 6.1 |
| 6/18/09 | 4.5 |
| 6/18/09 | 4.4 |
| 6/18/09 | 2.2 |
| 6/18/09 | 2.7 |
| 6/18/09 | 2.8 |
| 6/18/09 | 8 |
| 6/18/09 | 5.2 |
| 6/18/09 | 4.7 |
| 6/18/09 | 3.6 |
| 6/18/09 | 4.3 |
| 6/18/09 | 2.9 |
| 6/17/09 | 2.6 |
| 6/17/09 | 3.6 |
| 6/17/09 | 4.9 |
| 6/17/09 | 3.3 |
| 6/17/09 | 5.7 |
| 6/17/09 | 6.6 |
| 6/17/09 | 5 |
| 6/17/09 | 6.7 |
| 6/17/09 | 5.3 |
| 6/17/09 | 7.2 |
| 6/17/09 | 4.8 |
| 6/17/09 | 3.5 |
| 6/17/09 | 5.8 |
| 6/17/09 | 3.3 |
| 6/17/09 | 8.3 |
| 6/17/09 | 3.5 |
| 6/17/09 | 5.3 |
| 6/17/09 | 6 |
| 6/17/09 | 5.5 |
| 6/17/09 | 4.6 |
| 6/17/09 | 4.4 |
| 6/17/09 | 3.7 |
| 6/17/09 | 5.1 |
| 6/17/09 | 4.1 |
| 6/17/09 | 4.3 |
| 6/17/09 | 5.8 |
| 6/17/09 | 2.9 |
| 6/17/09 | 3.5 |
| 6/17/09 | 3.8 |
| 6/17/09 | 4.7 |
| 6/17/09 | 4.3 |
| 6/17/09 | 3.8 |
| 6/17/09 | 4.9 |
| 6/17/09 | 4.3 |
| 6/17/09 | 3.8 |
| 6/17/09 | 3.7 |
| 6/17/09 | 4.2 |
| 6/17/09 | 5 |
| 6/17/09 | 3.9 |
| 6/17/09 | 3 |
| 6/17/09 | 3.8 |
| 6/17/09 | 2.3 |
| 6/17/09 | 3.4 |
| 6/17/09 | 3.1 |
| 6/17/09 | 4.1 |
| 6/17/09 | 4 |
| 6/17/09 | 3.4 |
| 6/17/09 | 4.2 |
| 6/16/09 | 2.3 |
| 6/16/09 | 2.4 |
| 6/16/09 | 2.8 |
| 6/16/09 | 2.7 |
| 6/16/09 | 2.9 |
| 6/16/09 | 4 |
| 6/16/09 | 3.7 |
| 6/16/09 | 4.3 |
| 6/16/09 | 4.3 |
| 6/16/09 | 4.3 |
| 6/16/09 | 4.6 |
| 6/16/09 | 3.6 |
| 6/16/09 | 5.7 |
| 6/16/09 | 3.5 |
| 6/16/09 | 5.7 |
| 6/16/09 | 3.4 |
| 6/16/09 | 3.1 |
| 6/16/09 | 3.4 |
| 6/16/09 | 3.1 |
| 6/16/09 | 4.8 |
| 6/16/09 | 2.4 |
| 6/16/09 | 3.1 |
| 6/16/09 | 3.7 |
| 6/16/09 | 3 |
| 6/16/09 | 3.7 |
| 6/16/09 | 2.8 |
| 6/16/09 | 2.6 |
| 6/16/09 | 3.1 |
| 6/16/09 | 3.1 |
| 6/16/09 | 3.3 |
| 6/16/09 | 2.4 |
| 6/16/09 | 2.4 |
| 6/16/09 | 3.3 |
| 6/16/09 | 4.1 |
| 6/16/09 | 2.2 |
| 6/16/09 | 3.5 |
| 6/16/09 | 2.7 |
| 6/16/09 | 2.9 |
| 6/16/09 | 3.7 |
| 6/16/09 | 2.6 |
| 6/16/09 | 2.7 |
| 6/16/09 | 2.9 |
| 6/16/09 | 1.8 |
| 6/16/09 | 1.7 |
| 6/16/09 | 2 |
| 6/16/09 | 1.8 |
| 6/16/09 | 1.9 |
| 6/16/09 | 5.6 |
| 6/15/09 | 2.6 |
| 6/15/09 | 2.8 |
| 6/15/09 | 4.1 |
| 6/15/09 | 1.5 |
| 6/15/09 | 2.3 |
| 6/15/09 | 0.8 |
| 6/15/09 | 1.6 |
| 6/15/09 | 1.3 |
| 6/15/09 | 2.2 |
| 6/15/09 | 1.8 |
| 6/15/09 | 2 |
| 6/15/09 | 2.6 |
| 6/15/09 | 0.8 |
| 6/15/09 | 1.5 |
| 6/15/09 | 5.1 |
| 6/15/09 | 0.8 |
| 6/15/09 | 2.1 |
| 6/15/09 | 1.2 |
| 6/15/09 | 1.9 |
| 6/15/09 | 2.3 |
| 6/15/09 | 1.3 |
| 6/15/09 | 2.2 |
| 6/15/09 | 3 |
| 6/15/09 | 2.3 |
| 6/15/09 | 3 |
| 6/15/09 | 2.9 |
| 6/15/09 | 2.7 |
| 6/15/09 | 2.2 |
| 6/15/09 | 1.3 |
| 6/15/09 | 2.3 |
| 6/15/09 | 3.1 |
| 6/15/09 | 3.6 |
| 6/15/09 | 5.6 |
| 6/15/09 | 3.9 |
| 6/15/09 | 3.6 |
| 6/15/09 | 2.9 |
| 6/15/09 | 4 |
| 6/15/09 | 3.7 |
| 6/15/09 | 2.6 |
| 6/15/09 | 2.1 |
| 6/15/09 | 2.2 |
| 6/15/09 | 2.4 |
| 6/15/09 | 3.5 |
| 6/15/09 | 2.5 |
| 6/15/09 | 2.3 |
| 6/15/09 | 2 |
| 6/15/09 | 2.8 |
| 6/15/09 | 2.2 |
| 6/14/09 | 2.8 |
| 6/14/09 | 3.9 |
| 6/14/09 | 3.7 |
| 6/14/09 | 2 |
| 6/14/09 | 2.2 |
| 6/14/09 | 1.5 |
| 6/14/09 | 1.5 |
| 6/14/09 | 1.4 |
| 6/14/09 | 3 |
| 6/14/09 | 0.8 |
| 6/14/09 | 2.6 |
| 6/14/09 | 1.1 |
| 6/14/09 | 4.6 |
| 6/14/09 | 2.8 |
| 6/14/09 | 3.4 |
| 6/14/09 | 4.1 |
| 6/14/09 | 1.5 |
| 6/14/09 | 1.5 |
| 6/14/09 | 1 |
| 6/14/09 | 2.5 |
| 6/14/09 | 1.7 |
| 6/14/09 | 1.2 |
| 6/14/09 | 0.5 |
| 6/14/09 | 0.4 |
| 6/14/09 | 2.3 |
| 6/14/09 | 1.5 |
| 6/14/09 | 1.4 |
| 6/14/09 | 2.6 |
| 6/14/09 | 3.3 |
| 6/14/09 | 2.4 |
| 6/14/09 | 1.8 |
| 6/14/09 | 2.1 |
| 6/14/09 | 2.6 |
| 6/14/09 | 1.1 |
| 6/14/09 | 2.6 |
| 6/14/09 | 4.3 |
| 6/14/09 | 2.8 |
| 6/14/09 | 2.3 |
| 6/14/09 | 3.1 |
| 6/14/09 | 2.6 |
| 6/14/09 | 5.1 |
| 6/14/09 | 2.4 |
| 6/14/09 | 1.6 |
| 6/14/09 | 3.2 |
| 6/14/09 | 3.6 |
| 6/14/09 | 2.2 |
| 6/14/09 | 3.7 |
| 6/14/09 | 2.1 |
| 6/13/09 | 2.9 |
| 6/13/09 | 1.5 |
| 6/13/09 | 3.2 |
| 6/13/09 | 3.1 |
| 6/13/09 | 2.5 |
| 6/13/09 | 2.2 |
| 6/13/09 | 1.8 |
| 6/13/09 | 1.6 |
| 6/13/09 | 1.4 |
| 6/13/09 | 1 |
| 6/13/09 | 2.6 |
| 6/13/09 | 3.1 |
| 6/13/09 | 3.2 |
| 6/13/09 | 1.4 |
| 6/13/09 | 1.5 |
| 6/13/09 | 1.2 |
| 6/13/09 | 2.4 |
| 6/13/09 | 2.5 |
| 6/13/09 | 1.2 |
| 6/13/09 | 1.3 |
| 6/13/09 | 1.7 |
| 6/13/09 | 0.9 |
| 6/13/09 | 1.6 |
| 6/13/09 | 1.7 |
| 6/13/09 | 2.2 |
| 6/13/09 | 1.7 |
| 6/13/09 | 4.9 |
| 6/13/09 | 2 |
| 6/13/09 | 1.5 |
| 6/13/09 | 1.7 |
| 6/13/09 | 1.3 |
| 6/13/09 | 2.5 |
| 6/13/09 | 1.6 |
| 6/13/09 | 2.3 |
| 6/13/09 | 2.7 |
| 6/13/09 | 6.9 |
| 6/13/09 | 2.6 |
| 6/13/09 | 2.9 |
| 6/13/09 | 1.6 |
| 6/13/09 | 2.2 |
| 6/13/09 | 1.3 |
| 6/13/09 | 2.1 |
| 6/13/09 | 2.3 |
| 6/13/09 | 1.9 |
| 6/13/09 | 2.4 |
| 6/13/09 | 0.9 |
| 6/13/09 | 2 |
| 6/13/09 | 1.4 |
| 6/12/09 | 2.5 |
| 6/12/09 | 1.1 |
| 6/12/09 | 2 |
| 6/12/09 | 1.2 |
| 6/12/09 | 2 |
| 6/12/09 | 3.8 |
| 6/12/09 | 2.2 |
| 6/12/09 | 2.7 |
| 6/12/09 | 3.2 |
| 6/12/09 | 1.5 |
| 6/12/09 | 1.5 |
| 6/12/09 | 2.6 |
| 6/12/09 | 0.2 |
| 6/12/09 | 2.3 |
| 6/12/09 | 3.2 |
| 6/12/09 | 2 |
| 6/12/09 | 1.3 |
| 6/12/09 | 0.7 |
| 6/12/09 | 0.9 |
| 6/12/09 | 1.3 |
| 6/12/09 | 0.5 |
| 6/12/09 | 1.3 |
| 6/12/09 | 1.9 |
| 6/12/09 | 3.1 |
| 6/12/09 | 1.5 |
| 6/12/09 | 1.7 |
| 6/12/09 | 1.5 |
| 6/12/09 | 2.1 |
| 6/12/09 | 0.7 |
| 6/12/09 | 1.1 |
| 6/12/09 | 1.1 |
| 6/12/09 | 1.6 |
| 6/12/09 | 1.8 |
| 6/12/09 | 3.2 |
| 6/12/09 | 0.7 |
| 6/12/09 | 1.4 |
| 6/12/09 | 1 |
| 6/12/09 | 1.6 |
| 6/12/09 | 1.7 |
| 6/12/09 | 2.4 |
| 6/12/09 | 4.5 |
| 6/12/09 | 1.6 |
| 6/12/09 | 2.5 |
| 6/12/09 | 1.6 |
| 6/12/09 | 2 |
| 6/12/09 | 1.1 |
| 6/12/09 | 2.3 |
| 6/12/09 | 2.7 |
| 6/11/09 | 1.8 |
| 6/11/09 | 1.3 |
| 6/11/09 | 0.7 |
| 6/11/09 | 3.4 |
| 6/11/09 | 1 |
| 6/11/09 | 2.2 |
| 6/11/09 | 2.1 |
| 6/11/09 | 1.3 |
| 6/11/09 | 2.8 |
| 6/11/09 | 2.4 |
| 6/11/09 | 3.3 |
| 6/11/09 | 1.8 |
| 6/11/09 | 2.3 |
| 6/11/09 | 1.7 |
| 6/11/09 | 1.8 |
| 6/11/09 | 2.4 |
| 6/11/09 | 1.3 |
| 6/11/09 | 4.9 |
| 6/11/09 | 2 |
| 6/11/09 | 2.2 |
| 6/11/09 | 1.5 |
| 6/11/09 | 1 |
| 6/11/09 | 1.6 |
| 6/11/09 | 0.6 |
| 6/11/09 | 1.3 |
| 6/11/09 | 0.9 |
| 6/11/09 | 1.5 |
| 6/11/09 | 1.1 |
| 6/11/09 | 2.7 |
| 6/11/09 | 0.6 |
| 6/11/09 | 1.1 |
| 6/11/09 | 1.3 |
| 6/11/09 | 0.8 |
| 6/11/09 | 1.3 |
| 6/11/09 | 2.1 |
| 6/11/09 | 0.7 |
| 6/11/09 | 2.1 |
| 6/11/09 | 1.7 |
| 6/11/09 | 1 |
| 6/11/09 | 1 |
| 6/11/09 | 0.7 |
| 6/11/09 | 1.3 |
| 6/11/09 | 1.7 |
| 6/11/09 | 0.8 |
| 6/11/09 | 1.8 |
| 6/11/09 | 0.9 |
| 6/11/09 | 1.2 |
| 6/11/09 | 1.3 |
| 6/10/09 | 1.4 |
| 6/10/09 | 1.5 |
| 6/10/09 | 2.2 |
| 6/10/09 | 2.3 |
| 6/10/09 | 1.6 |
| 6/10/09 | 1.2 |
| 6/10/09 | 0.8 |
| 6/10/09 | 1.7 |
| 6/10/09 | 2.1 |
| 6/10/09 | 1.5 |
| 6/10/09 | 0.5 |
| 6/10/09 | 1.2 |
| 6/10/09 | 0.7 |
| 6/10/09 | 1.2 |
| 6/10/09 | 1.2 |
| 6/10/09 | 1.4 |
| 6/10/09 | 1.4 |
| 6/10/09 | 1.1 |
| 6/10/09 | 1.5 |
| 6/10/09 | 1.4 |
| 6/10/09 | 0.3 |
| 6/10/09 | 1.1 |
| 6/10/09 | 0.7 |
| 6/10/09 | 0.8 |
| 6/10/09 | 1.6 |
| 6/10/09 | 0.6 |
| 6/10/09 | 1.6 |
| 6/10/09 | 0.9 |
| 6/10/09 | 0.2 |
| 6/10/09 | 1.4 |
| 6/10/09 | 0.8 |
| 6/10/09 | 2.2 |
| 6/10/09 | 1.4 |
| 6/10/09 | 1.4 |
| 6/10/09 | 1.7 |
| 6/10/09 | 1.9 |
| 6/10/09 | 3.1 |
| 6/10/09 | 2.5 |
| 6/10/09 | 1.5 |
| 6/10/09 | 1.2 |
| 6/10/09 | 3.2 |
| 6/10/09 | 3.3 |
| 6/10/09 | 1.4 |
| 6/10/09 | 2 |
| 6/10/09 | 2.1 |
| 6/10/09 | 2.5 |
| 6/10/09 | 1.8 |
| 6/10/09 | 2.2 |
| 6/9/09 | 1.7 |
| 6/9/09 | 0.9 |
| 6/9/09 | 2.2 |
| 6/9/09 | 2 |
| 6/9/09 | 3.3 |
| 6/9/09 | 1.7 |
| 6/9/09 | 1.3 |
| 6/9/09 | 2.6 |
| 6/9/09 | 1.5 |
| 6/9/09 | 0.1 |
| 6/9/09 | 1.3 |
| 6/9/09 | 2.8 |
| 6/9/09 | 1.3 |
| 6/9/09 | 3.7 |
| 6/9/09 | 3.1 |
| 6/9/09 | 3.2 |
| 6/9/09 | 2.3 |
| 6/9/09 | 1.5 |
| 6/9/09 | 1.8 |
| 6/9/09 | 2.1 |
| 6/9/09 | 2 |
| 6/9/09 | 2.7 |
| 6/9/09 | 1 |
| 6/9/09 | 3.4 |
| 6/9/09 | 1.8 |
| 6/9/09 | 1.4 |
| 6/9/09 | 3 |
| 6/9/09 | 1.6 |
| 6/9/09 | 1.7 |
| 6/9/09 | 1.4 |
| 6/9/09 | 1.3 |
| 6/9/09 | 1.8 |
| 6/9/09 | 1.1 |
| 6/9/09 | 1.6 |
| 6/9/09 | 1.4 |
| 6/9/09 | 2.7 |
| 6/9/09 | 2.8 |
| 6/9/09 | 3 |
| 6/9/09 | 4 |
| 6/9/09 | 2.2 |
| 6/9/09 | 2.3 |
| 6/9/09 | 1.2 |
| 6/9/09 | 2.3 |
| 6/9/09 | 2.3 |
| 6/9/09 | 2.5 |
| 6/9/09 | 2.4 |
| 6/9/09 | 1.8 |
| 6/9/09 | 1.6 |
| 6/8/09 | 2.1 |
| 6/8/09 | 0.9 |
| 6/8/09 | 0.6 |
| 6/8/09 | 2.4 |
| 6/8/09 | 1 |
| 6/8/09 | 2.3 |
| 6/8/09 | 2 |
| 6/8/09 | 3.9 |
| 6/8/09 | 2.6 |
| 6/8/09 | 2.1 |
| 6/8/09 | 1.2 |
| 6/8/09 | 1.6 |
| 6/8/09 | 2.2 |
| 6/8/09 | 1.2 |
| 6/8/09 | 1.7 |
| 6/8/09 | 1.6 |
| 6/8/09 | 0.7 |
| 6/8/09 | 1.3 |
| 6/8/09 | 1.6 |
| 6/8/09 | 0.9 |
| 6/8/09 | 1.4 |
| 6/8/09 | 2.3 |
| 6/8/09 | 1.4 |
| 6/8/09 | 1.9 |
| 6/8/09 | 2.8 |
| 6/8/09 | 1.3 |
| 6/8/09 | 2 |
| 6/8/09 | 1.5 |
| 6/8/09 | 3.1 |
| 6/8/09 | 1.6 |
| 6/8/09 | 1.8 |
| 6/8/09 | 1.8 |
| 6/8/09 | 2.3 |
| 6/8/09 | 1.9 |
| 6/8/09 | 2.1 |
| 6/8/09 | 3.1 |
| 6/8/09 | 4.2 |
| 6/8/09 | 2.8 |
| 6/8/09 | 11.1 |
| 6/8/09 | 3.4 |
| 6/8/09 | 1.5 |
| 6/8/09 | 2.4 |
| 6/8/09 | 2.2 |
| 6/8/09 | 1.9 |
| 6/8/09 | 2.5 |
| 6/8/09 | 3.3 |
| 6/8/09 | 2.6 |
| 6/8/09 | 2.6 |
| 6/7/09 | 4.1 |
| 6/7/09 | 4.1 |
| 6/7/09 | 2.2 |
| 6/7/09 | 3.3 |
| 6/7/09 | 2.4 |
| 6/7/09 | 1.7 |
| 6/7/09 | 2.8 |
| 6/7/09 | 1.2 |
| 6/7/09 | 2.3 |
| 6/7/09 | 1 |
| 6/7/09 | 1.6 |
| 6/7/09 | 1.4 |
| 6/7/09 | 2.2 |
| 6/7/09 | 0.8 |
| 6/7/09 | 0.9 |
| 6/7/09 | 2.1 |
| 6/7/09 | 2.1 |
| 6/7/09 | 1.5 |
| 6/7/09 | 2 |
| 6/7/09 | 2.4 |
| 6/7/09 | 1.7 |
| 6/7/09 | 1.6 |
| 6/7/09 | 2.2 |
| 6/7/09 | 1.7 |
| 6/7/09 | 1.3 |
| 6/7/09 | 1.7 |
| 6/7/09 | 2.3 |
| 6/7/09 | 2.2 |
| 6/7/09 | 2.3 |
| 6/7/09 | 1.3 |
| 6/7/09 | 1.5 |
| 6/7/09 | 1.5 |
| 6/7/09 | 1.9 |
| 6/7/09 | 3.7 |
| 6/7/09 | 2.7 |
| 6/7/09 | 2.6 |
| 6/7/09 | 3 |
| 6/7/09 | 2.8 |
| 6/7/09 | 2 |
| 6/7/09 | 2.7 |
| 6/7/09 | 2.5 |
| 6/7/09 | 3.7 |
| 6/7/09 | 2 |
| 6/7/09 | 2.4 |
| 6/7/09 | 2.5 |
| 6/7/09 | 3 |
| 6/7/09 | 2.9 |
| 6/7/09 | 1.8 |
| 6/6/09 | 1.7 |
| 6/6/09 | 3.2 |
| 6/6/09 | 2.2 |
| 6/6/09 | 1.9 |
| 6/6/09 | 2.4 |
| 6/6/09 | 2.4 |
| 6/6/09 | 1.3 |
| 6/6/09 | 0.9 |
| 6/6/09 | 1.2 |
| 6/6/09 | 1.8 |
| 6/6/09 | 2.3 |
| 6/6/09 | 1.2 |
| 6/6/09 | 2.8 |
| 6/6/09 | 0.6 |
| 6/6/09 | 2 |
| 6/6/09 | 1.8 |
| 6/6/09 | 2.3 |
| 6/6/09 | 1.7 |
| 6/6/09 | 1.8 |
| 6/6/09 | 1.8 |
| 6/6/09 | 1.4 |
| 6/6/09 | 2.4 |
| 6/6/09 | 1.9 |
| 6/6/09 | 1.7 |
| 6/6/09 | 0.8 |
| 6/6/09 | 1.9 |
| 6/6/09 | 3.2 |
| 6/6/09 | 3 |
| 6/6/09 | 2 |
| 6/6/09 | 1.8 |
| 6/6/09 | 3 |
| 6/6/09 | 2.5 |
| 6/6/09 | 3.3 |
| 6/6/09 | 3.2 |
| 6/6/09 | 3.5 |
| 6/6/09 | 4.1 |
| 6/6/09 | 3.7 |
| 6/6/09 | 3.4 |
| 6/6/09 | 3.4 |
| 6/6/09 | 2.9 |
| 6/6/09 | 3.1 |
| 6/6/09 | 2.1 |
| 6/6/09 | 3.1 |
| 6/6/09 | 2.3 |
| 6/6/09 | 2.8 |
| 6/6/09 | 2.6 |
| 6/6/09 | 2.2 |
| 6/6/09 | 3.1 |
| 6/5/09 | 3.3 |
| 6/5/09 | 3.4 |
| 6/5/09 | 3 |
| 6/5/09 | 4.2 |
| 6/5/09 | 3.1 |
| 6/5/09 | 2.7 |
| 6/5/09 | 4 |
| 6/5/09 | 3.1 |
| 6/5/09 | 1.9 |
| 6/5/09 | 2.8 |
| 6/5/09 | 3.4 |
| 6/5/09 | 2.6 |
| 6/5/09 | 2.5 |
| 6/5/09 | 3.5 |
| 6/5/09 | 3 |
| 6/5/09 | 2.7 |
| 6/5/09 | 2 |
| 6/5/09 | 4.2 |
| 6/5/09 | 2.4 |
| 6/5/09 | 2.3 |
| 6/5/09 | 3.3 |
| 6/5/09 | 2.8 |
| 6/5/09 | 4.2 |
| 6/5/09 | 3.3 |
| 6/5/09 | 3.3 |
| 6/5/09 | 3.1 |
| 6/5/09 | 2.6 |
| 6/5/09 | 1.4 |
| 6/5/09 | 3.3 |
| 6/5/09 | 3.9 |
| 6/5/09 | 2.8 |
| 6/5/09 | 3.3 |
| 6/5/09 | 3.1 |
| 6/5/09 | 2.6 |
| 6/5/09 | 4 |
| 6/5/09 | 2.5 |
| 6/5/09 | 2.3 |
| 6/5/09 | 2.8 |
| 6/5/09 | 2.7 |
| 6/5/09 | 1.9 |
| 6/5/09 | 1.5 |
| 6/5/09 | 3.1 |
| 6/5/09 | 2.6 |
| 6/5/09 | 4.2 |
| 6/5/09 | 4.3 |
| 6/5/09 | 3.4 |
| 6/5/09 | 4.1 |
| 6/5/09 | 2.3 |
| 6/4/09 | 3 |
| 6/4/09 | 4.1 |
| 6/4/09 | 2.9 |
| 6/4/09 | 1.7 |
| 6/4/09 | 2.8 |
| 6/4/09 | 2.1 |
| 6/4/09 | 2.8 |
| 6/4/09 | 3.1 |
| 6/4/09 | 2.6 |
| 6/4/09 | 3 |
| 6/4/09 | 4.8 |
| 6/4/09 | 3.5 |
| 6/4/09 | 3.6 |
| 6/4/09 | 3.1 |
| 6/4/09 | 3 |
| 6/4/09 | 2.7 |
| 6/4/09 | 3.9 |
| 6/4/09 | 2.4 |
| 6/4/09 | 2.6 |
| 6/4/09 | 3.4 |
| 6/4/09 | 2.5 |
| 6/4/09 | 3.1 |
| 6/4/09 | 2.2 |
| 6/4/09 | 2.5 |
| 6/4/09 | 2.3 |
| 6/4/09 | 1.8 |
| 6/4/09 | 2.9 |
| 6/4/09 | 3.4 |
| 6/4/09 | 2.8 |
| 6/4/09 | 4.4 |
| 6/4/09 | 2.2 |
| 6/4/09 | 2.3 |
| 6/4/09 | 3.2 |
| 6/4/09 | 1.3 |
| 6/4/09 | 3.3 |
| 6/4/09 | 3.3 |
| 6/4/09 | 2.6 |
| 6/4/09 | 3.6 |
| 6/4/09 | 4.2 |
| 6/4/09 | 2.4 |
| 6/4/09 | 3.5 |
| 6/4/09 | 3.3 |
| 6/4/09 | 3.1 |
| 6/4/09 | 3.4 |
| 6/4/09 | 5 |
| 6/4/09 | 3.8 |
| 6/4/09 | 4.4 |
| 6/4/09 | 4.1 |
| 6/3/09 | 3.3 |
| 6/3/09 | 3.1 |
| 6/3/09 | 3.7 |
| 6/3/09 | 6.2 |
| 6/3/09 | 4.9 |
| 6/3/09 | 4.4 |
| 6/3/09 | 3.6 |
| 6/3/09 | 2.3 |
| 6/3/09 | 3.1 |
| 6/3/09 | 2.2 |
| 6/3/09 | 3.2 |
| 6/3/09 | 1.9 |
| 6/3/09 | 2.3 |
| 6/3/09 | 3.2 |
| 6/3/09 | 1.8 |
| 6/3/09 | 1.9 |
| 6/3/09 | 1.7 |
| 6/3/09 | 1.7 |
| 6/3/09 | 2.8 |
| 6/3/09 | 1.9 |
| 6/3/09 | 2.6 |
| 6/3/09 | 3.3 |
| 6/3/09 | 1.5 |
| 6/3/09 | 1.9 |
| 6/3/09 | 0.7 |
| 6/3/09 | 1.9 |
| 6/3/09 | 2.7 |
| 6/3/09 | 2.4 |
| 6/3/09 | 2.2 |
| 6/3/09 | 2.6 |
| 6/3/09 | 1.4 |
| 6/3/09 | 1.6 |
| 6/3/09 | 1.9 |
| 6/3/09 | 2.8 |
| 6/3/09 | 1.5 |
| 6/3/09 | 2 |
| 6/3/09 | 1.4 |
| 6/3/09 | 2.5 |
| 6/3/09 | 3.2 |
| 6/3/09 | 1.4 |
| 6/3/09 | 1.5 |
| 6/3/09 | 2.2 |
| 6/3/09 | 1.7 |
| 6/3/09 | 1 |
| 6/3/09 | 2.9 |
| 6/3/09 | 2.6 |
| 6/3/09 | 1.5 |
| 6/3/09 | 2.3 |
| 6/2/09 | 2.1 |
| 6/2/09 | 1.6 |
| 6/2/09 | 1.7 |
| 6/2/09 | 2.4 |
| 6/2/09 | 2.4 |
| 6/2/09 | 2.2 |
| 6/2/09 | 1.8 |
| 6/2/09 | 2.4 |
| 6/2/09 | 3 |
| 6/2/09 | 2.3 |
| 6/2/09 | 1.7 |
| 6/2/09 | 2.5 |
| 6/2/09 | 2.2 |
| 6/2/09 | 1.4 |
| 6/2/09 | 2.4 |
| 6/2/09 | 2.8 |
| 6/2/09 | 1.3 |
| 6/2/09 | 1.9 |
| 6/2/09 | 2.4 |
| 6/2/09 | 1.7 |
| 6/2/09 | 3.4 |
| 6/2/09 | 2.1 |
| 6/2/09 | 2.3 |
| 6/2/09 | 2.4 |
| 6/2/09 | 2.1 |
| 6/2/09 | 2.7 |
| 6/2/09 | 1.4 |
| 6/2/09 | 1.9 |
| 6/2/09 | 2 |
| 6/2/09 | 1.4 |
| 6/2/09 | 2.2 |
| 6/2/09 | 2.2 |
| 6/2/09 | 2.2 |
| 6/2/09 | 1.9 |
| 6/2/09 | 1.5 |
| 6/2/09 | 1.9 |
| 6/2/09 | 1.6 |
| 6/2/09 | 2 |
| 6/2/09 | 2.2 |
| 6/2/09 | 1.8 |
| 6/2/09 | 4 |
| 6/2/09 | 2.1 |
| 6/2/09 | 3.1 |
| 6/2/09 | 2.7 |
| 6/2/09 | 2.8 |
| 6/2/09 | 2.1 |
| 6/2/09 | 2.8 |
| 6/2/09 | 2.1 |
| 6/1/09 | 2.5 |
| 6/1/09 | 2.8 |
| 6/1/09 | 2.8 |
| 6/1/09 | 3.4 |
| 6/1/09 | 1.8 |
| 6/1/09 | 1.8 |
| 6/1/09 | 2.4 |
| 6/1/09 | 2.5 |
| 6/1/09 | 2.4 |
| 6/1/09 | 1.8 |
| 6/1/09 | 1.4 |
| 6/1/09 | 2.2 |
| 6/1/09 | 1.5 |
| 6/1/09 | 2.2 |
| 6/1/09 | 2.3 |
| 6/1/09 | 3.2 |
| 6/1/09 | 2.1 |
| 6/1/09 | 2.8 |
| 6/1/09 | 2 |
| 6/1/09 | 2.8 |
| 6/1/09 | 2 |
| 6/1/09 | 2 |
| 6/1/09 | 1.9 |
| 6/1/09 | 2.5 |
| 6/1/09 | 1.6 |
| 6/1/09 | 2.6 |
| 6/1/09 | 2.5 |
| 6/1/09 | 2.8 |
| 6/1/09 | 1.9 |
| 6/1/09 | 2.1 |
| 6/1/09 | 1.6 |
| 6/1/09 | 2.7 |
| 6/1/09 | 1.8 |
| 6/1/09 | 1.6 |
| 6/1/09 | 1.7 |
| 6/1/09 | 2.8 |
| 6/1/09 | 2.1 |
| 6/1/09 | 3.1 |
| 6/1/09 | 2.4 |
| 6/1/09 | 3 |
| 6/1/09 | 3.7 |
| 6/1/09 | 2.7 |
| 6/1/09 | 2.7 |
| 6/1/09 | 3 |
| 6/1/09 | 2.6 |
| 6/1/09 | 3.7 |
| 6/1/09 | 2.5 |
| 6/1/09 | 2.7 |
| 5/31/09 | 2.1 |
| 5/31/09 | 2.3 |
| 5/31/09 | 3.1 |
| 5/31/09 | 2.1 |
| 5/31/09 | 2.5 |
| 5/31/09 | 2.4 |
| 5/31/09 | 3.3 |
| 5/31/09 | 2.5 |
| 5/31/09 | 2.8 |
| 5/31/09 | 3.4 |
| 5/31/09 | 2.5 |
| 5/31/09 | 3.1 |
| 5/31/09 | 2.6 |
| 5/31/09 | 3.2 |
| 5/31/09 | 2.7 |
| 5/31/09 | 3.4 |
| 5/31/09 | 2.7 |
| 5/31/09 | 2.6 |
| 5/31/09 | 2 |
| 5/31/09 | 3.2 |
| 5/31/09 | 3 |
| 5/31/09 | 2 |
| 5/31/09 | 2.3 |
| 5/31/09 | 2.9 |
| 5/31/09 | 2.2 |
| 5/31/09 | 2.2 |
| 5/31/09 | 2.6 |
| 5/31/09 | 2.3 |
| 5/31/09 | 2.2 |
| 5/31/09 | 3.1 |
| 5/31/09 | 1.1 |
| 5/31/09 | 2.6 |
| 5/31/09 | 2 |
| 5/31/09 | 2.7 |
| 5/31/09 | 2.1 |
| 5/31/09 | 1.5 |
| 5/31/09 | 3.1 |
| 5/31/09 | 2.8 |
| 5/31/09 | 2 |
| 5/31/09 | 1.8 |
| 5/31/09 | 1.9 |
| 5/31/09 | 2.6 |
| 5/31/09 | 2.1 |
| 5/31/09 | 2.3 |
| 5/31/09 | 1.8 |
| 5/31/09 | 3.1 |
| 5/31/09 | 1.3 |
| 5/31/09 | 3.3 |
| 5/30/09 | 3 |
| 5/30/09 | 1.7 |
| 5/30/09 | 1.9 |
| 5/30/09 | 2.9 |
| 5/30/09 | 2.4 |
| 5/30/09 | 2.2 |
| 5/30/09 | 1.7 |
| 5/30/09 | 1.7 |
| 5/30/09 | 1.6 |
| 5/30/09 | 1.5 |
| 5/30/09 | 1.4 |
| 5/30/09 | 1.7 |
| 5/30/09 | 1.9 |
| 5/30/09 | 2.2 |
| 5/30/09 | 2.2 |
| 5/30/09 | 2.1 |
| 5/30/09 | 2.7 |
| 5/30/09 | 2.6 |
| 5/30/09 | 2 |
| 5/30/09 | 1.6 |
| 5/30/09 | 2.6 |
| 5/30/09 | 2.1 |
| 5/30/09 | 1.8 |
| 5/30/09 | 1.3 |
| 5/30/09 | 1.7 |
| 5/30/09 | 2.2 |
| 5/30/09 | 1.7 |
| 5/30/09 | 2.9 |
| 5/30/09 | 2.3 |
| 5/30/09 | 0.4 |
| 5/30/09 | 1.7 |
| 5/30/09 | 2.3 |
| 5/30/09 | 2.5 |
| 5/30/09 | 2.1 |
| 5/30/09 | 1.6 |
| 5/30/09 | 1.6 |
| 5/30/09 | 1.8 |
| 5/30/09 | 1.1 |
| 5/30/09 | 1.8 |
| 5/30/09 | 2.3 |
| 5/30/09 | 2.5 |
| 5/30/09 | 2.5 |
| 5/30/09 | 0.9 |
| 5/30/09 | 2.2 |
| 5/30/09 | 3.2 |
| 5/30/09 | 2 |
| 5/30/09 | 3.1 |
| 5/30/09 | 2.1 |
| 5/29/09 | 2.4 |
| 5/29/09 | 1.9 |
| 5/29/09 | 2.2 |
| 5/29/09 | 3.4 |
| 5/29/09 | 1 |
| 5/29/09 | 2.3 |
| 5/29/09 | 0.7 |
| 5/29/09 | 2.2 |
| 5/29/09 | 1.1 |
| 5/29/09 | 1.7 |
| 5/29/09 | 1.4 |
| 5/29/09 | 2.2 |
| 5/29/09 | 2.3 |
| 5/29/09 | 2.1 |
| 5/29/09 | 2.1 |
| 5/29/09 | 2.6 |
| 5/29/09 | 2.1 |
| 5/29/09 | 2.3 |
| 5/29/09 | 2.3 |
| 5/29/09 | 2 |
| 5/29/09 | 2.6 |
| 5/29/09 | 1.6 |
| 5/29/09 | 2.4 |
| 5/29/09 | 1.7 |
| 5/29/09 | 2 |
| 5/29/09 | 2.7 |
| 5/29/09 | 3 |
| 5/29/09 | 2.2 |
| 5/29/09 | 1.5 |
| 5/29/09 | 2.5 |
| 5/29/09 | 2.8 |
| 5/29/09 | 2.8 |
| 5/29/09 | 4.7 |
| 5/29/09 | 2.9 |
| 5/29/09 | 2.4 |
| 5/29/09 | 2.9 |
| 5/29/09 | 3.1 |
| 5/29/09 | 3.2 |
| 5/29/09 | 1.4 |
| 5/29/09 | 2.7 |
| 5/29/09 | 2.6 |
| 5/29/09 | 2.2 |
| 5/29/09 | 1.5 |
| 5/29/09 | 1.7 |
| 5/29/09 | 0.7 |
| 5/29/09 | 0.9 |
| 5/29/09 | 1.9 |
| 5/29/09 | 1.7 |
| 5/28/09 | 2.9 |
| 5/28/09 | 2.2 |
| 5/28/09 | 2.8 |
| 5/28/09 | 2.9 |
| 5/28/09 | 2.8 |
| 5/28/09 | 3.6 |
| 5/28/09 | 2 |
| 5/28/09 | 3 |
| 5/28/09 | 2.4 |
| 5/28/09 | 2.3 |
| 5/28/09 | 2.6 |
| 5/28/09 | 1.8 |
| 5/28/09 | 3 |
| 5/28/09 | 2.3 |
| 5/28/09 | 1.7 |
| 5/28/09 | 2.1 |
| 5/28/09 | 2.7 |
| 5/28/09 | 2.4 |
| 5/28/09 | 4.9 |
| 5/28/09 | 4.6 |
| 5/28/09 | 1.8 |
| 5/28/09 | 3.5 |
| 5/28/09 | 1.5 |
| 5/28/09 | 1.5 |
| 5/28/09 | 2.2 |
| 5/28/09 | 1.7 |
| 5/28/09 | 0.4 |
| 5/28/09 | 1.5 |
| 5/28/09 | 3.4 |
| 5/28/09 | 3 |
| 5/28/09 | 2 |
| 5/28/09 | 3.8 |
| 5/28/09 | 1.1 |
| 5/28/09 | 1 |
| 5/28/09 | 1.7 |
| 5/28/09 | 1.4 |
| 5/28/09 | 3.4 |
| 5/28/09 | 2.2 |
| 5/28/09 | 1.7 |
| 5/28/09 | 2 |
| 5/28/09 | 2.5 |
| 5/28/09 | 1.8 |
| 5/28/09 | 2.4 |
| 5/28/09 | 1.6 |
| 5/28/09 | 1.5 |
| 5/28/09 | 3.1 |
| 5/28/09 | 3.3 |
| 5/28/09 | 1.9 |
| 5/27/09 | 5.1 |
| 5/27/09 | 7.4 |
| 5/27/09 | 15 |
| 5/27/09 | 16.9 |
| 5/27/09 | 3.5 |
| 5/27/09 | 5.6 |
| 5/27/09 | 2.4 |
| 5/27/09 | 9.1 |
| 5/27/09 | 3.4 |
| 5/27/09 | 2.9 |
| 5/27/09 | 1.8 |
| 5/27/09 | 8.4 |
| 5/27/09 | 10.7 |
| 5/27/09 | 4.3 |
| 5/27/09 | 0.7 |
| 5/27/09 | 2 |
| 5/27/09 | 2.5 |
| 5/27/09 | 1.7 |
| 5/27/09 | 2.7 |
| 5/27/09 | 1.1 |
| 5/27/09 | 1.7 |
| 5/27/09 | 2.5 |
| 5/27/09 | 2.9 |
| 5/27/09 | 3.8 |
| 5/27/09 | 0.9 |
| 5/27/09 | 1 |
| 5/27/09 | 2.6 |
| 5/27/09 | 1.5 |
| 5/27/09 | 1.4 |
| 5/27/09 | 1.2 |
| 5/27/09 | 2.5 |
| 5/27/09 | 2.1 |
| 5/27/09 | 4.9 |
| 5/27/09 | 2.5 |
| 5/27/09 | 2.6 |
| 5/27/09 | 3.6 |
| 5/27/09 | 2.8 |
| 5/27/09 | 4.4 |
| 5/27/09 | 2.5 |
| 5/27/09 | 2.4 |
| 5/27/09 | 4.4 |
| 5/27/09 | 3.9 |
| 5/27/09 | 4.1 |
| 5/27/09 | 3.9 |
| 5/27/09 | 4 |
| 5/27/09 | 5 |
| 5/27/09 | 4.7 |
| 5/26/09 | 2.7 |
| 5/26/09 | 1.5 |
| 5/26/09 | 2.5 |
| 5/26/09 | 2.8 |
| 5/26/09 | 2.6 |
| 5/26/09 | 2 |
| 5/26/09 | 3 |
| 5/26/09 | 2.4 |
| 5/26/09 | 2.8 |
| 5/26/09 | 3.6 |
| 5/26/09 | 2.7 |
| 5/26/09 | 2.5 |
| 5/26/09 | 1.9 |
| 5/26/09 | 3.5 |
| 5/26/09 | 2.7 |
| 5/26/09 | 3.2 |
| 5/26/09 | 4.4 |
| 5/26/09 | 2.1 |
| 5/26/09 | 2.6 |
| 5/26/09 | 2.8 |
| 5/26/09 | 2.3 |
| 5/26/09 | 4.6 |
| 5/26/09 | 4.3 |
| 5/26/09 | 2.8 |
| 5/26/09 | 3.2 |
| 5/26/09 | 2.6 |
| 5/26/09 | 2.8 |
| 5/26/09 | 1.8 |
| 5/26/09 | 2.5 |
| 5/26/09 | 4 |
| 5/26/09 | 2.6 |
| 5/26/09 | 2.9 |
| 5/26/09 | 2.4 |
| 5/26/09 | 1.6 |
| 5/26/09 | 1.5 |
| 5/26/09 | 1 |
| 5/26/09 | 3.4 |
| 5/26/09 | 1.2 |
| 5/26/09 | 3.2 |
| 5/26/09 | 3.7 |
| 5/26/09 | 3.5 |
| 5/26/09 | 2.5 |
| 5/26/09 | 2.3 |
| 5/26/09 | 1.5 |
| 5/26/09 | 2 |
| 5/26/09 | 2 |
| 5/26/09 | 2 |
| 5/26/09 | 2 |
| 5/25/09 | 2.3 |
| 5/25/09 | 2.2 |
| 5/25/09 | 1.1 |
| 5/25/09 | 1.7 |
| 5/25/09 | 0.8 |
| 5/25/09 | 1.6 |
| 5/25/09 | 1 |
| 5/25/09 | 5 |
| 5/25/09 | 1.9 |
| 5/25/09 | 1.6 |
| 5/25/09 | 1.5 |
| 5/25/09 | 1 |
| 5/25/09 | 1.7 |
| 5/25/09 | 2.2 |
| 5/25/09 | 2.3 |
| 5/25/09 | 1.6 |
| 5/25/09 | 1.9 |
| 5/25/09 | 1.8 |
| 5/25/09 | 2.3 |
| 5/25/09 | 0.1 |
| 5/25/09 | 3.3 |
| 5/25/09 | 0.7 |
| 5/25/09 | 0 |
| 5/25/09 | 2.2 |
| 5/25/09 | 1 |
| 5/25/09 | 1 |
| 5/25/09 | 2.5 |
| 5/25/09 | 1 |
| 5/25/09 | 1.1 |
| 5/25/09 | 1.9 |
| 5/25/09 | 0.9 |
| 5/25/09 | 1.5 |
| 5/25/09 | 1.1 |
| 5/25/09 | 1.5 |
| 5/25/09 | 1.4 |
| 5/25/09 | 1.9 |
| 5/25/09 | 2 |
| 5/25/09 | 2.8 |
| 5/25/09 | 0.7 |
| 5/25/09 | 3.8 |
| 5/25/09 | 0.6 |
| 5/25/09 | 1.1 |
| 5/25/09 | 1.1 |
| 5/25/09 | 1.3 |
| 5/25/09 | 1.9 |
| 5/25/09 | 3.5 |
| 5/25/09 | 0.1 |
| 5/25/09 | 0.6 |
| 5/24/09 | 1 |
| 5/24/09 | 1.2 |
| 5/24/09 | 1 |
| 5/24/09 | 0.3 |
| 5/24/09 | 0.7 |
| 5/24/09 | 0.6 |
| 5/24/09 | 1.3 |
| 5/24/09 | 1.2 |
| 5/24/09 | 0.7 |
| 5/24/09 | -0.1 |
| 5/24/09 | 0.6 |
| 5/24/09 | 1.7 |
| 5/24/09 | -0.1 |
| 5/24/09 | 0.9 |
| 5/24/09 | 0.6 |
| 5/24/09 | 0.9 |
| 5/24/09 | 1.1 |
| 5/24/09 | 1.2 |
| 5/24/09 | 0.7 |
| 5/24/09 | 1.3 |
| 5/24/09 | 0.7 |
| 5/24/09 | 0.4 |
| 5/24/09 | -0.7 |
| 5/24/09 | 0.5 |
| 5/24/09 | 0.5 |
| 5/24/09 | 0.9 |
| 5/24/09 | 2.4 |
| 5/24/09 | 0.6 |
| 5/24/09 | 1.6 |
| 5/24/09 | 0.6 |
| 5/24/09 | 0.7 |
| 5/24/09 | 1.6 |
| 5/24/09 | 0.7 |
| 5/24/09 | 1.8 |
| 5/24/09 | 0.5 |
| 5/24/09 | 1.8 |
| 5/24/09 | 1.6 |
| 5/24/09 | 1.8 |
| 5/24/09 | 1.4 |
| 5/24/09 | 3.1 |
| 5/24/09 | 0.8 |
| 5/24/09 | 0.5 |
| 5/24/09 | 1.4 |
| 5/24/09 | 0.6 |
| 5/24/09 | 1 |
| 5/24/09 | 1 |
| 5/24/09 | 1.1 |
| 5/24/09 | 0.6 |
| 5/23/09 | -0.3 |
| 5/23/09 | 0.3 |
| 5/23/09 | 0.3 |
| 5/23/09 | 0.8 |
| 5/23/09 | 0.1 |
| 5/23/09 | 0.4 |
| 5/23/09 | 0 |
| 5/23/09 | 1.1 |
| 5/23/09 | 0.8 |
| 5/23/09 | -0.3 |
| 5/23/09 | 1.4 |
| 5/23/09 | 0.6 |
| 5/23/09 | 1.5 |
| 5/23/09 | 1.1 |
| 5/23/09 | -0.1 |
| 5/23/09 | -0.1 |
| 5/23/09 | 0.6 |
| 5/23/09 | 0.4 |
| 5/23/09 | 0.3 |
| 5/23/09 | 1.4 |
| 5/23/09 | 1.8 |
| 5/23/09 | 1.4 |
| 5/23/09 | 0.7 |
| 5/23/09 | 0.7 |
| 5/23/09 | 1 |
| 5/23/09 | 0.4 |
| 5/23/09 | 0.2 |
| 5/23/09 | 0.3 |
| 5/23/09 | 0.2 |
| 5/23/09 | -0.1 |
| 5/23/09 | 0.7 |
| 5/23/09 | 0.8 |
| 5/23/09 | 1.2 |
| 5/23/09 | 1.4 |
| 5/23/09 | 1 |
| 5/23/09 | 4.2 |
| 5/23/09 | 2.3 |
| 5/23/09 | 2.6 |
| 5/23/09 | 4.5 |
| 5/23/09 | 2.5 |
| 5/23/09 | 1.6 |
| 5/23/09 | 3.3 |
| 5/23/09 | 2 |
| 5/23/09 | 3.2 |
| 5/23/09 | 4.9 |
| 5/23/09 | 2.3 |
| 5/23/09 | 4.5 |
| 5/23/09 | 7.6 |
| 5/22/09 | 6.2 |
| 5/22/09 | 2.5 |
| 5/22/09 | 1.9 |
| 5/22/09 | 0.6 |
| 5/22/09 | 0.6 |
| 5/22/09 | -0.2 |
| 5/22/09 | 0.5 |
| 5/22/09 | 0.7 |
| 5/22/09 | 0.5 |
| 5/22/09 | 0 |
| 5/22/09 | -0.1 |
| 5/22/09 | 0.3 |
| 5/22/09 | 0.6 |
| 5/22/09 | 0.6 |
| 5/22/09 | 1.3 |
| 5/22/09 | 0.9 |
| 5/22/09 | 0.4 |
| 5/22/09 | 1.3 |
| 5/22/09 | 0.7 |
| 5/22/09 | 0.5 |
| 5/22/09 | 0.4 |
| 5/22/09 | 0.6 |
| 5/22/09 | 1.3 |
| 5/22/09 | -0.2 |
| 5/22/09 | 1 |
| 5/22/09 | 0.7 |
| 5/22/09 | 1.3 |
| 5/22/09 | 0.8 |
| 5/22/09 | 0 |
| 5/22/09 | 0 |
| 5/22/09 | 0.3 |
| 5/22/09 | 0.5 |
| 5/22/09 | 0.1 |
| 5/22/09 | 0.2 |
| 5/22/09 | 0.6 |
| 5/22/09 | 0.7 |
| 5/22/09 | 2.9 |
| 5/22/09 | 3.5 |
| 5/22/09 | 2.7 |
| 5/22/09 | 3.3 |
| 5/22/09 | 1.1 |
| 5/22/09 | 2 |
| 5/22/09 | 1.8 |
| 5/22/09 | 1.2 |
| 5/22/09 | 1.1 |
| 5/22/09 | 0.9 |
| 5/22/09 | 2 |
| 5/22/09 | 4.5 |
| 5/21/09 | 1.2 |
| 5/21/09 | 1.2 |
| 5/21/09 | -0.3 |
| 5/21/09 | 1.2 |
| 5/21/09 | 0.7 |
| 5/21/09 | 1 |
| 5/21/09 | 1 |
| 5/21/09 | -0.1 |
| 5/21/09 | 0.8 |
| 5/21/09 | 0.4 |
| 5/21/09 | 1.3 |
| 5/21/09 | 1.8 |
| 5/21/09 | 0 |
| 5/21/09 | -0.3 |
| 5/21/09 | 0.7 |
| 5/21/09 | 0.2 |
| 5/21/09 | 1.5 |
| 5/21/09 | 0 |
| 5/21/09 | 0.6 |
| 5/21/09 | 0.5 |
| 5/21/09 | 0.6 |
| 5/21/09 | 0.6 |
| 5/21/09 | 0.5 |
| 5/21/09 | 1.5 |
| 5/21/09 | 0.4 |
| 5/21/09 | 0.1 |
| 5/21/09 | 1.2 |
| 5/21/09 | 0.6 |
| 5/21/09 | 1.2 |
| 5/21/09 | 0.4 |
| 5/21/09 | 0.6 |
| 5/21/09 | 1.8 |
| 5/21/09 | 1.1 |
| 5/21/09 | 1 |
| 5/21/09 | 0.8 |
| 5/21/09 | 0.6 |
| 5/21/09 | 2.2 |
| 5/21/09 | 0.9 |
| 5/21/09 | 4.1 |
| 5/21/09 | 5.6 |
| 5/21/09 | 1.1 |
| 5/21/09 | 1.5 |
| 5/21/09 | 2.8 |
| 5/21/09 | 0.8 |
| 5/21/09 | 0.8 |
| 5/21/09 | 0 |
| 5/21/09 | 0 |
| 5/21/09 | 1.2 |
| 5/20/09 | 0.7 |
| 5/20/09 | 0.7 |
| 5/20/09 | 0 |
| 5/20/09 | 1 |
| 5/20/09 | 0.2 |
| 5/20/09 | 0.1 |
| 5/20/09 | 0.4 |
| 5/20/09 | 0.6 |
| 5/20/09 | 0.8 |
| 5/20/09 | 1.2 |
| 5/20/09 | 0.3 |
| 5/20/09 | 0.5 |
| 5/20/09 | 0.4 |
| 5/20/09 | 0.5 |
| 5/20/09 | 0.9 |
| 5/20/09 | 0.6 |
| 5/20/09 | 1.5 |
| 5/20/09 | 0.9 |
| 5/20/09 | 0.3 |
| 5/20/09 | 0.7 |
| 5/20/09 | 0.4 |
| 5/20/09 | 0.7 |
| 5/20/09 | 1.6 |
| 5/20/09 | 1.1 |
| 5/20/09 | 0 |
| 5/20/09 | -0.4 |
| 5/20/09 | 1.1 |
| 5/20/09 | 1.1 |
| 5/20/09 | 1 |
| 5/20/09 | 0.5 |
| 5/20/09 | 0.9 |
| 5/20/09 | 0.8 |
| 5/20/09 | 1.6 |
| 5/20/09 | 1.5 |
| 5/20/09 | 1 |
| 5/20/09 | 1.8 |
| 5/20/09 | 1.1 |
| 5/20/09 | 1.6 |
| 5/20/09 | 1.1 |
| 5/20/09 | 2.6 |
| 5/20/09 | 0.6 |
| 5/20/09 | 1.5 |
| 5/20/09 | 1 |
| 5/20/09 | 1.5 |
| 5/20/09 | 3.5 |
| 5/20/09 | 2.9 |
| 5/20/09 | 1.6 |
| 5/20/09 | 1.5 |
| 5/19/09 | 1.5 |
| 5/19/09 | 1.2 |
| 5/19/09 | 1.3 |
| 5/19/09 | 1.6 |
| 5/19/09 | 1.6 |
| 5/19/09 | 1.2 |
| 5/19/09 | 0.2 |
| 5/19/09 | 1.2 |
| 5/19/09 | 1.6 |
| 5/19/09 | 0.8 |
| 5/19/09 | 1.9 |
| 5/19/09 | 1.9 |
| 5/19/09 | 2.3 |
| 5/19/09 | 2 |
| 5/19/09 | 1.9 |
| 5/19/09 | 1.1 |
| 5/19/09 | 2.4 |
| 5/19/09 | 1.5 |
| 5/19/09 | 2.1 |
| 5/19/09 | 1.8 |
| 5/19/09 | 1 |
| 5/19/09 | 1 |
| 5/19/09 | 3.7 |
| 5/19/09 | 2.5 |
| 5/19/09 | 1.9 |
| 5/19/09 | 1.7 |
| 5/19/09 | 1.6 |
| 5/19/09 | 1.3 |
| 5/19/09 | 1.7 |
| 5/19/09 | 3.3 |
| 5/19/09 | 1.2 |
| 5/19/09 | 1.5 |
| 5/19/09 | 3.4 |
| 5/19/09 | 2.1 |
| 5/19/09 | 1.4 |
| 5/19/09 | 1.8 |
| 5/19/09 | 1.3 |
| 5/19/09 | 1.7 |
| 5/19/09 | 1.1 |
| 5/19/09 | 2.3 |
| 5/19/09 | 3.4 |
| 5/19/09 | 1.2 |
| 5/19/09 | 1.8 |
| 5/19/09 | 2.4 |
| 5/19/09 | 1.5 |
| 5/19/09 | 1.9 |
| 5/19/09 | 1.5 |
| 5/19/09 | 0.9 |
| 5/18/09 | 1.3 |
| 5/18/09 | 2 |
| 5/18/09 | 2.2 |
| 5/18/09 | 1 |
| 5/18/09 | 0.9 |
| 5/18/09 | 1.5 |
| 5/18/09 | 2.6 |
| 5/18/09 | 2.2 |
| 5/18/09 | 7.2 |
| 5/18/09 | 1.8 |
| 5/18/09 | 1.4 |
| 5/18/09 | 1 |
| 5/18/09 | 1.9 |
| 5/18/09 | 2.6 |
| 5/18/09 | 1.8 |
| 5/18/09 | 1.6 |
| 5/18/09 | 1.4 |
| 5/18/09 | 2.1 |
| 5/18/09 | 1.9 |
| 5/18/09 | 1.9 |
| 5/18/09 | 1.6 |
| 5/18/09 | 1.7 |
| 5/18/09 | 2.2 |
| 5/18/09 | 2.9 |
| 5/18/09 | 2.3 |
| 5/18/09 | 2.1 |
| 5/18/09 | 4.1 |
| 5/18/09 | 1.5 |
| 5/18/09 | 1.8 |
| 5/18/09 | 1.3 |
| 5/18/09 | 1.9 |
| 5/18/09 | 2.8 |
| 5/18/09 | 1.2 |
| 5/18/09 | 1.8 |
| 5/18/09 | 0.5 |
| 5/18/09 | 1.8 |
| 5/18/09 | 1.9 |
| 5/18/09 | 2.8 |
| 5/18/09 | 1.6 |
| 5/18/09 | 2 |
| 5/18/09 | 1.6 |
| 5/18/09 | 2.1 |
| 5/18/09 | 1.5 |
| 5/18/09 | 1.7 |
| 5/18/09 | 1.8 |
| 5/18/09 | 2 |
| 5/18/09 | 2.5 |
| 5/18/09 | 1 |
| 5/17/09 | 1.1 |
| 5/17/09 | 1.9 |
| 5/17/09 | 1.5 |
| 5/17/09 | 3.3 |
| 5/17/09 | 1.5 |
| 5/17/09 | 1.7 |
| 5/17/09 | 2.5 |
| 5/17/09 | 2.6 |
| 5/17/09 | 1.3 |
| 5/17/09 | 1.9 |
| 5/17/09 | 2 |
| 5/17/09 | 2.1 |
| 5/17/09 | 0.9 |
| 5/17/09 | 1.2 |
| 5/17/09 | 1.9 |
| 5/17/09 | 1.7 |
| 5/17/09 | 0.3 |
| 5/17/09 | 1.6 |
| 5/17/09 | 2.4 |
| 5/17/09 | 2 |
| 5/17/09 | 1.5 |
| 5/17/09 | 2.6 |
| 5/17/09 | 15.7 |
| 5/17/09 | 1.8 |
| 5/17/09 | 0.6 |
| 5/17/09 | 2.1 |
| 5/17/09 | 2.8 |
| 5/17/09 | 1.2 |
| 5/17/09 | 2.2 |
| 5/17/09 | 1.2 |
| 5/17/09 | 1 |
| 5/17/09 | 1.9 |
| 5/17/09 | 2.2 |
| 5/17/09 | 3.1 |
| 5/17/09 | 1.4 |
| 5/17/09 | 1.6 |
| 5/17/09 | 7 |
| 5/17/09 | 2 |
| 5/17/09 | 1.6 |
| 5/17/09 | 2 |
| 5/17/09 | 2.1 |
| 5/17/09 | 1.4 |
| 5/17/09 | 2.8 |
| 5/17/09 | 3.8 |
| 5/17/09 | 1.8 |
| 5/17/09 | 1.3 |
| 5/17/09 | 2 |
| 5/17/09 | 2.6 |
| 5/16/09 | 0.9 |
| 5/16/09 | 1.8 |
| 5/16/09 | 1.9 |
| 5/16/09 | 2.5 |
| 5/16/09 | 1.6 |
| 5/16/09 | 2 |
| 5/16/09 | 2.4 |
| 5/16/09 | 2.8 |
| 5/16/09 | 2.8 |
| 5/16/09 | 3.7 |
| 5/16/09 | 1.5 |
| 5/16/09 | 2.4 |
| 5/16/09 | 2.2 |
| 5/16/09 | 2.1 |
| 5/16/09 | 1.4 |
| 5/16/09 | 1.4 |
| 5/16/09 | 2 |
| 5/16/09 | 1.5 |
| 5/16/09 | 1.1 |
| 5/16/09 | 1.3 |
| 5/16/09 | 1.8 |
| 5/16/09 | 1.8 |
| 5/16/09 | 2.5 |
| 5/16/09 | 3.2 |
| 5/16/09 | 0.8 |
| 5/16/09 | 1.3 |
| 5/16/09 | 1 |
| 5/16/09 | 1.1 |
| 5/16/09 | 1.4 |
| 5/16/09 | 2 |
| 5/16/09 | 1.1 |
| 5/16/09 | 1.5 |
| 5/16/09 | 1.9 |
| 5/16/09 | 1.4 |
| 5/16/09 | 1.9 |
| 5/16/09 | 1.5 |
| 5/16/09 | 1.9 |
| 5/16/09 | 2.1 |
| 5/16/09 | 0.4 |
| 5/16/09 | 1.6 |
| 5/16/09 | 1.8 |
| 5/16/09 | 0.7 |
| 5/16/09 | 1.8 |
| 5/16/09 | 0.8 |
| 5/16/09 | 18.2 |
| 5/16/09 | 1.6 |
| 5/16/09 | 1 |
| 5/16/09 | 1.4 |
| 5/15/09 | 1.7 |
| 5/15/09 | 2.6 |
| 5/15/09 | 1.1 |
| 5/15/09 | 1.6 |
| 5/15/09 | 1.7 |
| 5/15/09 | 1.4 |
| 5/15/09 | 1.5 |
| 5/15/09 | 0.9 |
| 5/15/09 | 1.7 |
| 5/15/09 | 1.4 |
| 5/15/09 | 1.4 |
| 5/15/09 | 1.3 |
| 5/15/09 | 1.5 |
| 5/15/09 | 1.5 |
| 5/15/09 | 0.9 |
| 5/15/09 | 2.7 |
| 5/15/09 | 1.2 |
| 5/15/09 | 1.7 |
| 5/15/09 | 1.5 |
| 5/15/09 | 2 |
| 5/15/09 | 2.4 |
| 5/15/09 | 2 |
| 5/15/09 | 1.2 |
| 5/15/09 | 1.4 |
| 5/15/09 | 0.7 |
| 5/15/09 | 1.2 |
| 5/15/09 | 1.4 |
| 5/15/09 | 0.6 |
| 5/15/09 | 2.1 |
| 5/15/09 | 1 |
| 5/15/09 | 2.2 |
| 5/15/09 | 2 |
| 5/15/09 | 2.1 |
| 5/15/09 | 1.5 |
| 5/15/09 | 1.9 |
| 5/15/09 | 2 |
| 5/15/09 | 2.7 |
| 5/15/09 | 1.5 |
| 5/15/09 | 1.6 |
| 5/15/09 | 2.3 |
| 5/15/09 | 2.5 |
| 5/15/09 | 2.2 |
| 5/15/09 | 2.1 |
| 5/15/09 | 2.2 |
| 5/15/09 | 2.4 |
| 5/15/09 | 2 |
| 5/15/09 | 2.2 |
| 5/15/09 | 2.1 |
| 5/14/09 | 1.8 |
| 5/14/09 | 2.4 |
| 5/14/09 | 3.1 |
| 5/14/09 | 2 |
| 5/14/09 | 1.7 |
| 5/14/09 | 1.9 |
| 5/14/09 | 2.3 |
| 5/14/09 | 2.9 |
| 5/14/09 | 2 |
| 5/14/09 | 2.4 |
| 5/14/09 | 2 |
| 5/14/09 | 2.9 |
| 5/14/09 | 1.6 |
| 5/14/09 | 2.5 |
| 5/14/09 | 2 |
| 5/14/09 | 2.4 |
| 5/14/09 | 2 |
| 5/14/09 | 2.6 |
| 5/14/09 | 2.3 |
| 5/14/09 | 2.3 |
| 5/14/09 | 2.1 |
| 5/14/09 | 2.6 |
| 5/14/09 | 1.7 |
| 5/14/09 | 1.5 |
| 5/14/09 | 3.3 |
| 5/14/09 | 2.3 |
| 5/14/09 | 2.1 |
| 5/14/09 | 1.8 |
| 5/14/09 | 1.6 |
| 5/14/09 | 2.8 |
| 5/14/09 | 2.5 |
| 5/14/09 | 1.9 |
| 5/14/09 | 2 |
| 5/14/09 | 2 |
| 5/14/09 | 2.1 |
| 5/14/09 | 2.1 |
| 5/14/09 | 2 |
| 5/14/09 | 2.2 |
| 5/14/09 | 1.9 |
| 5/14/09 | 2.7 |
| 5/14/09 | 2.4 |
| 5/14/09 | 1.8 |
| 5/14/09 | 2.7 |
| 5/14/09 | 2.9 |
| 5/14/09 | 3.6 |
| 5/14/09 | 2 |
| 5/14/09 | 3.4 |
| 5/14/09 | 2.9 |
| 5/13/09 | 2.5 |
| 5/13/09 | 2.8 |
| 5/13/09 | 1.8 |
| 5/13/09 | 2.6 |
| 5/13/09 | 2.2 |
| 5/13/09 | 2.3 |
| 5/13/09 | 2.1 |
| 5/13/09 | 2.1 |
| 5/13/09 | 1.3 |
| 5/13/09 | 2.6 |
| 5/13/09 | 0.9 |
| 5/13/09 | 2.8 |
| 5/13/09 | 2.4 |
| 5/13/09 | 2.2 |
| 5/13/09 | 1.6 |
| 5/13/09 | 2.5 |
| 5/13/09 | 1.7 |
| 5/13/09 | 2.4 |
| 5/13/09 | 2.5 |
| 5/13/09 | 2.1 |
| 5/13/09 | 2.1 |
| 5/13/09 | 2.1 |
| 5/13/09 | 1.7 |
| 5/13/09 | 2.1 |
| 5/13/09 | 1.5 |
| 5/13/09 | 2 |
| 5/13/09 | 1.2 |
| 5/13/09 | 2.1 |
| 5/13/09 | 1.8 |
| 5/13/09 | 3.1 |
| 5/13/09 | 1.1 |
| 5/13/09 | 2.2 |
| 5/13/09 | 2 |
| 5/13/09 | 2.7 |
| 5/13/09 | 3.9 |
| 5/13/09 | 2.5 |
| 5/13/09 | 2.6 |
| 5/13/09 | 1.7 |
| 5/13/09 | 1 |
| 5/13/09 | 2.1 |
| 5/13/09 | 1.3 |
| 5/13/09 | 1.8 |
| 5/13/09 | 1 |
| 5/13/09 | 1.8 |
| 5/13/09 | 2.5 |
| 5/13/09 | 3.3 |
| 5/13/09 | 3.1 |
| 5/13/09 | 2 |
| 5/12/09 | 2 |
| 5/12/09 | 2.9 |
| 5/12/09 | 1 |
| 5/12/09 | 2 |
| 5/12/09 | 1.6 |
| 5/12/09 | 2.1 |
| 5/12/09 | 2 |
| 5/12/09 | 1.4 |
| 5/12/09 | 1.9 |
| 5/12/09 | 2.2 |
| 5/12/09 | 1.1 |
| 5/12/09 | 2 |
| 5/12/09 | 1.5 |
| 5/12/09 | 1 |
| 5/12/09 | 2.1 |
| 5/12/09 | 0.9 |
| 5/12/09 | 1.6 |
| 5/12/09 | 1.2 |
| 5/12/09 | 2.3 |
| 5/12/09 | 1.8 |
| 5/12/09 | 1.6 |
| 5/12/09 | 0.9 |
| 5/12/09 | 1.5 |
| 5/12/09 | 1.6 |
| 5/12/09 | 0.8 |
| 5/12/09 | 2.4 |
| 5/12/09 | 1.9 |
| 5/12/09 | 1.3 |
| 5/12/09 | 1.2 |
| 5/12/09 | 0.7 |
| 5/12/09 | 2 |
| 5/12/09 | 1.4 |
| 5/12/09 | 1.9 |
| 5/12/09 | 1.2 |
| 5/12/09 | 2 |
| 5/12/09 | 2.4 |
| 5/12/09 | 2.2 |
| 5/12/09 | 2.2 |
| 5/12/09 | 2.2 |
| 5/12/09 | 1.3 |
| 5/12/09 | 1.8 |
| 5/12/09 | 2.9 |
| 5/12/09 | 2.1 |
| 5/12/09 | 2.2 |
| 5/12/09 | 2.5 |
| 5/12/09 | 1.2 |
| 5/12/09 | 1.8 |
| 5/12/09 | 1.7 |
| 5/11/09 | 1.4 |
| 5/11/09 | 2.4 |
| 5/11/09 | 2 |
| 5/11/09 | 1.5 |
| 5/11/09 | 4.8 |
| 5/11/09 | 2.2 |
| 5/11/09 | 1.8 |
| 5/11/09 | 1.9 |
| 5/11/09 | 2.9 |
| 5/11/09 | 1.9 |
| 5/11/09 | 2.3 |
| 5/11/09 | 1.6 |
| 5/11/09 | 1.7 |
| 5/11/09 | 2.3 |
| 5/11/09 | 1.3 |
| 5/11/09 | 1.6 |
| 5/11/09 | 1 |
| 5/11/09 | 0.9 |
| 5/11/09 | 1.3 |
| 5/11/09 | 2.5 |
| 5/11/09 | 1.2 |
| 5/11/09 | 1.5 |
| 5/11/09 | 2.2 |
| 5/11/09 | 1.1 |
| 5/11/09 | 1.4 |
| 5/11/09 | 1.8 |
| 5/11/09 | 1 |
| 5/11/09 | 2.3 |
| 5/11/09 | 1.8 |
| 5/11/09 | 2 |
| 5/11/09 | 1.5 |
| 5/11/09 | 1.9 |
| 5/11/09 | 1.6 |
| 5/11/09 | 2.3 |
| 5/11/09 | 1.9 |
| 5/11/09 | 1.8 |
| 5/11/09 | 2.4 |
| 5/11/09 | 1.7 |
| 5/11/09 | 1.7 |
| 5/11/09 | 2.4 |
| 5/11/09 | 2.3 |
| 5/11/09 | 2 |
| 5/11/09 | 1.6 |
| 5/11/09 | 2.2 |
| 5/11/09 | 2.4 |
| 5/11/09 | 2.3 |
| 5/11/09 | 1.9 |
| 5/11/09 | 2.3 |
| 5/10/09 | 2.9 |
| 5/10/09 | 2.1 |
| 5/10/09 | 1.6 |
| 5/10/09 | 1.9 |
| 5/10/09 | 1.7 |
| 5/10/09 | 2.2 |
| 5/10/09 | 2.2 |
| 5/10/09 | 1.6 |
| 5/10/09 | 2 |
| 5/10/09 | 2.6 |
| 5/10/09 | 1.7 |
| 5/10/09 | 2.2 |
| 5/10/09 | 1.5 |
| 5/10/09 | 2.7 |
| 5/10/09 | 2.3 |
| 5/10/09 | 2.2 |
| 5/10/09 | 1.3 |
| 5/10/09 | 1.9 |
| 5/10/09 | 1.9 |
| 5/10/09 | 1.3 |
| 5/10/09 | 1.4 |
| 5/10/09 | 0.9 |
| 5/10/09 | 1.5 |
| 5/10/09 | 1.5 |
| 5/10/09 | 2 |
| 5/10/09 | 1.8 |
| 5/10/09 | 1.1 |
| 5/10/09 | 1.2 |
| 5/10/09 | 2.1 |
| 5/10/09 | 1.5 |
| 5/10/09 | 2.1 |
| 5/10/09 | 1.7 |
| 5/10/09 | 1.5 |
| 5/10/09 | 0.7 |
| 5/10/09 | 1.5 |
| 5/10/09 | 1.7 |
| 5/10/09 | 1.9 |
| 5/10/09 | 2.6 |
| 5/10/09 | 2.1 |
| 5/10/09 | 1.2 |
| 5/10/09 | 1.4 |
| 5/10/09 | 1.5 |
| 5/10/09 | 2.5 |
| 5/10/09 | 1.5 |
| 5/10/09 | 1.8 |
| 5/10/09 | 0.3 |
| 5/10/09 | 1.2 |
| 5/10/09 | 1.3 |
| 5/9/09 | 1.5 |
| 5/9/09 | 1.3 |
| 5/9/09 | 1.7 |
| 5/9/09 | 1.5 |
| 5/9/09 | 1.7 |
| 5/9/09 | 1.7 |
| 5/9/09 | 1.3 |
| 5/9/09 | 1.2 |
| 5/9/09 | 1.4 |
| 5/9/09 | 2.1 |
| 5/9/09 | 0.8 |
| 5/9/09 | 1.8 |
| 5/9/09 | 1.7 |
| 5/9/09 | 2 |
| 5/9/09 | 1.7 |
| 5/9/09 | 1.4 |
| 5/9/09 | 2 |
| 5/9/09 | 2.7 |
| 5/9/09 | 1 |
| 5/9/09 | 1.6 |
| 5/9/09 | 1.3 |
| 5/9/09 | 0.8 |
| 5/9/09 | 1.2 |
| 5/9/09 | 2.2 |
| 5/9/09 | 1.5 |
| 5/9/09 | 1.3 |
| 5/9/09 | 1.7 |
| 5/9/09 | 1.2 |
| 5/9/09 | 2.2 |
| 5/9/09 | 1.2 |
| 5/9/09 | 2.1 |
| 5/9/09 | 2.4 |
| 5/9/09 | 1.7 |
| 5/9/09 | 1.6 |
| 5/9/09 | 2.4 |
| 5/9/09 | 2 |
| 5/9/09 | 2.3 |
| 5/9/09 | 3.1 |
| 5/9/09 | 1.9 |
| 5/9/09 | 1.9 |
| 5/9/09 | 1.5 |
| 5/9/09 | 2.2 |
| 5/9/09 | 2.2 |
| 5/9/09 | 2 |
| 5/9/09 | 2 |
| 5/9/09 | 1.4 |
| 5/9/09 | 2.5 |
| 5/9/09 | 1 |
| 5/8/09 | 2.6 |
| 5/8/09 | 2.4 |
| 5/8/09 | 2.1 |
| 5/8/09 | 2.1 |
| 5/8/09 | 2.3 |
| 5/8/09 | 1.2 |
| 5/8/09 | 1.9 |
| 5/8/09 | 2.1 |
| 5/8/09 | 2.5 |
| 5/8/09 | 2.3 |
| 5/8/09 | 2.3 |
| 5/8/09 | 1.6 |
| 5/8/09 | 1.6 |
| 5/8/09 | 2.2 |
| 5/8/09 | 2.1 |
| 5/8/09 | 0.7 |
| 5/8/09 | 1.2 |
| 5/8/09 | 1.5 |
| 5/8/09 | 1.4 |
| 5/8/09 | 1.8 |
| 5/8/09 | 1.3 |
| 5/8/09 | 1.6 |
| 5/8/09 | 2 |
| 5/8/09 | 1.5 |
| 5/8/09 | 1.3 |
| 5/8/09 | 1.9 |
| 5/8/09 | 0.7 |
| 5/8/09 | 0.3 |
| 5/8/09 | 2 |
| 5/8/09 | 1.4 |
| 5/8/09 | 1 |
| 5/8/09 | 1.7 |
| 5/8/09 | 2.4 |
| 5/8/09 | 1.2 |
| 5/8/09 | 1.8 |
| 5/8/09 | 2.3 |
| 5/8/09 | 1.1 |
| 5/8/09 | 1.6 |
| 5/8/09 | 1.9 |
| 5/8/09 | 1.7 |
| 5/8/09 | 2.4 |
| 5/8/09 | 1.7 |
| 5/8/09 | 0.6 |
| 5/8/09 | 2.4 |
| 5/8/09 | 2.5 |
| 5/8/09 | 1.8 |
| 5/8/09 | 3 |
| 5/8/09 | 1.9 |
| 5/7/09 | 1.7 |
| 5/7/09 | 1.6 |
| 5/7/09 | 1.4 |
| 5/7/09 | 1.3 |
| 5/7/09 | 1.2 |
| 5/7/09 | 1.4 |
| 5/7/09 | 2.7 |
| 5/7/09 | 0.7 |
| 5/7/09 | 1.8 |
| 5/7/09 | 2.4 |
| 5/7/09 | 1.4 |
| 5/7/09 | 2.4 |
| 5/7/09 | 1.9 |
| 5/7/09 | 1.8 |
| 5/7/09 | 1.8 |
| 5/7/09 | 1.4 |
| 5/7/09 | 1.6 |
| 5/7/09 | 2 |
| 5/7/09 | 1.5 |
| 5/7/09 | 1.4 |
| 5/7/09 | 1.7 |
| 5/7/09 | 1.7 |
| 5/7/09 | 2.4 |
| 5/7/09 | 1.7 |
| 5/7/09 | 2.4 |
| 5/7/09 | 2.3 |
| 5/7/09 | 1.6 |
| 5/7/09 | 1.4 |
| 5/7/09 | 2.3 |
| 5/7/09 | 2.9 |
| 5/7/09 | 1.6 |
| 5/7/09 | 2.3 |
| 5/7/09 | 2.5 |
| 5/7/09 | 2.3 |
| 5/7/09 | 2.2 |
| 5/7/09 | 1.6 |
| 5/7/09 | 2.7 |
| 5/7/09 | 1.9 |
| 5/7/09 | 2.3 |
| 5/7/09 | 2.2 |
| 5/7/09 | 2.5 |
| 5/7/09 | 1.7 |
| 5/7/09 | 1.8 |
| 5/7/09 | 1.4 |
| 5/7/09 | 2.7 |
| 5/7/09 | 0.8 |
| 5/7/09 | 2.2 |
| 5/7/09 | 2 |
| 5/6/09 | 1.2 |
| 5/6/09 | 2 |
| 5/6/09 | 2 |
| 5/6/09 | 2.7 |
| 5/6/09 | 2.1 |
| 5/6/09 | 2.6 |
| 5/6/09 | 1.9 |
| 5/6/09 | 2.4 |
| 5/6/09 | 2 |
| 5/6/09 | 1.5 |
| 5/6/09 | 1.7 |
| 5/6/09 | 1.4 |
| 5/6/09 | 2.5 |
| 5/6/09 | 2.6 |
| 5/6/09 | 2.5 |
| 5/6/09 | 2.4 |
| 5/6/09 | 2 |
| 5/6/09 | 2 |
| 5/6/09 | 1.1 |
| 5/6/09 | 2.2 |
| 5/6/09 | 1.1 |
| 5/6/09 | 0.9 |
| 5/6/09 | 2 |
| 5/6/09 | 1.6 |
| 5/6/09 | 2.1 |
| 5/6/09 | 1.4 |
| 5/6/09 | 2.2 |
| 5/6/09 | 1.9 |
| 5/6/09 | 1.8 |
| 5/6/09 | 1.8 |
| 5/6/09 | 0.4 |
| 5/6/09 | 0.9 |
| 5/6/09 | 1.4 |
| 5/6/09 | 0.7 |
| 5/6/09 | 2.5 |
| 5/6/09 | 1.8 |
| 5/6/09 | 1.7 |
| 5/6/09 | 2.5 |
| 5/6/09 | 2 |
| 5/6/09 | 1.5 |
| 5/6/09 | 2.8 |
| 5/6/09 | 3 |
| 5/6/09 | 2.5 |
| 5/6/09 | 2.2 |
| 5/6/09 | 2.6 |
| 5/6/09 | 1.9 |
| 5/6/09 | 2.8 |
| 5/6/09 | 3 |
| 5/5/09 | 2.8 |
| 5/5/09 | 2.8 |
| 5/5/09 | 1.8 |
| 5/5/09 | 2 |
| 5/5/09 | 2.6 |
| 5/5/09 | 3.5 |
| 5/5/09 | 1.8 |
| 5/5/09 | 2.7 |
| 5/5/09 | 3.1 |
| 5/5/09 | 2.4 |
| 5/5/09 | 1.8 |
| 5/5/09 | 2.3 |
| 5/5/09 | 2 |
| 5/5/09 | 1.8 |
| 5/5/09 | 3.2 |
| 5/5/09 | 1.7 |
| 5/5/09 | 2.1 |
| 5/5/09 | 2 |
| 5/5/09 | 1.6 |
| 5/5/09 | 2 |
| 5/5/09 | 2 |
| 5/5/09 | 2 |
| 5/5/09 | 2 |
| 5/5/09 | 1.7 |
| 5/5/09 | 1.9 |
| 5/5/09 | 2.2 |
| 5/5/09 | 1.7 |
| 5/5/09 | 1.7 |
| 5/5/09 | 2.7 |
| 5/5/09 | 2.2 |
| 5/5/09 | 1.4 |
| 5/5/09 | 0.9 |
| 5/5/09 | 2.7 |
| 5/5/09 | 1 |
| 5/5/09 | 1.4 |
| 5/5/09 | 2.1 |
| 5/5/09 | 1.6 |
| 5/5/09 | 1.5 |
| 5/5/09 | 2.6 |
| 5/5/09 | 3.2 |
| 5/5/09 | 2.8 |
| 5/5/09 | 2.5 |
| 5/5/09 | 2 |
| 5/5/09 | 1.9 |
| 5/5/09 | 2.4 |
| 5/5/09 | 2 |
| 5/5/09 | 2.2 |
| 5/5/09 | 1.6 |
| 5/4/09 | 3 |
| 5/4/09 | 3.1 |
| 5/4/09 | 1.8 |
| 5/4/09 | 1.8 |
| 5/4/09 | 3.1 |
| 5/4/09 | 2.4 |
| 5/4/09 | 2.3 |
| 5/4/09 | 1.8 |
| 5/4/09 | 2.2 |
| 5/4/09 | 2.3 |
| 5/4/09 | 2.3 |
| 5/4/09 | 2.2 |
| 5/4/09 | 1.5 |
| 5/4/09 | 3.2 |
| 5/4/09 | 2.9 |
| 5/4/09 | 1.7 |
| 5/4/09 | 2.1 |
| 5/4/09 | 1.5 |
| 5/4/09 | 1.9 |
| 5/4/09 | 2.5 |
| 5/4/09 | 1.9 |
| 5/4/09 | 1.3 |
| 5/4/09 | 1.8 |
| 5/4/09 | 1.4 |
| 5/4/09 | 1.8 |
| 5/4/09 | 1.7 |
| 5/4/09 | 1.8 |
| 5/4/09 | 0.8 |
| 5/4/09 | 1.3 |
| 5/4/09 | 1.6 |
| 5/4/09 | 0.8 |
| 5/4/09 | 1.4 |
| 5/4/09 | 0.9 |
| 5/4/09 | 1.5 |
| 5/4/09 | 2.5 |
| 5/4/09 | 1.6 |
| 5/4/09 | 2.1 |
| 5/4/09 | 1 |
| 5/4/09 | 2 |
| 5/4/09 | 1.1 |
| 5/4/09 | 2.4 |
| 5/4/09 | 0.9 |
| 5/4/09 | 1.2 |
| 5/4/09 | 1.8 |
| 5/4/09 | 1.5 |
| 5/4/09 | 1.9 |
| 5/4/09 | 1.4 |
| 5/4/09 | 1 |
| 5/3/09 | 1.4 |
| 5/3/09 | 1.3 |
| 5/3/09 | 0.7 |
| 5/3/09 | 1.6 |
| 5/3/09 | 1.1 |
| 5/3/09 | 1.4 |
| 5/3/09 | 1.4 |
| 5/3/09 | 0.3 |
| 5/3/09 | 1.7 |
| 5/3/09 | 2.1 |
| 5/3/09 | 0 |
| 5/3/09 | 0.7 |
| 5/3/09 | 0.7 |
| 5/3/09 | 1.7 |
| 5/3/09 | 1.4 |
| 5/3/09 | 2.1 |
| 5/3/09 | 0.8 |
| 5/3/09 | 1.1 |
| 5/3/09 | 1.9 |
| 5/3/09 | 2.8 |
| 5/3/09 | 1.3 |
| 5/3/09 | 1.5 |
| 5/3/09 | 0.9 |
| 5/3/09 | 2.2 |
| 5/3/09 | 1.2 |
| 5/3/09 | 1 |
| 5/3/09 | 1.1 |
| 5/3/09 | 1.7 |
| 5/3/09 | 1.7 |
| 5/3/09 | 0.8 |
| 5/3/09 | 0.8 |
| 5/3/09 | 0.8 |
| 5/3/09 | 1.3 |
| 5/3/09 | 1.3 |
| 5/3/09 | 1.2 |
| 5/3/09 | 1.5 |
| 5/3/09 | 2.1 |
| 5/3/09 | 1.9 |
| 5/3/09 | 0.2 |
| 5/3/09 | 1.2 |
| 5/3/09 | 0 |
| 5/3/09 | 1.2 |
| 5/3/09 | 1 |
| 5/3/09 | 1.8 |
| 5/3/09 | 1.8 |
| 5/3/09 | 1.9 |
| 5/3/09 | 1.5 |
| 5/3/09 | 1.9 |
| 5/2/09 | 1.4 |
| 5/2/09 | 0.8 |
| 5/2/09 | 0.6 |
| 5/2/09 | 0.5 |
| 5/2/09 | 1 |
| 5/2/09 | 1.5 |
| 5/2/09 | 1.2 |
| 5/2/09 | 0.6 |
| 5/2/09 | 0.8 |
| 5/2/09 | 0.5 |
| 5/2/09 | 1.2 |
| 5/2/09 | 1.4 |
| 5/2/09 | 0.6 |
| 5/2/09 | 0.8 |
| 5/2/09 | 1.2 |
| 5/2/09 | 2 |
| 5/2/09 | 1.8 |
| 5/2/09 | 1 |
| 5/2/09 | 0.9 |
| 5/2/09 | 1.2 |
| 5/2/09 | 1.5 |
| 5/2/09 | 1.4 |
| 5/2/09 | 0.7 |
| 5/2/09 | 0.9 |
| 5/2/09 | 0.9 |
| 5/2/09 | 0.8 |
| 5/2/09 | 1.6 |
| 5/2/09 | 0.4 |
| 5/2/09 | 1.4 |
| 5/2/09 | 0.6 |
| 5/2/09 | 1 |
| 5/2/09 | 1.2 |
| 5/2/09 | 0.7 |
| 5/2/09 | 1.5 |
| 5/2/09 | 0.9 |
| 5/2/09 | 1.1 |
| 5/2/09 | 1.2 |
| 5/2/09 | 0.7 |
| 5/2/09 | 1.1 |
| 5/2/09 | 0.9 |
| 5/2/09 | 1.2 |
| 5/2/09 | 1.7 |
| 5/2/09 | 0.9 |
| 5/2/09 | 1.9 |
| 5/2/09 | 0.7 |
| 5/2/09 | 1.3 |
| 5/2/09 | 1 |
| 5/2/09 | 0.1 |
| 5/1/09 | 0.7 |
| 5/1/09 | 1.1 |
| 5/1/09 | 1 |
| 5/1/09 | 0.8 |
| 5/1/09 | 0 |
| 5/1/09 | 0.8 |
| 5/1/09 | 1.5 |
| 5/1/09 | 1.8 |
| 5/1/09 | 1.6 |
| 5/1/09 | 1.6 |
| 5/1/09 | 0.6 |
| 5/1/09 | 1 |
| 5/1/09 | 1.3 |
| 5/1/09 | 1.8 |
| 5/1/09 | 1.9 |
| 5/1/09 | 1.6 |
| 5/1/09 | 1.4 |
| 5/1/09 | 0.7 |
| 5/1/09 | 1.9 |
| 5/1/09 | 0.9 |
| 5/1/09 | 1.5 |
| 5/1/09 | 1.3 |
| 5/1/09 | 0.7 |
| 5/1/09 | 1 |
| 5/1/09 | 2.6 |
| 5/1/09 | 1.6 |
| 5/1/09 | 1.3 |
| 5/1/09 | 0.7 |
| 5/1/09 | 0.9 |
| 5/1/09 | 2 |
| 5/1/09 | 1.6 |
| 5/1/09 | 1 |
| 5/1/09 | 1 |
| 5/1/09 | 1.3 |
| 5/1/09 | 1.6 |
| 5/1/09 | 1.3 |
| 5/1/09 | 1.2 |
| 5/1/09 | 0.9 |
| 5/1/09 | 1.6 |
| 5/1/09 | 0.6 |
| 5/1/09 | 1.3 |
| 5/1/09 | 2 |
| 5/1/09 | 1.7 |
| 5/1/09 | 1.3 |
| 5/1/09 | 1.9 |
| 5/1/09 | 1.4 |
| 5/1/09 | 2 |
| 5/1/09 | 1.4 |
| 4/30/09 | 1.4 |
| 4/30/09 | 1.2 |
| 4/30/09 | 1.5 |
| 4/30/09 | 1.5 |
| 4/30/09 | 1.6 |
| 4/30/09 | 1.5 |
| 4/30/09 | 1.2 |
| 4/30/09 | 1.5 |
| 4/30/09 | 0.8 |
| 4/30/09 | 1.2 |
| 4/30/09 | 0.8 |
| 4/30/09 | 1.7 |
| 4/30/09 | 1.7 |
| 4/30/09 | 1.4 |
| 4/30/09 | 1.6 |
| 4/30/09 | 1.8 |
| 4/30/09 | 2.4 |
| 4/30/09 | 1.4 |
| 4/30/09 | 1 |
| 4/30/09 | 0.8 |
| 4/30/09 | 0.9 |
| 4/30/09 | 0.7 |
| 4/30/09 | 1.9 |
| 4/30/09 | 1 |
| 4/30/09 | 1.3 |
| 4/30/09 | 1.3 |
| 4/30/09 | 0.8 |
| 4/30/09 | 2 |
| 4/30/09 | 2 |
| 4/30/09 | 1.6 |
| 4/30/09 | 1.9 |
| 4/30/09 | 2.4 |
| 4/30/09 | 1.1 |
| 4/30/09 | 1.4 |
| 4/30/09 | 2.2 |
| 4/30/09 | 0.8 |
| 4/30/09 | 2 |
| 4/30/09 | 1.9 |
| 4/30/09 | 2.2 |
| 4/30/09 | 0.8 |
| 4/30/09 | 1.3 |
| 4/30/09 | 0.8 |
| 4/30/09 | 1.6 |
| 4/30/09 | 1.8 |
| 4/30/09 | 1.5 |
| 4/30/09 | 0.7 |
| 4/30/09 | 1.4 |
| 4/30/09 | 2.1 |
| 4/29/09 | 0.8 |
| 4/29/09 | 1.6 |
| 4/29/09 | 1.5 |
| 4/29/09 | 1.1 |
| 4/29/09 | 0.8 |
| 4/29/09 | 1.6 |
| 4/29/09 | 0.6 |
| 4/29/09 | 1.8 |
| 4/29/09 | 1.8 |
| 4/29/09 | 1.3 |
| 4/29/09 | 106.3 |
| 4/29/09 | 106.2 |
| 4/29/09 | 106.8 |
| 4/29/09 | 106.2 |
| 4/29/09 | 105.5 |
| 4/29/09 | 105.7 |
| 4/29/09 | 105.3 |
| 4/29/09 | 104.8 |
| 4/29/09 | 104.7 |
| 4/29/09 | 105 |
| 4/29/09 | 103.9 |
| 4/29/09 | 103.8 |
| 4/29/09 | 103.9 |
| 4/29/09 | 103.8 |
| 4/29/09 | 103.5 |
| 4/29/09 | 103.3 |
| 4/29/09 | 103.2 |
| 4/29/09 | 103.5 |
| 4/29/09 | 103.5 |
| 4/29/09 | 103.5 |
| 4/29/09 | 102.3 |
| 4/29/09 | 100.6 |
| 4/29/09 | 101.3 |
| 4/29/09 | 103.9 |
| 4/29/09 | 105 |
| 4/29/09 | 105.2 |
| 4/29/09 | 105.4 |
| 4/29/09 | 105.6 |
| 4/29/09 | 106.2 |
| 4/29/09 | 106.1 |
| 4/29/09 | 105.5 |
| 4/29/09 | 105.4 |
| 4/29/09 | 105.1 |
| 4/29/09 | 105.6 |
| 4/29/09 | 106.5 |
| 4/29/09 | 106.9 |
| 4/29/09 | 105.8 |
| 4/29/09 | 106.3 |
| 4/28/09 | 107.1 |
| 4/28/09 | 107.6 |
| 4/28/09 | 108.3 |
| 4/28/09 | 108.6 |
| 4/28/09 | 108.6 |
| 4/28/09 | 108.7 |
| 4/28/09 | 107.6 |
| 4/28/09 | 109.3 |
| 4/28/09 | 106.4 |
| 4/28/09 | 109.1 |
| 4/28/09 | 107.2 |
| 4/28/09 | 110.1 |
| 4/28/09 | 110.2 |
| 4/28/09 | 110.7 |
| 4/28/09 | 110.8 |
| 4/28/09 | 111.2 |
| 4/28/09 | 111 |
| 4/28/09 | 110.4 |
| 4/28/09 | 110.1 |
| 4/28/09 | 110 |
| 4/28/09 | 108.5 |
| 4/28/09 | 108.8 |
| 4/28/09 | 108.2 |
| 4/28/09 | 108 |
| 4/28/09 | 108.4 |
| 4/28/09 | 108.5 |
| 4/28/09 | 108.7 |
| 4/28/09 | 108.5 |
| 4/28/09 | 108.2 |
| 4/28/09 | 107.4 |
| 4/28/09 | 104.7 |
| 4/28/09 | 105.5 |
| 4/28/09 | 104.6 |
| 4/28/09 | 104.8 |
| 4/28/09 | 104.7 |
| 4/28/09 | 104.9 |
| 4/28/09 | 105.8 |
| 4/28/09 | 106.2 |
| 4/28/09 | 106.3 |
| 4/28/09 | 106.5 |
| 4/28/09 | 106.5 |
| 4/28/09 | 107.2 |
| 4/28/09 | 107.1 |
| 4/28/09 | 108 |
| 4/28/09 | 107.4 |
| 4/28/09 | 108.4 |
| 4/28/09 | 108.7 |
| 4/28/09 | 109 |
| 4/27/09 | 110.1 |
| 4/27/09 | 110.7 |
| 4/27/09 | 109.9 |
| 4/27/09 | 110.3 |
| 4/27/09 | 109.7 |
| 4/27/09 | 110.5 |
| 4/27/09 | 111 |
| 4/27/09 | 109.1 |
| 4/27/09 | 110.7 |
| 4/27/09 | 109.5 |
| 4/27/09 | 109.4 |
| 4/27/09 | 109.7 |
| 4/27/09 | 109.2 |
| 4/27/09 | 108.3 |
| 4/27/09 | 107.3 |
| 4/27/09 | 107.2 |
| 4/27/09 | 107.1 |
| 4/27/09 | 105 |